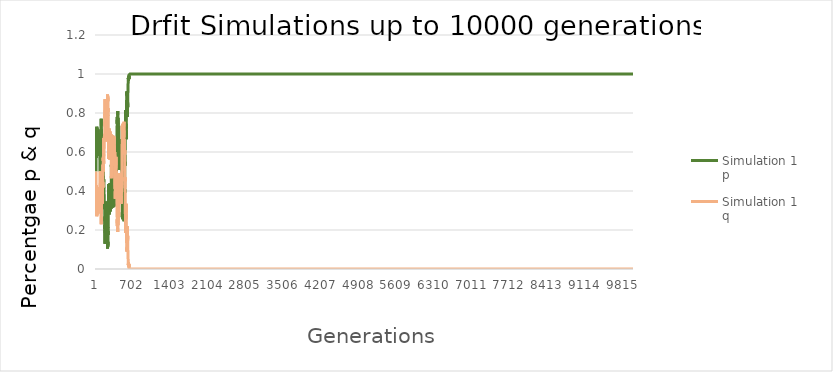
| Category | Simulation 1 p | Simulation 1 q |
|---|---|---|
| 0 | 0.5 | 0.5 |
| 1 | 0.54 | 0.46 |
| 2 | 0.58 | 0.42 |
| 3 | 0.605 | 0.395 |
| 4 | 0.625 | 0.375 |
| 5 | 0.57 | 0.43 |
| 6 | 0.65 | 0.35 |
| 7 | 0.68 | 0.32 |
| 8 | 0.685 | 0.315 |
| 9 | 0.695 | 0.305 |
| 10 | 0.665 | 0.335 |
| 11 | 0.705 | 0.295 |
| 12 | 0.73 | 0.27 |
| 13 | 0.72 | 0.28 |
| 14 | 0.705 | 0.295 |
| 15 | 0.725 | 0.275 |
| 16 | 0.71 | 0.29 |
| 17 | 0.72 | 0.28 |
| 18 | 0.69 | 0.31 |
| 19 | 0.685 | 0.315 |
| 20 | 0.69 | 0.31 |
| 21 | 0.675 | 0.325 |
| 22 | 0.62 | 0.38 |
| 23 | 0.66 | 0.34 |
| 24 | 0.7 | 0.3 |
| 25 | 0.635 | 0.365 |
| 26 | 0.62 | 0.38 |
| 27 | 0.59 | 0.41 |
| 28 | 0.625 | 0.375 |
| 29 | 0.635 | 0.365 |
| 30 | 0.63 | 0.37 |
| 31 | 0.595 | 0.405 |
| 32 | 0.595 | 0.405 |
| 33 | 0.595 | 0.405 |
| 34 | 0.61 | 0.39 |
| 35 | 0.645 | 0.355 |
| 36 | 0.65 | 0.35 |
| 37 | 0.675 | 0.325 |
| 38 | 0.715 | 0.285 |
| 39 | 0.685 | 0.315 |
| 40 | 0.665 | 0.335 |
| 41 | 0.67 | 0.33 |
| 42 | 0.64 | 0.36 |
| 43 | 0.6 | 0.4 |
| 44 | 0.58 | 0.42 |
| 45 | 0.575 | 0.425 |
| 46 | 0.625 | 0.375 |
| 47 | 0.63 | 0.37 |
| 48 | 0.645 | 0.355 |
| 49 | 0.63 | 0.37 |
| 50 | 0.6 | 0.4 |
| 51 | 0.66 | 0.34 |
| 52 | 0.645 | 0.355 |
| 53 | 0.655 | 0.345 |
| 54 | 0.655 | 0.345 |
| 55 | 0.61 | 0.39 |
| 56 | 0.645 | 0.355 |
| 57 | 0.6 | 0.4 |
| 58 | 0.635 | 0.365 |
| 59 | 0.63 | 0.37 |
| 60 | 0.64 | 0.36 |
| 61 | 0.605 | 0.395 |
| 62 | 0.595 | 0.405 |
| 63 | 0.645 | 0.355 |
| 64 | 0.615 | 0.385 |
| 65 | 0.645 | 0.355 |
| 66 | 0.65 | 0.35 |
| 67 | 0.635 | 0.365 |
| 68 | 0.65 | 0.35 |
| 69 | 0.63 | 0.37 |
| 70 | 0.6 | 0.4 |
| 71 | 0.695 | 0.305 |
| 72 | 0.66 | 0.34 |
| 73 | 0.625 | 0.375 |
| 74 | 0.63 | 0.37 |
| 75 | 0.595 | 0.405 |
| 76 | 0.615 | 0.385 |
| 77 | 0.62 | 0.38 |
| 78 | 0.56 | 0.44 |
| 79 | 0.5 | 0.5 |
| 80 | 0.595 | 0.405 |
| 81 | 0.61 | 0.39 |
| 82 | 0.61 | 0.39 |
| 83 | 0.585 | 0.415 |
| 84 | 0.53 | 0.47 |
| 85 | 0.5 | 0.5 |
| 86 | 0.52 | 0.48 |
| 87 | 0.57 | 0.43 |
| 88 | 0.54 | 0.46 |
| 89 | 0.585 | 0.415 |
| 90 | 0.605 | 0.395 |
| 91 | 0.62 | 0.38 |
| 92 | 0.61 | 0.39 |
| 93 | 0.625 | 0.375 |
| 94 | 0.575 | 0.425 |
| 95 | 0.675 | 0.325 |
| 96 | 0.77 | 0.23 |
| 97 | 0.735 | 0.265 |
| 98 | 0.69 | 0.31 |
| 99 | 0.715 | 0.285 |
| 100 | 0.655 | 0.345 |
| 101 | 0.635 | 0.365 |
| 102 | 0.6 | 0.4 |
| 103 | 0.655 | 0.345 |
| 104 | 0.645 | 0.355 |
| 105 | 0.635 | 0.365 |
| 106 | 0.62 | 0.38 |
| 107 | 0.62 | 0.38 |
| 108 | 0.57 | 0.43 |
| 109 | 0.605 | 0.395 |
| 110 | 0.56 | 0.44 |
| 111 | 0.555 | 0.445 |
| 112 | 0.545 | 0.455 |
| 113 | 0.555 | 0.445 |
| 114 | 0.55 | 0.45 |
| 115 | 0.58 | 0.42 |
| 116 | 0.555 | 0.445 |
| 117 | 0.645 | 0.355 |
| 118 | 0.665 | 0.335 |
| 119 | 0.61 | 0.39 |
| 120 | 0.565 | 0.435 |
| 121 | 0.565 | 0.435 |
| 122 | 0.55 | 0.45 |
| 123 | 0.58 | 0.42 |
| 124 | 0.555 | 0.445 |
| 125 | 0.585 | 0.415 |
| 126 | 0.545 | 0.455 |
| 127 | 0.535 | 0.465 |
| 128 | 0.495 | 0.505 |
| 129 | 0.465 | 0.535 |
| 130 | 0.465 | 0.535 |
| 131 | 0.47 | 0.53 |
| 132 | 0.5 | 0.5 |
| 133 | 0.46 | 0.54 |
| 134 | 0.43 | 0.57 |
| 135 | 0.445 | 0.555 |
| 136 | 0.43 | 0.57 |
| 137 | 0.42 | 0.58 |
| 138 | 0.365 | 0.635 |
| 139 | 0.33 | 0.67 |
| 140 | 0.395 | 0.605 |
| 141 | 0.405 | 0.595 |
| 142 | 0.4 | 0.6 |
| 143 | 0.46 | 0.54 |
| 144 | 0.445 | 0.555 |
| 145 | 0.44 | 0.56 |
| 146 | 0.42 | 0.58 |
| 147 | 0.42 | 0.58 |
| 148 | 0.42 | 0.58 |
| 149 | 0.425 | 0.575 |
| 150 | 0.415 | 0.585 |
| 151 | 0.38 | 0.62 |
| 152 | 0.37 | 0.63 |
| 153 | 0.375 | 0.625 |
| 154 | 0.325 | 0.675 |
| 155 | 0.33 | 0.67 |
| 156 | 0.32 | 0.68 |
| 157 | 0.33 | 0.67 |
| 158 | 0.31 | 0.69 |
| 159 | 0.32 | 0.68 |
| 160 | 0.305 | 0.695 |
| 161 | 0.27 | 0.73 |
| 162 | 0.22 | 0.78 |
| 163 | 0.205 | 0.795 |
| 164 | 0.225 | 0.775 |
| 165 | 0.185 | 0.815 |
| 166 | 0.13 | 0.87 |
| 167 | 0.135 | 0.865 |
| 168 | 0.2 | 0.8 |
| 169 | 0.255 | 0.745 |
| 170 | 0.245 | 0.755 |
| 171 | 0.27 | 0.73 |
| 172 | 0.255 | 0.745 |
| 173 | 0.265 | 0.735 |
| 174 | 0.245 | 0.755 |
| 175 | 0.245 | 0.755 |
| 176 | 0.285 | 0.715 |
| 177 | 0.325 | 0.675 |
| 178 | 0.285 | 0.715 |
| 179 | 0.345 | 0.655 |
| 180 | 0.315 | 0.685 |
| 181 | 0.305 | 0.695 |
| 182 | 0.255 | 0.745 |
| 183 | 0.24 | 0.76 |
| 184 | 0.245 | 0.755 |
| 185 | 0.3 | 0.7 |
| 186 | 0.26 | 0.74 |
| 187 | 0.345 | 0.655 |
| 188 | 0.325 | 0.675 |
| 189 | 0.325 | 0.675 |
| 190 | 0.305 | 0.695 |
| 191 | 0.31 | 0.69 |
| 192 | 0.265 | 0.735 |
| 193 | 0.275 | 0.725 |
| 194 | 0.265 | 0.735 |
| 195 | 0.235 | 0.765 |
| 196 | 0.255 | 0.745 |
| 197 | 0.275 | 0.725 |
| 198 | 0.275 | 0.725 |
| 199 | 0.235 | 0.765 |
| 200 | 0.215 | 0.785 |
| 201 | 0.22 | 0.78 |
| 202 | 0.165 | 0.835 |
| 203 | 0.18 | 0.82 |
| 204 | 0.185 | 0.815 |
| 205 | 0.175 | 0.825 |
| 206 | 0.18 | 0.82 |
| 207 | 0.185 | 0.815 |
| 208 | 0.21 | 0.79 |
| 209 | 0.255 | 0.745 |
| 210 | 0.19 | 0.81 |
| 211 | 0.19 | 0.81 |
| 212 | 0.155 | 0.845 |
| 213 | 0.12 | 0.88 |
| 214 | 0.135 | 0.865 |
| 215 | 0.105 | 0.895 |
| 216 | 0.115 | 0.885 |
| 217 | 0.115 | 0.885 |
| 218 | 0.125 | 0.875 |
| 219 | 0.14 | 0.86 |
| 220 | 0.115 | 0.885 |
| 221 | 0.14 | 0.86 |
| 222 | 0.17 | 0.83 |
| 223 | 0.195 | 0.805 |
| 224 | 0.175 | 0.825 |
| 225 | 0.215 | 0.785 |
| 226 | 0.245 | 0.755 |
| 227 | 0.265 | 0.735 |
| 228 | 0.275 | 0.725 |
| 229 | 0.33 | 0.67 |
| 230 | 0.365 | 0.635 |
| 231 | 0.39 | 0.61 |
| 232 | 0.435 | 0.565 |
| 233 | 0.38 | 0.62 |
| 234 | 0.36 | 0.64 |
| 235 | 0.375 | 0.625 |
| 236 | 0.385 | 0.615 |
| 237 | 0.41 | 0.59 |
| 238 | 0.405 | 0.595 |
| 239 | 0.375 | 0.625 |
| 240 | 0.345 | 0.655 |
| 241 | 0.37 | 0.63 |
| 242 | 0.41 | 0.59 |
| 243 | 0.35 | 0.65 |
| 244 | 0.28 | 0.72 |
| 245 | 0.315 | 0.685 |
| 246 | 0.335 | 0.665 |
| 247 | 0.33 | 0.67 |
| 248 | 0.345 | 0.655 |
| 249 | 0.375 | 0.625 |
| 250 | 0.365 | 0.635 |
| 251 | 0.41 | 0.59 |
| 252 | 0.42 | 0.58 |
| 253 | 0.38 | 0.62 |
| 254 | 0.385 | 0.615 |
| 255 | 0.39 | 0.61 |
| 256 | 0.435 | 0.565 |
| 257 | 0.425 | 0.575 |
| 258 | 0.415 | 0.585 |
| 259 | 0.425 | 0.575 |
| 260 | 0.41 | 0.59 |
| 261 | 0.44 | 0.56 |
| 262 | 0.4 | 0.6 |
| 263 | 0.38 | 0.62 |
| 264 | 0.34 | 0.66 |
| 265 | 0.295 | 0.705 |
| 266 | 0.345 | 0.655 |
| 267 | 0.35 | 0.65 |
| 268 | 0.33 | 0.67 |
| 269 | 0.33 | 0.67 |
| 270 | 0.355 | 0.645 |
| 271 | 0.39 | 0.61 |
| 272 | 0.4 | 0.6 |
| 273 | 0.405 | 0.595 |
| 274 | 0.385 | 0.615 |
| 275 | 0.35 | 0.65 |
| 276 | 0.335 | 0.665 |
| 277 | 0.31 | 0.69 |
| 278 | 0.305 | 0.695 |
| 279 | 0.34 | 0.66 |
| 280 | 0.31 | 0.69 |
| 281 | 0.315 | 0.685 |
| 282 | 0.35 | 0.65 |
| 283 | 0.4 | 0.6 |
| 284 | 0.48 | 0.52 |
| 285 | 0.535 | 0.465 |
| 286 | 0.5 | 0.5 |
| 287 | 0.5 | 0.5 |
| 288 | 0.495 | 0.505 |
| 289 | 0.505 | 0.495 |
| 290 | 0.425 | 0.575 |
| 291 | 0.475 | 0.525 |
| 292 | 0.45 | 0.55 |
| 293 | 0.435 | 0.565 |
| 294 | 0.47 | 0.53 |
| 295 | 0.425 | 0.575 |
| 296 | 0.46 | 0.54 |
| 297 | 0.475 | 0.525 |
| 298 | 0.455 | 0.545 |
| 299 | 0.455 | 0.545 |
| 300 | 0.465 | 0.535 |
| 301 | 0.465 | 0.535 |
| 302 | 0.44 | 0.56 |
| 303 | 0.435 | 0.565 |
| 304 | 0.365 | 0.635 |
| 305 | 0.34 | 0.66 |
| 306 | 0.35 | 0.65 |
| 307 | 0.37 | 0.63 |
| 308 | 0.355 | 0.645 |
| 309 | 0.32 | 0.68 |
| 310 | 0.33 | 0.67 |
| 311 | 0.315 | 0.685 |
| 312 | 0.31 | 0.69 |
| 313 | 0.335 | 0.665 |
| 314 | 0.38 | 0.62 |
| 315 | 0.41 | 0.59 |
| 316 | 0.4 | 0.6 |
| 317 | 0.375 | 0.625 |
| 318 | 0.4 | 0.6 |
| 319 | 0.39 | 0.61 |
| 320 | 0.4 | 0.6 |
| 321 | 0.4 | 0.6 |
| 322 | 0.355 | 0.645 |
| 323 | 0.355 | 0.645 |
| 324 | 0.35 | 0.65 |
| 325 | 0.375 | 0.625 |
| 326 | 0.46 | 0.54 |
| 327 | 0.415 | 0.585 |
| 328 | 0.39 | 0.61 |
| 329 | 0.415 | 0.585 |
| 330 | 0.36 | 0.64 |
| 331 | 0.395 | 0.605 |
| 332 | 0.41 | 0.59 |
| 333 | 0.41 | 0.59 |
| 334 | 0.37 | 0.63 |
| 335 | 0.34 | 0.66 |
| 336 | 0.32 | 0.68 |
| 337 | 0.335 | 0.665 |
| 338 | 0.39 | 0.61 |
| 339 | 0.385 | 0.615 |
| 340 | 0.435 | 0.565 |
| 341 | 0.435 | 0.565 |
| 342 | 0.47 | 0.53 |
| 343 | 0.465 | 0.535 |
| 344 | 0.455 | 0.545 |
| 345 | 0.47 | 0.53 |
| 346 | 0.415 | 0.585 |
| 347 | 0.4 | 0.6 |
| 348 | 0.425 | 0.575 |
| 349 | 0.505 | 0.495 |
| 350 | 0.515 | 0.485 |
| 351 | 0.535 | 0.465 |
| 352 | 0.475 | 0.525 |
| 353 | 0.53 | 0.47 |
| 354 | 0.55 | 0.45 |
| 355 | 0.59 | 0.41 |
| 356 | 0.535 | 0.465 |
| 357 | 0.57 | 0.43 |
| 358 | 0.6 | 0.4 |
| 359 | 0.64 | 0.36 |
| 360 | 0.58 | 0.42 |
| 361 | 0.615 | 0.385 |
| 362 | 0.58 | 0.42 |
| 363 | 0.555 | 0.445 |
| 364 | 0.59 | 0.41 |
| 365 | 0.545 | 0.455 |
| 366 | 0.54 | 0.46 |
| 367 | 0.525 | 0.475 |
| 368 | 0.485 | 0.515 |
| 369 | 0.465 | 0.535 |
| 370 | 0.425 | 0.575 |
| 371 | 0.485 | 0.515 |
| 372 | 0.5 | 0.5 |
| 373 | 0.525 | 0.475 |
| 374 | 0.5 | 0.5 |
| 375 | 0.53 | 0.47 |
| 376 | 0.525 | 0.475 |
| 377 | 0.525 | 0.475 |
| 378 | 0.55 | 0.45 |
| 379 | 0.525 | 0.475 |
| 380 | 0.6 | 0.4 |
| 381 | 0.57 | 0.43 |
| 382 | 0.57 | 0.43 |
| 383 | 0.585 | 0.415 |
| 384 | 0.565 | 0.435 |
| 385 | 0.525 | 0.475 |
| 386 | 0.575 | 0.425 |
| 387 | 0.585 | 0.415 |
| 388 | 0.595 | 0.405 |
| 389 | 0.625 | 0.375 |
| 390 | 0.69 | 0.31 |
| 391 | 0.71 | 0.29 |
| 392 | 0.73 | 0.27 |
| 393 | 0.755 | 0.245 |
| 394 | 0.77 | 0.23 |
| 395 | 0.78 | 0.22 |
| 396 | 0.745 | 0.255 |
| 397 | 0.77 | 0.23 |
| 398 | 0.78 | 0.22 |
| 399 | 0.765 | 0.235 |
| 400 | 0.72 | 0.28 |
| 401 | 0.71 | 0.29 |
| 402 | 0.76 | 0.24 |
| 403 | 0.81 | 0.19 |
| 404 | 0.79 | 0.21 |
| 405 | 0.75 | 0.25 |
| 406 | 0.695 | 0.305 |
| 407 | 0.715 | 0.285 |
| 408 | 0.74 | 0.26 |
| 409 | 0.755 | 0.245 |
| 410 | 0.775 | 0.225 |
| 411 | 0.74 | 0.26 |
| 412 | 0.735 | 0.265 |
| 413 | 0.675 | 0.325 |
| 414 | 0.655 | 0.345 |
| 415 | 0.625 | 0.375 |
| 416 | 0.615 | 0.385 |
| 417 | 0.65 | 0.35 |
| 418 | 0.68 | 0.32 |
| 419 | 0.71 | 0.29 |
| 420 | 0.735 | 0.265 |
| 421 | 0.645 | 0.355 |
| 422 | 0.63 | 0.37 |
| 423 | 0.595 | 0.405 |
| 424 | 0.54 | 0.46 |
| 425 | 0.545 | 0.455 |
| 426 | 0.52 | 0.48 |
| 427 | 0.56 | 0.44 |
| 428 | 0.525 | 0.475 |
| 429 | 0.51 | 0.49 |
| 430 | 0.505 | 0.495 |
| 431 | 0.52 | 0.48 |
| 432 | 0.55 | 0.45 |
| 433 | 0.625 | 0.375 |
| 434 | 0.6 | 0.4 |
| 435 | 0.61 | 0.39 |
| 436 | 0.615 | 0.385 |
| 437 | 0.6 | 0.4 |
| 438 | 0.555 | 0.445 |
| 439 | 0.555 | 0.445 |
| 440 | 0.51 | 0.49 |
| 441 | 0.545 | 0.455 |
| 442 | 0.555 | 0.445 |
| 443 | 0.515 | 0.485 |
| 444 | 0.54 | 0.46 |
| 445 | 0.55 | 0.45 |
| 446 | 0.565 | 0.435 |
| 447 | 0.575 | 0.425 |
| 448 | 0.625 | 0.375 |
| 449 | 0.62 | 0.38 |
| 450 | 0.575 | 0.425 |
| 451 | 0.59 | 0.41 |
| 452 | 0.635 | 0.365 |
| 453 | 0.62 | 0.38 |
| 454 | 0.605 | 0.395 |
| 455 | 0.62 | 0.38 |
| 456 | 0.595 | 0.405 |
| 457 | 0.62 | 0.38 |
| 458 | 0.625 | 0.375 |
| 459 | 0.625 | 0.375 |
| 460 | 0.61 | 0.39 |
| 461 | 0.57 | 0.43 |
| 462 | 0.58 | 0.42 |
| 463 | 0.55 | 0.45 |
| 464 | 0.585 | 0.415 |
| 465 | 0.575 | 0.425 |
| 466 | 0.635 | 0.365 |
| 467 | 0.665 | 0.335 |
| 468 | 0.625 | 0.375 |
| 469 | 0.59 | 0.41 |
| 470 | 0.61 | 0.39 |
| 471 | 0.59 | 0.41 |
| 472 | 0.59 | 0.41 |
| 473 | 0.6 | 0.4 |
| 474 | 0.575 | 0.425 |
| 475 | 0.6 | 0.4 |
| 476 | 0.56 | 0.44 |
| 477 | 0.535 | 0.465 |
| 478 | 0.53 | 0.47 |
| 479 | 0.535 | 0.465 |
| 480 | 0.525 | 0.475 |
| 481 | 0.465 | 0.535 |
| 482 | 0.47 | 0.53 |
| 483 | 0.465 | 0.535 |
| 484 | 0.4 | 0.6 |
| 485 | 0.36 | 0.64 |
| 486 | 0.335 | 0.665 |
| 487 | 0.31 | 0.69 |
| 488 | 0.31 | 0.69 |
| 489 | 0.265 | 0.735 |
| 490 | 0.3 | 0.7 |
| 491 | 0.325 | 0.675 |
| 492 | 0.38 | 0.62 |
| 493 | 0.395 | 0.605 |
| 494 | 0.37 | 0.63 |
| 495 | 0.32 | 0.68 |
| 496 | 0.285 | 0.715 |
| 497 | 0.255 | 0.745 |
| 498 | 0.31 | 0.69 |
| 499 | 0.31 | 0.69 |
| 500 | 0.325 | 0.675 |
| 501 | 0.355 | 0.645 |
| 502 | 0.38 | 0.62 |
| 503 | 0.39 | 0.61 |
| 504 | 0.36 | 0.64 |
| 505 | 0.365 | 0.635 |
| 506 | 0.365 | 0.635 |
| 507 | 0.33 | 0.67 |
| 508 | 0.37 | 0.63 |
| 509 | 0.335 | 0.665 |
| 510 | 0.34 | 0.66 |
| 511 | 0.36 | 0.64 |
| 512 | 0.345 | 0.655 |
| 513 | 0.3 | 0.7 |
| 514 | 0.295 | 0.705 |
| 515 | 0.29 | 0.71 |
| 516 | 0.325 | 0.675 |
| 517 | 0.27 | 0.73 |
| 518 | 0.245 | 0.755 |
| 519 | 0.27 | 0.73 |
| 520 | 0.325 | 0.675 |
| 521 | 0.33 | 0.67 |
| 522 | 0.38 | 0.62 |
| 523 | 0.37 | 0.63 |
| 524 | 0.365 | 0.635 |
| 525 | 0.36 | 0.64 |
| 526 | 0.38 | 0.62 |
| 527 | 0.335 | 0.665 |
| 528 | 0.4 | 0.6 |
| 529 | 0.4 | 0.6 |
| 530 | 0.37 | 0.63 |
| 531 | 0.39 | 0.61 |
| 532 | 0.41 | 0.59 |
| 533 | 0.39 | 0.61 |
| 534 | 0.405 | 0.595 |
| 535 | 0.46 | 0.54 |
| 536 | 0.53 | 0.47 |
| 537 | 0.535 | 0.465 |
| 538 | 0.55 | 0.45 |
| 539 | 0.53 | 0.47 |
| 540 | 0.585 | 0.415 |
| 541 | 0.61 | 0.39 |
| 542 | 0.69 | 0.31 |
| 543 | 0.685 | 0.315 |
| 544 | 0.69 | 0.31 |
| 545 | 0.7 | 0.3 |
| 546 | 0.74 | 0.26 |
| 547 | 0.75 | 0.25 |
| 548 | 0.76 | 0.24 |
| 549 | 0.795 | 0.205 |
| 550 | 0.815 | 0.185 |
| 551 | 0.82 | 0.18 |
| 552 | 0.815 | 0.185 |
| 553 | 0.76 | 0.24 |
| 554 | 0.74 | 0.26 |
| 555 | 0.72 | 0.28 |
| 556 | 0.73 | 0.27 |
| 557 | 0.73 | 0.27 |
| 558 | 0.745 | 0.255 |
| 559 | 0.72 | 0.28 |
| 560 | 0.715 | 0.285 |
| 561 | 0.665 | 0.335 |
| 562 | 0.715 | 0.285 |
| 563 | 0.73 | 0.27 |
| 564 | 0.785 | 0.215 |
| 565 | 0.805 | 0.195 |
| 566 | 0.855 | 0.145 |
| 567 | 0.825 | 0.175 |
| 568 | 0.865 | 0.135 |
| 569 | 0.835 | 0.165 |
| 570 | 0.83 | 0.17 |
| 571 | 0.86 | 0.14 |
| 572 | 0.86 | 0.14 |
| 573 | 0.9 | 0.1 |
| 574 | 0.91 | 0.09 |
| 575 | 0.895 | 0.105 |
| 576 | 0.905 | 0.095 |
| 577 | 0.89 | 0.11 |
| 578 | 0.91 | 0.09 |
| 579 | 0.885 | 0.115 |
| 580 | 0.885 | 0.115 |
| 581 | 0.87 | 0.13 |
| 582 | 0.805 | 0.195 |
| 583 | 0.83 | 0.17 |
| 584 | 0.78 | 0.22 |
| 585 | 0.83 | 0.17 |
| 586 | 0.89 | 0.11 |
| 587 | 0.855 | 0.145 |
| 588 | 0.83 | 0.17 |
| 589 | 0.855 | 0.145 |
| 590 | 0.86 | 0.14 |
| 591 | 0.89 | 0.11 |
| 592 | 0.905 | 0.095 |
| 593 | 0.915 | 0.085 |
| 594 | 0.92 | 0.08 |
| 595 | 0.91 | 0.09 |
| 596 | 0.93 | 0.07 |
| 597 | 0.965 | 0.035 |
| 598 | 0.96 | 0.04 |
| 599 | 0.96 | 0.04 |
| 600 | 0.98 | 0.02 |
| 601 | 0.975 | 0.025 |
| 602 | 0.98 | 0.02 |
| 603 | 0.965 | 0.035 |
| 604 | 0.96 | 0.04 |
| 605 | 0.96 | 0.04 |
| 606 | 0.96 | 0.04 |
| 607 | 0.975 | 0.025 |
| 608 | 0.97 | 0.03 |
| 609 | 0.97 | 0.03 |
| 610 | 0.98 | 0.02 |
| 611 | 0.99 | 0.01 |
| 612 | 0.985 | 0.015 |
| 613 | 0.975 | 0.025 |
| 614 | 0.995 | 0.005 |
| 615 | 1 | 0 |
| 616 | 1 | 0 |
| 617 | 1 | 0 |
| 618 | 1 | 0 |
| 619 | 1 | 0 |
| 620 | 1 | 0 |
| 621 | 1 | 0 |
| 622 | 1 | 0 |
| 623 | 1 | 0 |
| 624 | 1 | 0 |
| 625 | 1 | 0 |
| 626 | 1 | 0 |
| 627 | 1 | 0 |
| 628 | 1 | 0 |
| 629 | 1 | 0 |
| 630 | 1 | 0 |
| 631 | 1 | 0 |
| 632 | 1 | 0 |
| 633 | 1 | 0 |
| 634 | 1 | 0 |
| 635 | 1 | 0 |
| 636 | 1 | 0 |
| 637 | 1 | 0 |
| 638 | 1 | 0 |
| 639 | 1 | 0 |
| 640 | 1 | 0 |
| 641 | 1 | 0 |
| 642 | 1 | 0 |
| 643 | 1 | 0 |
| 644 | 1 | 0 |
| 645 | 1 | 0 |
| 646 | 1 | 0 |
| 647 | 1 | 0 |
| 648 | 1 | 0 |
| 649 | 1 | 0 |
| 650 | 1 | 0 |
| 651 | 1 | 0 |
| 652 | 1 | 0 |
| 653 | 1 | 0 |
| 654 | 1 | 0 |
| 655 | 1 | 0 |
| 656 | 1 | 0 |
| 657 | 1 | 0 |
| 658 | 1 | 0 |
| 659 | 1 | 0 |
| 660 | 1 | 0 |
| 661 | 1 | 0 |
| 662 | 1 | 0 |
| 663 | 1 | 0 |
| 664 | 1 | 0 |
| 665 | 1 | 0 |
| 666 | 1 | 0 |
| 667 | 1 | 0 |
| 668 | 1 | 0 |
| 669 | 1 | 0 |
| 670 | 1 | 0 |
| 671 | 1 | 0 |
| 672 | 1 | 0 |
| 673 | 1 | 0 |
| 674 | 1 | 0 |
| 675 | 1 | 0 |
| 676 | 1 | 0 |
| 677 | 1 | 0 |
| 678 | 1 | 0 |
| 679 | 1 | 0 |
| 680 | 1 | 0 |
| 681 | 1 | 0 |
| 682 | 1 | 0 |
| 683 | 1 | 0 |
| 684 | 1 | 0 |
| 685 | 1 | 0 |
| 686 | 1 | 0 |
| 687 | 1 | 0 |
| 688 | 1 | 0 |
| 689 | 1 | 0 |
| 690 | 1 | 0 |
| 691 | 1 | 0 |
| 692 | 1 | 0 |
| 693 | 1 | 0 |
| 694 | 1 | 0 |
| 695 | 1 | 0 |
| 696 | 1 | 0 |
| 697 | 1 | 0 |
| 698 | 1 | 0 |
| 699 | 1 | 0 |
| 700 | 1 | 0 |
| 701 | 1 | 0 |
| 702 | 1 | 0 |
| 703 | 1 | 0 |
| 704 | 1 | 0 |
| 705 | 1 | 0 |
| 706 | 1 | 0 |
| 707 | 1 | 0 |
| 708 | 1 | 0 |
| 709 | 1 | 0 |
| 710 | 1 | 0 |
| 711 | 1 | 0 |
| 712 | 1 | 0 |
| 713 | 1 | 0 |
| 714 | 1 | 0 |
| 715 | 1 | 0 |
| 716 | 1 | 0 |
| 717 | 1 | 0 |
| 718 | 1 | 0 |
| 719 | 1 | 0 |
| 720 | 1 | 0 |
| 721 | 1 | 0 |
| 722 | 1 | 0 |
| 723 | 1 | 0 |
| 724 | 1 | 0 |
| 725 | 1 | 0 |
| 726 | 1 | 0 |
| 727 | 1 | 0 |
| 728 | 1 | 0 |
| 729 | 1 | 0 |
| 730 | 1 | 0 |
| 731 | 1 | 0 |
| 732 | 1 | 0 |
| 733 | 1 | 0 |
| 734 | 1 | 0 |
| 735 | 1 | 0 |
| 736 | 1 | 0 |
| 737 | 1 | 0 |
| 738 | 1 | 0 |
| 739 | 1 | 0 |
| 740 | 1 | 0 |
| 741 | 1 | 0 |
| 742 | 1 | 0 |
| 743 | 1 | 0 |
| 744 | 1 | 0 |
| 745 | 1 | 0 |
| 746 | 1 | 0 |
| 747 | 1 | 0 |
| 748 | 1 | 0 |
| 749 | 1 | 0 |
| 750 | 1 | 0 |
| 751 | 1 | 0 |
| 752 | 1 | 0 |
| 753 | 1 | 0 |
| 754 | 1 | 0 |
| 755 | 1 | 0 |
| 756 | 1 | 0 |
| 757 | 1 | 0 |
| 758 | 1 | 0 |
| 759 | 1 | 0 |
| 760 | 1 | 0 |
| 761 | 1 | 0 |
| 762 | 1 | 0 |
| 763 | 1 | 0 |
| 764 | 1 | 0 |
| 765 | 1 | 0 |
| 766 | 1 | 0 |
| 767 | 1 | 0 |
| 768 | 1 | 0 |
| 769 | 1 | 0 |
| 770 | 1 | 0 |
| 771 | 1 | 0 |
| 772 | 1 | 0 |
| 773 | 1 | 0 |
| 774 | 1 | 0 |
| 775 | 1 | 0 |
| 776 | 1 | 0 |
| 777 | 1 | 0 |
| 778 | 1 | 0 |
| 779 | 1 | 0 |
| 780 | 1 | 0 |
| 781 | 1 | 0 |
| 782 | 1 | 0 |
| 783 | 1 | 0 |
| 784 | 1 | 0 |
| 785 | 1 | 0 |
| 786 | 1 | 0 |
| 787 | 1 | 0 |
| 788 | 1 | 0 |
| 789 | 1 | 0 |
| 790 | 1 | 0 |
| 791 | 1 | 0 |
| 792 | 1 | 0 |
| 793 | 1 | 0 |
| 794 | 1 | 0 |
| 795 | 1 | 0 |
| 796 | 1 | 0 |
| 797 | 1 | 0 |
| 798 | 1 | 0 |
| 799 | 1 | 0 |
| 800 | 1 | 0 |
| 801 | 1 | 0 |
| 802 | 1 | 0 |
| 803 | 1 | 0 |
| 804 | 1 | 0 |
| 805 | 1 | 0 |
| 806 | 1 | 0 |
| 807 | 1 | 0 |
| 808 | 1 | 0 |
| 809 | 1 | 0 |
| 810 | 1 | 0 |
| 811 | 1 | 0 |
| 812 | 1 | 0 |
| 813 | 1 | 0 |
| 814 | 1 | 0 |
| 815 | 1 | 0 |
| 816 | 1 | 0 |
| 817 | 1 | 0 |
| 818 | 1 | 0 |
| 819 | 1 | 0 |
| 820 | 1 | 0 |
| 821 | 1 | 0 |
| 822 | 1 | 0 |
| 823 | 1 | 0 |
| 824 | 1 | 0 |
| 825 | 1 | 0 |
| 826 | 1 | 0 |
| 827 | 1 | 0 |
| 828 | 1 | 0 |
| 829 | 1 | 0 |
| 830 | 1 | 0 |
| 831 | 1 | 0 |
| 832 | 1 | 0 |
| 833 | 1 | 0 |
| 834 | 1 | 0 |
| 835 | 1 | 0 |
| 836 | 1 | 0 |
| 837 | 1 | 0 |
| 838 | 1 | 0 |
| 839 | 1 | 0 |
| 840 | 1 | 0 |
| 841 | 1 | 0 |
| 842 | 1 | 0 |
| 843 | 1 | 0 |
| 844 | 1 | 0 |
| 845 | 1 | 0 |
| 846 | 1 | 0 |
| 847 | 1 | 0 |
| 848 | 1 | 0 |
| 849 | 1 | 0 |
| 850 | 1 | 0 |
| 851 | 1 | 0 |
| 852 | 1 | 0 |
| 853 | 1 | 0 |
| 854 | 1 | 0 |
| 855 | 1 | 0 |
| 856 | 1 | 0 |
| 857 | 1 | 0 |
| 858 | 1 | 0 |
| 859 | 1 | 0 |
| 860 | 1 | 0 |
| 861 | 1 | 0 |
| 862 | 1 | 0 |
| 863 | 1 | 0 |
| 864 | 1 | 0 |
| 865 | 1 | 0 |
| 866 | 1 | 0 |
| 867 | 1 | 0 |
| 868 | 1 | 0 |
| 869 | 1 | 0 |
| 870 | 1 | 0 |
| 871 | 1 | 0 |
| 872 | 1 | 0 |
| 873 | 1 | 0 |
| 874 | 1 | 0 |
| 875 | 1 | 0 |
| 876 | 1 | 0 |
| 877 | 1 | 0 |
| 878 | 1 | 0 |
| 879 | 1 | 0 |
| 880 | 1 | 0 |
| 881 | 1 | 0 |
| 882 | 1 | 0 |
| 883 | 1 | 0 |
| 884 | 1 | 0 |
| 885 | 1 | 0 |
| 886 | 1 | 0 |
| 887 | 1 | 0 |
| 888 | 1 | 0 |
| 889 | 1 | 0 |
| 890 | 1 | 0 |
| 891 | 1 | 0 |
| 892 | 1 | 0 |
| 893 | 1 | 0 |
| 894 | 1 | 0 |
| 895 | 1 | 0 |
| 896 | 1 | 0 |
| 897 | 1 | 0 |
| 898 | 1 | 0 |
| 899 | 1 | 0 |
| 900 | 1 | 0 |
| 901 | 1 | 0 |
| 902 | 1 | 0 |
| 903 | 1 | 0 |
| 904 | 1 | 0 |
| 905 | 1 | 0 |
| 906 | 1 | 0 |
| 907 | 1 | 0 |
| 908 | 1 | 0 |
| 909 | 1 | 0 |
| 910 | 1 | 0 |
| 911 | 1 | 0 |
| 912 | 1 | 0 |
| 913 | 1 | 0 |
| 914 | 1 | 0 |
| 915 | 1 | 0 |
| 916 | 1 | 0 |
| 917 | 1 | 0 |
| 918 | 1 | 0 |
| 919 | 1 | 0 |
| 920 | 1 | 0 |
| 921 | 1 | 0 |
| 922 | 1 | 0 |
| 923 | 1 | 0 |
| 924 | 1 | 0 |
| 925 | 1 | 0 |
| 926 | 1 | 0 |
| 927 | 1 | 0 |
| 928 | 1 | 0 |
| 929 | 1 | 0 |
| 930 | 1 | 0 |
| 931 | 1 | 0 |
| 932 | 1 | 0 |
| 933 | 1 | 0 |
| 934 | 1 | 0 |
| 935 | 1 | 0 |
| 936 | 1 | 0 |
| 937 | 1 | 0 |
| 938 | 1 | 0 |
| 939 | 1 | 0 |
| 940 | 1 | 0 |
| 941 | 1 | 0 |
| 942 | 1 | 0 |
| 943 | 1 | 0 |
| 944 | 1 | 0 |
| 945 | 1 | 0 |
| 946 | 1 | 0 |
| 947 | 1 | 0 |
| 948 | 1 | 0 |
| 949 | 1 | 0 |
| 950 | 1 | 0 |
| 951 | 1 | 0 |
| 952 | 1 | 0 |
| 953 | 1 | 0 |
| 954 | 1 | 0 |
| 955 | 1 | 0 |
| 956 | 1 | 0 |
| 957 | 1 | 0 |
| 958 | 1 | 0 |
| 959 | 1 | 0 |
| 960 | 1 | 0 |
| 961 | 1 | 0 |
| 962 | 1 | 0 |
| 963 | 1 | 0 |
| 964 | 1 | 0 |
| 965 | 1 | 0 |
| 966 | 1 | 0 |
| 967 | 1 | 0 |
| 968 | 1 | 0 |
| 969 | 1 | 0 |
| 970 | 1 | 0 |
| 971 | 1 | 0 |
| 972 | 1 | 0 |
| 973 | 1 | 0 |
| 974 | 1 | 0 |
| 975 | 1 | 0 |
| 976 | 1 | 0 |
| 977 | 1 | 0 |
| 978 | 1 | 0 |
| 979 | 1 | 0 |
| 980 | 1 | 0 |
| 981 | 1 | 0 |
| 982 | 1 | 0 |
| 983 | 1 | 0 |
| 984 | 1 | 0 |
| 985 | 1 | 0 |
| 986 | 1 | 0 |
| 987 | 1 | 0 |
| 988 | 1 | 0 |
| 989 | 1 | 0 |
| 990 | 1 | 0 |
| 991 | 1 | 0 |
| 992 | 1 | 0 |
| 993 | 1 | 0 |
| 994 | 1 | 0 |
| 995 | 1 | 0 |
| 996 | 1 | 0 |
| 997 | 1 | 0 |
| 998 | 1 | 0 |
| 999 | 1 | 0 |
| 1000 | 1 | 0 |
| 1001 | 1 | 0 |
| 1002 | 1 | 0 |
| 1003 | 1 | 0 |
| 1004 | 1 | 0 |
| 1005 | 1 | 0 |
| 1006 | 1 | 0 |
| 1007 | 1 | 0 |
| 1008 | 1 | 0 |
| 1009 | 1 | 0 |
| 1010 | 1 | 0 |
| 1011 | 1 | 0 |
| 1012 | 1 | 0 |
| 1013 | 1 | 0 |
| 1014 | 1 | 0 |
| 1015 | 1 | 0 |
| 1016 | 1 | 0 |
| 1017 | 1 | 0 |
| 1018 | 1 | 0 |
| 1019 | 1 | 0 |
| 1020 | 1 | 0 |
| 1021 | 1 | 0 |
| 1022 | 1 | 0 |
| 1023 | 1 | 0 |
| 1024 | 1 | 0 |
| 1025 | 1 | 0 |
| 1026 | 1 | 0 |
| 1027 | 1 | 0 |
| 1028 | 1 | 0 |
| 1029 | 1 | 0 |
| 1030 | 1 | 0 |
| 1031 | 1 | 0 |
| 1032 | 1 | 0 |
| 1033 | 1 | 0 |
| 1034 | 1 | 0 |
| 1035 | 1 | 0 |
| 1036 | 1 | 0 |
| 1037 | 1 | 0 |
| 1038 | 1 | 0 |
| 1039 | 1 | 0 |
| 1040 | 1 | 0 |
| 1041 | 1 | 0 |
| 1042 | 1 | 0 |
| 1043 | 1 | 0 |
| 1044 | 1 | 0 |
| 1045 | 1 | 0 |
| 1046 | 1 | 0 |
| 1047 | 1 | 0 |
| 1048 | 1 | 0 |
| 1049 | 1 | 0 |
| 1050 | 1 | 0 |
| 1051 | 1 | 0 |
| 1052 | 1 | 0 |
| 1053 | 1 | 0 |
| 1054 | 1 | 0 |
| 1055 | 1 | 0 |
| 1056 | 1 | 0 |
| 1057 | 1 | 0 |
| 1058 | 1 | 0 |
| 1059 | 1 | 0 |
| 1060 | 1 | 0 |
| 1061 | 1 | 0 |
| 1062 | 1 | 0 |
| 1063 | 1 | 0 |
| 1064 | 1 | 0 |
| 1065 | 1 | 0 |
| 1066 | 1 | 0 |
| 1067 | 1 | 0 |
| 1068 | 1 | 0 |
| 1069 | 1 | 0 |
| 1070 | 1 | 0 |
| 1071 | 1 | 0 |
| 1072 | 1 | 0 |
| 1073 | 1 | 0 |
| 1074 | 1 | 0 |
| 1075 | 1 | 0 |
| 1076 | 1 | 0 |
| 1077 | 1 | 0 |
| 1078 | 1 | 0 |
| 1079 | 1 | 0 |
| 1080 | 1 | 0 |
| 1081 | 1 | 0 |
| 1082 | 1 | 0 |
| 1083 | 1 | 0 |
| 1084 | 1 | 0 |
| 1085 | 1 | 0 |
| 1086 | 1 | 0 |
| 1087 | 1 | 0 |
| 1088 | 1 | 0 |
| 1089 | 1 | 0 |
| 1090 | 1 | 0 |
| 1091 | 1 | 0 |
| 1092 | 1 | 0 |
| 1093 | 1 | 0 |
| 1094 | 1 | 0 |
| 1095 | 1 | 0 |
| 1096 | 1 | 0 |
| 1097 | 1 | 0 |
| 1098 | 1 | 0 |
| 1099 | 1 | 0 |
| 1100 | 1 | 0 |
| 1101 | 1 | 0 |
| 1102 | 1 | 0 |
| 1103 | 1 | 0 |
| 1104 | 1 | 0 |
| 1105 | 1 | 0 |
| 1106 | 1 | 0 |
| 1107 | 1 | 0 |
| 1108 | 1 | 0 |
| 1109 | 1 | 0 |
| 1110 | 1 | 0 |
| 1111 | 1 | 0 |
| 1112 | 1 | 0 |
| 1113 | 1 | 0 |
| 1114 | 1 | 0 |
| 1115 | 1 | 0 |
| 1116 | 1 | 0 |
| 1117 | 1 | 0 |
| 1118 | 1 | 0 |
| 1119 | 1 | 0 |
| 1120 | 1 | 0 |
| 1121 | 1 | 0 |
| 1122 | 1 | 0 |
| 1123 | 1 | 0 |
| 1124 | 1 | 0 |
| 1125 | 1 | 0 |
| 1126 | 1 | 0 |
| 1127 | 1 | 0 |
| 1128 | 1 | 0 |
| 1129 | 1 | 0 |
| 1130 | 1 | 0 |
| 1131 | 1 | 0 |
| 1132 | 1 | 0 |
| 1133 | 1 | 0 |
| 1134 | 1 | 0 |
| 1135 | 1 | 0 |
| 1136 | 1 | 0 |
| 1137 | 1 | 0 |
| 1138 | 1 | 0 |
| 1139 | 1 | 0 |
| 1140 | 1 | 0 |
| 1141 | 1 | 0 |
| 1142 | 1 | 0 |
| 1143 | 1 | 0 |
| 1144 | 1 | 0 |
| 1145 | 1 | 0 |
| 1146 | 1 | 0 |
| 1147 | 1 | 0 |
| 1148 | 1 | 0 |
| 1149 | 1 | 0 |
| 1150 | 1 | 0 |
| 1151 | 1 | 0 |
| 1152 | 1 | 0 |
| 1153 | 1 | 0 |
| 1154 | 1 | 0 |
| 1155 | 1 | 0 |
| 1156 | 1 | 0 |
| 1157 | 1 | 0 |
| 1158 | 1 | 0 |
| 1159 | 1 | 0 |
| 1160 | 1 | 0 |
| 1161 | 1 | 0 |
| 1162 | 1 | 0 |
| 1163 | 1 | 0 |
| 1164 | 1 | 0 |
| 1165 | 1 | 0 |
| 1166 | 1 | 0 |
| 1167 | 1 | 0 |
| 1168 | 1 | 0 |
| 1169 | 1 | 0 |
| 1170 | 1 | 0 |
| 1171 | 1 | 0 |
| 1172 | 1 | 0 |
| 1173 | 1 | 0 |
| 1174 | 1 | 0 |
| 1175 | 1 | 0 |
| 1176 | 1 | 0 |
| 1177 | 1 | 0 |
| 1178 | 1 | 0 |
| 1179 | 1 | 0 |
| 1180 | 1 | 0 |
| 1181 | 1 | 0 |
| 1182 | 1 | 0 |
| 1183 | 1 | 0 |
| 1184 | 1 | 0 |
| 1185 | 1 | 0 |
| 1186 | 1 | 0 |
| 1187 | 1 | 0 |
| 1188 | 1 | 0 |
| 1189 | 1 | 0 |
| 1190 | 1 | 0 |
| 1191 | 1 | 0 |
| 1192 | 1 | 0 |
| 1193 | 1 | 0 |
| 1194 | 1 | 0 |
| 1195 | 1 | 0 |
| 1196 | 1 | 0 |
| 1197 | 1 | 0 |
| 1198 | 1 | 0 |
| 1199 | 1 | 0 |
| 1200 | 1 | 0 |
| 1201 | 1 | 0 |
| 1202 | 1 | 0 |
| 1203 | 1 | 0 |
| 1204 | 1 | 0 |
| 1205 | 1 | 0 |
| 1206 | 1 | 0 |
| 1207 | 1 | 0 |
| 1208 | 1 | 0 |
| 1209 | 1 | 0 |
| 1210 | 1 | 0 |
| 1211 | 1 | 0 |
| 1212 | 1 | 0 |
| 1213 | 1 | 0 |
| 1214 | 1 | 0 |
| 1215 | 1 | 0 |
| 1216 | 1 | 0 |
| 1217 | 1 | 0 |
| 1218 | 1 | 0 |
| 1219 | 1 | 0 |
| 1220 | 1 | 0 |
| 1221 | 1 | 0 |
| 1222 | 1 | 0 |
| 1223 | 1 | 0 |
| 1224 | 1 | 0 |
| 1225 | 1 | 0 |
| 1226 | 1 | 0 |
| 1227 | 1 | 0 |
| 1228 | 1 | 0 |
| 1229 | 1 | 0 |
| 1230 | 1 | 0 |
| 1231 | 1 | 0 |
| 1232 | 1 | 0 |
| 1233 | 1 | 0 |
| 1234 | 1 | 0 |
| 1235 | 1 | 0 |
| 1236 | 1 | 0 |
| 1237 | 1 | 0 |
| 1238 | 1 | 0 |
| 1239 | 1 | 0 |
| 1240 | 1 | 0 |
| 1241 | 1 | 0 |
| 1242 | 1 | 0 |
| 1243 | 1 | 0 |
| 1244 | 1 | 0 |
| 1245 | 1 | 0 |
| 1246 | 1 | 0 |
| 1247 | 1 | 0 |
| 1248 | 1 | 0 |
| 1249 | 1 | 0 |
| 1250 | 1 | 0 |
| 1251 | 1 | 0 |
| 1252 | 1 | 0 |
| 1253 | 1 | 0 |
| 1254 | 1 | 0 |
| 1255 | 1 | 0 |
| 1256 | 1 | 0 |
| 1257 | 1 | 0 |
| 1258 | 1 | 0 |
| 1259 | 1 | 0 |
| 1260 | 1 | 0 |
| 1261 | 1 | 0 |
| 1262 | 1 | 0 |
| 1263 | 1 | 0 |
| 1264 | 1 | 0 |
| 1265 | 1 | 0 |
| 1266 | 1 | 0 |
| 1267 | 1 | 0 |
| 1268 | 1 | 0 |
| 1269 | 1 | 0 |
| 1270 | 1 | 0 |
| 1271 | 1 | 0 |
| 1272 | 1 | 0 |
| 1273 | 1 | 0 |
| 1274 | 1 | 0 |
| 1275 | 1 | 0 |
| 1276 | 1 | 0 |
| 1277 | 1 | 0 |
| 1278 | 1 | 0 |
| 1279 | 1 | 0 |
| 1280 | 1 | 0 |
| 1281 | 1 | 0 |
| 1282 | 1 | 0 |
| 1283 | 1 | 0 |
| 1284 | 1 | 0 |
| 1285 | 1 | 0 |
| 1286 | 1 | 0 |
| 1287 | 1 | 0 |
| 1288 | 1 | 0 |
| 1289 | 1 | 0 |
| 1290 | 1 | 0 |
| 1291 | 1 | 0 |
| 1292 | 1 | 0 |
| 1293 | 1 | 0 |
| 1294 | 1 | 0 |
| 1295 | 1 | 0 |
| 1296 | 1 | 0 |
| 1297 | 1 | 0 |
| 1298 | 1 | 0 |
| 1299 | 1 | 0 |
| 1300 | 1 | 0 |
| 1301 | 1 | 0 |
| 1302 | 1 | 0 |
| 1303 | 1 | 0 |
| 1304 | 1 | 0 |
| 1305 | 1 | 0 |
| 1306 | 1 | 0 |
| 1307 | 1 | 0 |
| 1308 | 1 | 0 |
| 1309 | 1 | 0 |
| 1310 | 1 | 0 |
| 1311 | 1 | 0 |
| 1312 | 1 | 0 |
| 1313 | 1 | 0 |
| 1314 | 1 | 0 |
| 1315 | 1 | 0 |
| 1316 | 1 | 0 |
| 1317 | 1 | 0 |
| 1318 | 1 | 0 |
| 1319 | 1 | 0 |
| 1320 | 1 | 0 |
| 1321 | 1 | 0 |
| 1322 | 1 | 0 |
| 1323 | 1 | 0 |
| 1324 | 1 | 0 |
| 1325 | 1 | 0 |
| 1326 | 1 | 0 |
| 1327 | 1 | 0 |
| 1328 | 1 | 0 |
| 1329 | 1 | 0 |
| 1330 | 1 | 0 |
| 1331 | 1 | 0 |
| 1332 | 1 | 0 |
| 1333 | 1 | 0 |
| 1334 | 1 | 0 |
| 1335 | 1 | 0 |
| 1336 | 1 | 0 |
| 1337 | 1 | 0 |
| 1338 | 1 | 0 |
| 1339 | 1 | 0 |
| 1340 | 1 | 0 |
| 1341 | 1 | 0 |
| 1342 | 1 | 0 |
| 1343 | 1 | 0 |
| 1344 | 1 | 0 |
| 1345 | 1 | 0 |
| 1346 | 1 | 0 |
| 1347 | 1 | 0 |
| 1348 | 1 | 0 |
| 1349 | 1 | 0 |
| 1350 | 1 | 0 |
| 1351 | 1 | 0 |
| 1352 | 1 | 0 |
| 1353 | 1 | 0 |
| 1354 | 1 | 0 |
| 1355 | 1 | 0 |
| 1356 | 1 | 0 |
| 1357 | 1 | 0 |
| 1358 | 1 | 0 |
| 1359 | 1 | 0 |
| 1360 | 1 | 0 |
| 1361 | 1 | 0 |
| 1362 | 1 | 0 |
| 1363 | 1 | 0 |
| 1364 | 1 | 0 |
| 1365 | 1 | 0 |
| 1366 | 1 | 0 |
| 1367 | 1 | 0 |
| 1368 | 1 | 0 |
| 1369 | 1 | 0 |
| 1370 | 1 | 0 |
| 1371 | 1 | 0 |
| 1372 | 1 | 0 |
| 1373 | 1 | 0 |
| 1374 | 1 | 0 |
| 1375 | 1 | 0 |
| 1376 | 1 | 0 |
| 1377 | 1 | 0 |
| 1378 | 1 | 0 |
| 1379 | 1 | 0 |
| 1380 | 1 | 0 |
| 1381 | 1 | 0 |
| 1382 | 1 | 0 |
| 1383 | 1 | 0 |
| 1384 | 1 | 0 |
| 1385 | 1 | 0 |
| 1386 | 1 | 0 |
| 1387 | 1 | 0 |
| 1388 | 1 | 0 |
| 1389 | 1 | 0 |
| 1390 | 1 | 0 |
| 1391 | 1 | 0 |
| 1392 | 1 | 0 |
| 1393 | 1 | 0 |
| 1394 | 1 | 0 |
| 1395 | 1 | 0 |
| 1396 | 1 | 0 |
| 1397 | 1 | 0 |
| 1398 | 1 | 0 |
| 1399 | 1 | 0 |
| 1400 | 1 | 0 |
| 1401 | 1 | 0 |
| 1402 | 1 | 0 |
| 1403 | 1 | 0 |
| 1404 | 1 | 0 |
| 1405 | 1 | 0 |
| 1406 | 1 | 0 |
| 1407 | 1 | 0 |
| 1408 | 1 | 0 |
| 1409 | 1 | 0 |
| 1410 | 1 | 0 |
| 1411 | 1 | 0 |
| 1412 | 1 | 0 |
| 1413 | 1 | 0 |
| 1414 | 1 | 0 |
| 1415 | 1 | 0 |
| 1416 | 1 | 0 |
| 1417 | 1 | 0 |
| 1418 | 1 | 0 |
| 1419 | 1 | 0 |
| 1420 | 1 | 0 |
| 1421 | 1 | 0 |
| 1422 | 1 | 0 |
| 1423 | 1 | 0 |
| 1424 | 1 | 0 |
| 1425 | 1 | 0 |
| 1426 | 1 | 0 |
| 1427 | 1 | 0 |
| 1428 | 1 | 0 |
| 1429 | 1 | 0 |
| 1430 | 1 | 0 |
| 1431 | 1 | 0 |
| 1432 | 1 | 0 |
| 1433 | 1 | 0 |
| 1434 | 1 | 0 |
| 1435 | 1 | 0 |
| 1436 | 1 | 0 |
| 1437 | 1 | 0 |
| 1438 | 1 | 0 |
| 1439 | 1 | 0 |
| 1440 | 1 | 0 |
| 1441 | 1 | 0 |
| 1442 | 1 | 0 |
| 1443 | 1 | 0 |
| 1444 | 1 | 0 |
| 1445 | 1 | 0 |
| 1446 | 1 | 0 |
| 1447 | 1 | 0 |
| 1448 | 1 | 0 |
| 1449 | 1 | 0 |
| 1450 | 1 | 0 |
| 1451 | 1 | 0 |
| 1452 | 1 | 0 |
| 1453 | 1 | 0 |
| 1454 | 1 | 0 |
| 1455 | 1 | 0 |
| 1456 | 1 | 0 |
| 1457 | 1 | 0 |
| 1458 | 1 | 0 |
| 1459 | 1 | 0 |
| 1460 | 1 | 0 |
| 1461 | 1 | 0 |
| 1462 | 1 | 0 |
| 1463 | 1 | 0 |
| 1464 | 1 | 0 |
| 1465 | 1 | 0 |
| 1466 | 1 | 0 |
| 1467 | 1 | 0 |
| 1468 | 1 | 0 |
| 1469 | 1 | 0 |
| 1470 | 1 | 0 |
| 1471 | 1 | 0 |
| 1472 | 1 | 0 |
| 1473 | 1 | 0 |
| 1474 | 1 | 0 |
| 1475 | 1 | 0 |
| 1476 | 1 | 0 |
| 1477 | 1 | 0 |
| 1478 | 1 | 0 |
| 1479 | 1 | 0 |
| 1480 | 1 | 0 |
| 1481 | 1 | 0 |
| 1482 | 1 | 0 |
| 1483 | 1 | 0 |
| 1484 | 1 | 0 |
| 1485 | 1 | 0 |
| 1486 | 1 | 0 |
| 1487 | 1 | 0 |
| 1488 | 1 | 0 |
| 1489 | 1 | 0 |
| 1490 | 1 | 0 |
| 1491 | 1 | 0 |
| 1492 | 1 | 0 |
| 1493 | 1 | 0 |
| 1494 | 1 | 0 |
| 1495 | 1 | 0 |
| 1496 | 1 | 0 |
| 1497 | 1 | 0 |
| 1498 | 1 | 0 |
| 1499 | 1 | 0 |
| 1500 | 1 | 0 |
| 1501 | 1 | 0 |
| 1502 | 1 | 0 |
| 1503 | 1 | 0 |
| 1504 | 1 | 0 |
| 1505 | 1 | 0 |
| 1506 | 1 | 0 |
| 1507 | 1 | 0 |
| 1508 | 1 | 0 |
| 1509 | 1 | 0 |
| 1510 | 1 | 0 |
| 1511 | 1 | 0 |
| 1512 | 1 | 0 |
| 1513 | 1 | 0 |
| 1514 | 1 | 0 |
| 1515 | 1 | 0 |
| 1516 | 1 | 0 |
| 1517 | 1 | 0 |
| 1518 | 1 | 0 |
| 1519 | 1 | 0 |
| 1520 | 1 | 0 |
| 1521 | 1 | 0 |
| 1522 | 1 | 0 |
| 1523 | 1 | 0 |
| 1524 | 1 | 0 |
| 1525 | 1 | 0 |
| 1526 | 1 | 0 |
| 1527 | 1 | 0 |
| 1528 | 1 | 0 |
| 1529 | 1 | 0 |
| 1530 | 1 | 0 |
| 1531 | 1 | 0 |
| 1532 | 1 | 0 |
| 1533 | 1 | 0 |
| 1534 | 1 | 0 |
| 1535 | 1 | 0 |
| 1536 | 1 | 0 |
| 1537 | 1 | 0 |
| 1538 | 1 | 0 |
| 1539 | 1 | 0 |
| 1540 | 1 | 0 |
| 1541 | 1 | 0 |
| 1542 | 1 | 0 |
| 1543 | 1 | 0 |
| 1544 | 1 | 0 |
| 1545 | 1 | 0 |
| 1546 | 1 | 0 |
| 1547 | 1 | 0 |
| 1548 | 1 | 0 |
| 1549 | 1 | 0 |
| 1550 | 1 | 0 |
| 1551 | 1 | 0 |
| 1552 | 1 | 0 |
| 1553 | 1 | 0 |
| 1554 | 1 | 0 |
| 1555 | 1 | 0 |
| 1556 | 1 | 0 |
| 1557 | 1 | 0 |
| 1558 | 1 | 0 |
| 1559 | 1 | 0 |
| 1560 | 1 | 0 |
| 1561 | 1 | 0 |
| 1562 | 1 | 0 |
| 1563 | 1 | 0 |
| 1564 | 1 | 0 |
| 1565 | 1 | 0 |
| 1566 | 1 | 0 |
| 1567 | 1 | 0 |
| 1568 | 1 | 0 |
| 1569 | 1 | 0 |
| 1570 | 1 | 0 |
| 1571 | 1 | 0 |
| 1572 | 1 | 0 |
| 1573 | 1 | 0 |
| 1574 | 1 | 0 |
| 1575 | 1 | 0 |
| 1576 | 1 | 0 |
| 1577 | 1 | 0 |
| 1578 | 1 | 0 |
| 1579 | 1 | 0 |
| 1580 | 1 | 0 |
| 1581 | 1 | 0 |
| 1582 | 1 | 0 |
| 1583 | 1 | 0 |
| 1584 | 1 | 0 |
| 1585 | 1 | 0 |
| 1586 | 1 | 0 |
| 1587 | 1 | 0 |
| 1588 | 1 | 0 |
| 1589 | 1 | 0 |
| 1590 | 1 | 0 |
| 1591 | 1 | 0 |
| 1592 | 1 | 0 |
| 1593 | 1 | 0 |
| 1594 | 1 | 0 |
| 1595 | 1 | 0 |
| 1596 | 1 | 0 |
| 1597 | 1 | 0 |
| 1598 | 1 | 0 |
| 1599 | 1 | 0 |
| 1600 | 1 | 0 |
| 1601 | 1 | 0 |
| 1602 | 1 | 0 |
| 1603 | 1 | 0 |
| 1604 | 1 | 0 |
| 1605 | 1 | 0 |
| 1606 | 1 | 0 |
| 1607 | 1 | 0 |
| 1608 | 1 | 0 |
| 1609 | 1 | 0 |
| 1610 | 1 | 0 |
| 1611 | 1 | 0 |
| 1612 | 1 | 0 |
| 1613 | 1 | 0 |
| 1614 | 1 | 0 |
| 1615 | 1 | 0 |
| 1616 | 1 | 0 |
| 1617 | 1 | 0 |
| 1618 | 1 | 0 |
| 1619 | 1 | 0 |
| 1620 | 1 | 0 |
| 1621 | 1 | 0 |
| 1622 | 1 | 0 |
| 1623 | 1 | 0 |
| 1624 | 1 | 0 |
| 1625 | 1 | 0 |
| 1626 | 1 | 0 |
| 1627 | 1 | 0 |
| 1628 | 1 | 0 |
| 1629 | 1 | 0 |
| 1630 | 1 | 0 |
| 1631 | 1 | 0 |
| 1632 | 1 | 0 |
| 1633 | 1 | 0 |
| 1634 | 1 | 0 |
| 1635 | 1 | 0 |
| 1636 | 1 | 0 |
| 1637 | 1 | 0 |
| 1638 | 1 | 0 |
| 1639 | 1 | 0 |
| 1640 | 1 | 0 |
| 1641 | 1 | 0 |
| 1642 | 1 | 0 |
| 1643 | 1 | 0 |
| 1644 | 1 | 0 |
| 1645 | 1 | 0 |
| 1646 | 1 | 0 |
| 1647 | 1 | 0 |
| 1648 | 1 | 0 |
| 1649 | 1 | 0 |
| 1650 | 1 | 0 |
| 1651 | 1 | 0 |
| 1652 | 1 | 0 |
| 1653 | 1 | 0 |
| 1654 | 1 | 0 |
| 1655 | 1 | 0 |
| 1656 | 1 | 0 |
| 1657 | 1 | 0 |
| 1658 | 1 | 0 |
| 1659 | 1 | 0 |
| 1660 | 1 | 0 |
| 1661 | 1 | 0 |
| 1662 | 1 | 0 |
| 1663 | 1 | 0 |
| 1664 | 1 | 0 |
| 1665 | 1 | 0 |
| 1666 | 1 | 0 |
| 1667 | 1 | 0 |
| 1668 | 1 | 0 |
| 1669 | 1 | 0 |
| 1670 | 1 | 0 |
| 1671 | 1 | 0 |
| 1672 | 1 | 0 |
| 1673 | 1 | 0 |
| 1674 | 1 | 0 |
| 1675 | 1 | 0 |
| 1676 | 1 | 0 |
| 1677 | 1 | 0 |
| 1678 | 1 | 0 |
| 1679 | 1 | 0 |
| 1680 | 1 | 0 |
| 1681 | 1 | 0 |
| 1682 | 1 | 0 |
| 1683 | 1 | 0 |
| 1684 | 1 | 0 |
| 1685 | 1 | 0 |
| 1686 | 1 | 0 |
| 1687 | 1 | 0 |
| 1688 | 1 | 0 |
| 1689 | 1 | 0 |
| 1690 | 1 | 0 |
| 1691 | 1 | 0 |
| 1692 | 1 | 0 |
| 1693 | 1 | 0 |
| 1694 | 1 | 0 |
| 1695 | 1 | 0 |
| 1696 | 1 | 0 |
| 1697 | 1 | 0 |
| 1698 | 1 | 0 |
| 1699 | 1 | 0 |
| 1700 | 1 | 0 |
| 1701 | 1 | 0 |
| 1702 | 1 | 0 |
| 1703 | 1 | 0 |
| 1704 | 1 | 0 |
| 1705 | 1 | 0 |
| 1706 | 1 | 0 |
| 1707 | 1 | 0 |
| 1708 | 1 | 0 |
| 1709 | 1 | 0 |
| 1710 | 1 | 0 |
| 1711 | 1 | 0 |
| 1712 | 1 | 0 |
| 1713 | 1 | 0 |
| 1714 | 1 | 0 |
| 1715 | 1 | 0 |
| 1716 | 1 | 0 |
| 1717 | 1 | 0 |
| 1718 | 1 | 0 |
| 1719 | 1 | 0 |
| 1720 | 1 | 0 |
| 1721 | 1 | 0 |
| 1722 | 1 | 0 |
| 1723 | 1 | 0 |
| 1724 | 1 | 0 |
| 1725 | 1 | 0 |
| 1726 | 1 | 0 |
| 1727 | 1 | 0 |
| 1728 | 1 | 0 |
| 1729 | 1 | 0 |
| 1730 | 1 | 0 |
| 1731 | 1 | 0 |
| 1732 | 1 | 0 |
| 1733 | 1 | 0 |
| 1734 | 1 | 0 |
| 1735 | 1 | 0 |
| 1736 | 1 | 0 |
| 1737 | 1 | 0 |
| 1738 | 1 | 0 |
| 1739 | 1 | 0 |
| 1740 | 1 | 0 |
| 1741 | 1 | 0 |
| 1742 | 1 | 0 |
| 1743 | 1 | 0 |
| 1744 | 1 | 0 |
| 1745 | 1 | 0 |
| 1746 | 1 | 0 |
| 1747 | 1 | 0 |
| 1748 | 1 | 0 |
| 1749 | 1 | 0 |
| 1750 | 1 | 0 |
| 1751 | 1 | 0 |
| 1752 | 1 | 0 |
| 1753 | 1 | 0 |
| 1754 | 1 | 0 |
| 1755 | 1 | 0 |
| 1756 | 1 | 0 |
| 1757 | 1 | 0 |
| 1758 | 1 | 0 |
| 1759 | 1 | 0 |
| 1760 | 1 | 0 |
| 1761 | 1 | 0 |
| 1762 | 1 | 0 |
| 1763 | 1 | 0 |
| 1764 | 1 | 0 |
| 1765 | 1 | 0 |
| 1766 | 1 | 0 |
| 1767 | 1 | 0 |
| 1768 | 1 | 0 |
| 1769 | 1 | 0 |
| 1770 | 1 | 0 |
| 1771 | 1 | 0 |
| 1772 | 1 | 0 |
| 1773 | 1 | 0 |
| 1774 | 1 | 0 |
| 1775 | 1 | 0 |
| 1776 | 1 | 0 |
| 1777 | 1 | 0 |
| 1778 | 1 | 0 |
| 1779 | 1 | 0 |
| 1780 | 1 | 0 |
| 1781 | 1 | 0 |
| 1782 | 1 | 0 |
| 1783 | 1 | 0 |
| 1784 | 1 | 0 |
| 1785 | 1 | 0 |
| 1786 | 1 | 0 |
| 1787 | 1 | 0 |
| 1788 | 1 | 0 |
| 1789 | 1 | 0 |
| 1790 | 1 | 0 |
| 1791 | 1 | 0 |
| 1792 | 1 | 0 |
| 1793 | 1 | 0 |
| 1794 | 1 | 0 |
| 1795 | 1 | 0 |
| 1796 | 1 | 0 |
| 1797 | 1 | 0 |
| 1798 | 1 | 0 |
| 1799 | 1 | 0 |
| 1800 | 1 | 0 |
| 1801 | 1 | 0 |
| 1802 | 1 | 0 |
| 1803 | 1 | 0 |
| 1804 | 1 | 0 |
| 1805 | 1 | 0 |
| 1806 | 1 | 0 |
| 1807 | 1 | 0 |
| 1808 | 1 | 0 |
| 1809 | 1 | 0 |
| 1810 | 1 | 0 |
| 1811 | 1 | 0 |
| 1812 | 1 | 0 |
| 1813 | 1 | 0 |
| 1814 | 1 | 0 |
| 1815 | 1 | 0 |
| 1816 | 1 | 0 |
| 1817 | 1 | 0 |
| 1818 | 1 | 0 |
| 1819 | 1 | 0 |
| 1820 | 1 | 0 |
| 1821 | 1 | 0 |
| 1822 | 1 | 0 |
| 1823 | 1 | 0 |
| 1824 | 1 | 0 |
| 1825 | 1 | 0 |
| 1826 | 1 | 0 |
| 1827 | 1 | 0 |
| 1828 | 1 | 0 |
| 1829 | 1 | 0 |
| 1830 | 1 | 0 |
| 1831 | 1 | 0 |
| 1832 | 1 | 0 |
| 1833 | 1 | 0 |
| 1834 | 1 | 0 |
| 1835 | 1 | 0 |
| 1836 | 1 | 0 |
| 1837 | 1 | 0 |
| 1838 | 1 | 0 |
| 1839 | 1 | 0 |
| 1840 | 1 | 0 |
| 1841 | 1 | 0 |
| 1842 | 1 | 0 |
| 1843 | 1 | 0 |
| 1844 | 1 | 0 |
| 1845 | 1 | 0 |
| 1846 | 1 | 0 |
| 1847 | 1 | 0 |
| 1848 | 1 | 0 |
| 1849 | 1 | 0 |
| 1850 | 1 | 0 |
| 1851 | 1 | 0 |
| 1852 | 1 | 0 |
| 1853 | 1 | 0 |
| 1854 | 1 | 0 |
| 1855 | 1 | 0 |
| 1856 | 1 | 0 |
| 1857 | 1 | 0 |
| 1858 | 1 | 0 |
| 1859 | 1 | 0 |
| 1860 | 1 | 0 |
| 1861 | 1 | 0 |
| 1862 | 1 | 0 |
| 1863 | 1 | 0 |
| 1864 | 1 | 0 |
| 1865 | 1 | 0 |
| 1866 | 1 | 0 |
| 1867 | 1 | 0 |
| 1868 | 1 | 0 |
| 1869 | 1 | 0 |
| 1870 | 1 | 0 |
| 1871 | 1 | 0 |
| 1872 | 1 | 0 |
| 1873 | 1 | 0 |
| 1874 | 1 | 0 |
| 1875 | 1 | 0 |
| 1876 | 1 | 0 |
| 1877 | 1 | 0 |
| 1878 | 1 | 0 |
| 1879 | 1 | 0 |
| 1880 | 1 | 0 |
| 1881 | 1 | 0 |
| 1882 | 1 | 0 |
| 1883 | 1 | 0 |
| 1884 | 1 | 0 |
| 1885 | 1 | 0 |
| 1886 | 1 | 0 |
| 1887 | 1 | 0 |
| 1888 | 1 | 0 |
| 1889 | 1 | 0 |
| 1890 | 1 | 0 |
| 1891 | 1 | 0 |
| 1892 | 1 | 0 |
| 1893 | 1 | 0 |
| 1894 | 1 | 0 |
| 1895 | 1 | 0 |
| 1896 | 1 | 0 |
| 1897 | 1 | 0 |
| 1898 | 1 | 0 |
| 1899 | 1 | 0 |
| 1900 | 1 | 0 |
| 1901 | 1 | 0 |
| 1902 | 1 | 0 |
| 1903 | 1 | 0 |
| 1904 | 1 | 0 |
| 1905 | 1 | 0 |
| 1906 | 1 | 0 |
| 1907 | 1 | 0 |
| 1908 | 1 | 0 |
| 1909 | 1 | 0 |
| 1910 | 1 | 0 |
| 1911 | 1 | 0 |
| 1912 | 1 | 0 |
| 1913 | 1 | 0 |
| 1914 | 1 | 0 |
| 1915 | 1 | 0 |
| 1916 | 1 | 0 |
| 1917 | 1 | 0 |
| 1918 | 1 | 0 |
| 1919 | 1 | 0 |
| 1920 | 1 | 0 |
| 1921 | 1 | 0 |
| 1922 | 1 | 0 |
| 1923 | 1 | 0 |
| 1924 | 1 | 0 |
| 1925 | 1 | 0 |
| 1926 | 1 | 0 |
| 1927 | 1 | 0 |
| 1928 | 1 | 0 |
| 1929 | 1 | 0 |
| 1930 | 1 | 0 |
| 1931 | 1 | 0 |
| 1932 | 1 | 0 |
| 1933 | 1 | 0 |
| 1934 | 1 | 0 |
| 1935 | 1 | 0 |
| 1936 | 1 | 0 |
| 1937 | 1 | 0 |
| 1938 | 1 | 0 |
| 1939 | 1 | 0 |
| 1940 | 1 | 0 |
| 1941 | 1 | 0 |
| 1942 | 1 | 0 |
| 1943 | 1 | 0 |
| 1944 | 1 | 0 |
| 1945 | 1 | 0 |
| 1946 | 1 | 0 |
| 1947 | 1 | 0 |
| 1948 | 1 | 0 |
| 1949 | 1 | 0 |
| 1950 | 1 | 0 |
| 1951 | 1 | 0 |
| 1952 | 1 | 0 |
| 1953 | 1 | 0 |
| 1954 | 1 | 0 |
| 1955 | 1 | 0 |
| 1956 | 1 | 0 |
| 1957 | 1 | 0 |
| 1958 | 1 | 0 |
| 1959 | 1 | 0 |
| 1960 | 1 | 0 |
| 1961 | 1 | 0 |
| 1962 | 1 | 0 |
| 1963 | 1 | 0 |
| 1964 | 1 | 0 |
| 1965 | 1 | 0 |
| 1966 | 1 | 0 |
| 1967 | 1 | 0 |
| 1968 | 1 | 0 |
| 1969 | 1 | 0 |
| 1970 | 1 | 0 |
| 1971 | 1 | 0 |
| 1972 | 1 | 0 |
| 1973 | 1 | 0 |
| 1974 | 1 | 0 |
| 1975 | 1 | 0 |
| 1976 | 1 | 0 |
| 1977 | 1 | 0 |
| 1978 | 1 | 0 |
| 1979 | 1 | 0 |
| 1980 | 1 | 0 |
| 1981 | 1 | 0 |
| 1982 | 1 | 0 |
| 1983 | 1 | 0 |
| 1984 | 1 | 0 |
| 1985 | 1 | 0 |
| 1986 | 1 | 0 |
| 1987 | 1 | 0 |
| 1988 | 1 | 0 |
| 1989 | 1 | 0 |
| 1990 | 1 | 0 |
| 1991 | 1 | 0 |
| 1992 | 1 | 0 |
| 1993 | 1 | 0 |
| 1994 | 1 | 0 |
| 1995 | 1 | 0 |
| 1996 | 1 | 0 |
| 1997 | 1 | 0 |
| 1998 | 1 | 0 |
| 1999 | 1 | 0 |
| 2000 | 1 | 0 |
| 2001 | 1 | 0 |
| 2002 | 1 | 0 |
| 2003 | 1 | 0 |
| 2004 | 1 | 0 |
| 2005 | 1 | 0 |
| 2006 | 1 | 0 |
| 2007 | 1 | 0 |
| 2008 | 1 | 0 |
| 2009 | 1 | 0 |
| 2010 | 1 | 0 |
| 2011 | 1 | 0 |
| 2012 | 1 | 0 |
| 2013 | 1 | 0 |
| 2014 | 1 | 0 |
| 2015 | 1 | 0 |
| 2016 | 1 | 0 |
| 2017 | 1 | 0 |
| 2018 | 1 | 0 |
| 2019 | 1 | 0 |
| 2020 | 1 | 0 |
| 2021 | 1 | 0 |
| 2022 | 1 | 0 |
| 2023 | 1 | 0 |
| 2024 | 1 | 0 |
| 2025 | 1 | 0 |
| 2026 | 1 | 0 |
| 2027 | 1 | 0 |
| 2028 | 1 | 0 |
| 2029 | 1 | 0 |
| 2030 | 1 | 0 |
| 2031 | 1 | 0 |
| 2032 | 1 | 0 |
| 2033 | 1 | 0 |
| 2034 | 1 | 0 |
| 2035 | 1 | 0 |
| 2036 | 1 | 0 |
| 2037 | 1 | 0 |
| 2038 | 1 | 0 |
| 2039 | 1 | 0 |
| 2040 | 1 | 0 |
| 2041 | 1 | 0 |
| 2042 | 1 | 0 |
| 2043 | 1 | 0 |
| 2044 | 1 | 0 |
| 2045 | 1 | 0 |
| 2046 | 1 | 0 |
| 2047 | 1 | 0 |
| 2048 | 1 | 0 |
| 2049 | 1 | 0 |
| 2050 | 1 | 0 |
| 2051 | 1 | 0 |
| 2052 | 1 | 0 |
| 2053 | 1 | 0 |
| 2054 | 1 | 0 |
| 2055 | 1 | 0 |
| 2056 | 1 | 0 |
| 2057 | 1 | 0 |
| 2058 | 1 | 0 |
| 2059 | 1 | 0 |
| 2060 | 1 | 0 |
| 2061 | 1 | 0 |
| 2062 | 1 | 0 |
| 2063 | 1 | 0 |
| 2064 | 1 | 0 |
| 2065 | 1 | 0 |
| 2066 | 1 | 0 |
| 2067 | 1 | 0 |
| 2068 | 1 | 0 |
| 2069 | 1 | 0 |
| 2070 | 1 | 0 |
| 2071 | 1 | 0 |
| 2072 | 1 | 0 |
| 2073 | 1 | 0 |
| 2074 | 1 | 0 |
| 2075 | 1 | 0 |
| 2076 | 1 | 0 |
| 2077 | 1 | 0 |
| 2078 | 1 | 0 |
| 2079 | 1 | 0 |
| 2080 | 1 | 0 |
| 2081 | 1 | 0 |
| 2082 | 1 | 0 |
| 2083 | 1 | 0 |
| 2084 | 1 | 0 |
| 2085 | 1 | 0 |
| 2086 | 1 | 0 |
| 2087 | 1 | 0 |
| 2088 | 1 | 0 |
| 2089 | 1 | 0 |
| 2090 | 1 | 0 |
| 2091 | 1 | 0 |
| 2092 | 1 | 0 |
| 2093 | 1 | 0 |
| 2094 | 1 | 0 |
| 2095 | 1 | 0 |
| 2096 | 1 | 0 |
| 2097 | 1 | 0 |
| 2098 | 1 | 0 |
| 2099 | 1 | 0 |
| 2100 | 1 | 0 |
| 2101 | 1 | 0 |
| 2102 | 1 | 0 |
| 2103 | 1 | 0 |
| 2104 | 1 | 0 |
| 2105 | 1 | 0 |
| 2106 | 1 | 0 |
| 2107 | 1 | 0 |
| 2108 | 1 | 0 |
| 2109 | 1 | 0 |
| 2110 | 1 | 0 |
| 2111 | 1 | 0 |
| 2112 | 1 | 0 |
| 2113 | 1 | 0 |
| 2114 | 1 | 0 |
| 2115 | 1 | 0 |
| 2116 | 1 | 0 |
| 2117 | 1 | 0 |
| 2118 | 1 | 0 |
| 2119 | 1 | 0 |
| 2120 | 1 | 0 |
| 2121 | 1 | 0 |
| 2122 | 1 | 0 |
| 2123 | 1 | 0 |
| 2124 | 1 | 0 |
| 2125 | 1 | 0 |
| 2126 | 1 | 0 |
| 2127 | 1 | 0 |
| 2128 | 1 | 0 |
| 2129 | 1 | 0 |
| 2130 | 1 | 0 |
| 2131 | 1 | 0 |
| 2132 | 1 | 0 |
| 2133 | 1 | 0 |
| 2134 | 1 | 0 |
| 2135 | 1 | 0 |
| 2136 | 1 | 0 |
| 2137 | 1 | 0 |
| 2138 | 1 | 0 |
| 2139 | 1 | 0 |
| 2140 | 1 | 0 |
| 2141 | 1 | 0 |
| 2142 | 1 | 0 |
| 2143 | 1 | 0 |
| 2144 | 1 | 0 |
| 2145 | 1 | 0 |
| 2146 | 1 | 0 |
| 2147 | 1 | 0 |
| 2148 | 1 | 0 |
| 2149 | 1 | 0 |
| 2150 | 1 | 0 |
| 2151 | 1 | 0 |
| 2152 | 1 | 0 |
| 2153 | 1 | 0 |
| 2154 | 1 | 0 |
| 2155 | 1 | 0 |
| 2156 | 1 | 0 |
| 2157 | 1 | 0 |
| 2158 | 1 | 0 |
| 2159 | 1 | 0 |
| 2160 | 1 | 0 |
| 2161 | 1 | 0 |
| 2162 | 1 | 0 |
| 2163 | 1 | 0 |
| 2164 | 1 | 0 |
| 2165 | 1 | 0 |
| 2166 | 1 | 0 |
| 2167 | 1 | 0 |
| 2168 | 1 | 0 |
| 2169 | 1 | 0 |
| 2170 | 1 | 0 |
| 2171 | 1 | 0 |
| 2172 | 1 | 0 |
| 2173 | 1 | 0 |
| 2174 | 1 | 0 |
| 2175 | 1 | 0 |
| 2176 | 1 | 0 |
| 2177 | 1 | 0 |
| 2178 | 1 | 0 |
| 2179 | 1 | 0 |
| 2180 | 1 | 0 |
| 2181 | 1 | 0 |
| 2182 | 1 | 0 |
| 2183 | 1 | 0 |
| 2184 | 1 | 0 |
| 2185 | 1 | 0 |
| 2186 | 1 | 0 |
| 2187 | 1 | 0 |
| 2188 | 1 | 0 |
| 2189 | 1 | 0 |
| 2190 | 1 | 0 |
| 2191 | 1 | 0 |
| 2192 | 1 | 0 |
| 2193 | 1 | 0 |
| 2194 | 1 | 0 |
| 2195 | 1 | 0 |
| 2196 | 1 | 0 |
| 2197 | 1 | 0 |
| 2198 | 1 | 0 |
| 2199 | 1 | 0 |
| 2200 | 1 | 0 |
| 2201 | 1 | 0 |
| 2202 | 1 | 0 |
| 2203 | 1 | 0 |
| 2204 | 1 | 0 |
| 2205 | 1 | 0 |
| 2206 | 1 | 0 |
| 2207 | 1 | 0 |
| 2208 | 1 | 0 |
| 2209 | 1 | 0 |
| 2210 | 1 | 0 |
| 2211 | 1 | 0 |
| 2212 | 1 | 0 |
| 2213 | 1 | 0 |
| 2214 | 1 | 0 |
| 2215 | 1 | 0 |
| 2216 | 1 | 0 |
| 2217 | 1 | 0 |
| 2218 | 1 | 0 |
| 2219 | 1 | 0 |
| 2220 | 1 | 0 |
| 2221 | 1 | 0 |
| 2222 | 1 | 0 |
| 2223 | 1 | 0 |
| 2224 | 1 | 0 |
| 2225 | 1 | 0 |
| 2226 | 1 | 0 |
| 2227 | 1 | 0 |
| 2228 | 1 | 0 |
| 2229 | 1 | 0 |
| 2230 | 1 | 0 |
| 2231 | 1 | 0 |
| 2232 | 1 | 0 |
| 2233 | 1 | 0 |
| 2234 | 1 | 0 |
| 2235 | 1 | 0 |
| 2236 | 1 | 0 |
| 2237 | 1 | 0 |
| 2238 | 1 | 0 |
| 2239 | 1 | 0 |
| 2240 | 1 | 0 |
| 2241 | 1 | 0 |
| 2242 | 1 | 0 |
| 2243 | 1 | 0 |
| 2244 | 1 | 0 |
| 2245 | 1 | 0 |
| 2246 | 1 | 0 |
| 2247 | 1 | 0 |
| 2248 | 1 | 0 |
| 2249 | 1 | 0 |
| 2250 | 1 | 0 |
| 2251 | 1 | 0 |
| 2252 | 1 | 0 |
| 2253 | 1 | 0 |
| 2254 | 1 | 0 |
| 2255 | 1 | 0 |
| 2256 | 1 | 0 |
| 2257 | 1 | 0 |
| 2258 | 1 | 0 |
| 2259 | 1 | 0 |
| 2260 | 1 | 0 |
| 2261 | 1 | 0 |
| 2262 | 1 | 0 |
| 2263 | 1 | 0 |
| 2264 | 1 | 0 |
| 2265 | 1 | 0 |
| 2266 | 1 | 0 |
| 2267 | 1 | 0 |
| 2268 | 1 | 0 |
| 2269 | 1 | 0 |
| 2270 | 1 | 0 |
| 2271 | 1 | 0 |
| 2272 | 1 | 0 |
| 2273 | 1 | 0 |
| 2274 | 1 | 0 |
| 2275 | 1 | 0 |
| 2276 | 1 | 0 |
| 2277 | 1 | 0 |
| 2278 | 1 | 0 |
| 2279 | 1 | 0 |
| 2280 | 1 | 0 |
| 2281 | 1 | 0 |
| 2282 | 1 | 0 |
| 2283 | 1 | 0 |
| 2284 | 1 | 0 |
| 2285 | 1 | 0 |
| 2286 | 1 | 0 |
| 2287 | 1 | 0 |
| 2288 | 1 | 0 |
| 2289 | 1 | 0 |
| 2290 | 1 | 0 |
| 2291 | 1 | 0 |
| 2292 | 1 | 0 |
| 2293 | 1 | 0 |
| 2294 | 1 | 0 |
| 2295 | 1 | 0 |
| 2296 | 1 | 0 |
| 2297 | 1 | 0 |
| 2298 | 1 | 0 |
| 2299 | 1 | 0 |
| 2300 | 1 | 0 |
| 2301 | 1 | 0 |
| 2302 | 1 | 0 |
| 2303 | 1 | 0 |
| 2304 | 1 | 0 |
| 2305 | 1 | 0 |
| 2306 | 1 | 0 |
| 2307 | 1 | 0 |
| 2308 | 1 | 0 |
| 2309 | 1 | 0 |
| 2310 | 1 | 0 |
| 2311 | 1 | 0 |
| 2312 | 1 | 0 |
| 2313 | 1 | 0 |
| 2314 | 1 | 0 |
| 2315 | 1 | 0 |
| 2316 | 1 | 0 |
| 2317 | 1 | 0 |
| 2318 | 1 | 0 |
| 2319 | 1 | 0 |
| 2320 | 1 | 0 |
| 2321 | 1 | 0 |
| 2322 | 1 | 0 |
| 2323 | 1 | 0 |
| 2324 | 1 | 0 |
| 2325 | 1 | 0 |
| 2326 | 1 | 0 |
| 2327 | 1 | 0 |
| 2328 | 1 | 0 |
| 2329 | 1 | 0 |
| 2330 | 1 | 0 |
| 2331 | 1 | 0 |
| 2332 | 1 | 0 |
| 2333 | 1 | 0 |
| 2334 | 1 | 0 |
| 2335 | 1 | 0 |
| 2336 | 1 | 0 |
| 2337 | 1 | 0 |
| 2338 | 1 | 0 |
| 2339 | 1 | 0 |
| 2340 | 1 | 0 |
| 2341 | 1 | 0 |
| 2342 | 1 | 0 |
| 2343 | 1 | 0 |
| 2344 | 1 | 0 |
| 2345 | 1 | 0 |
| 2346 | 1 | 0 |
| 2347 | 1 | 0 |
| 2348 | 1 | 0 |
| 2349 | 1 | 0 |
| 2350 | 1 | 0 |
| 2351 | 1 | 0 |
| 2352 | 1 | 0 |
| 2353 | 1 | 0 |
| 2354 | 1 | 0 |
| 2355 | 1 | 0 |
| 2356 | 1 | 0 |
| 2357 | 1 | 0 |
| 2358 | 1 | 0 |
| 2359 | 1 | 0 |
| 2360 | 1 | 0 |
| 2361 | 1 | 0 |
| 2362 | 1 | 0 |
| 2363 | 1 | 0 |
| 2364 | 1 | 0 |
| 2365 | 1 | 0 |
| 2366 | 1 | 0 |
| 2367 | 1 | 0 |
| 2368 | 1 | 0 |
| 2369 | 1 | 0 |
| 2370 | 1 | 0 |
| 2371 | 1 | 0 |
| 2372 | 1 | 0 |
| 2373 | 1 | 0 |
| 2374 | 1 | 0 |
| 2375 | 1 | 0 |
| 2376 | 1 | 0 |
| 2377 | 1 | 0 |
| 2378 | 1 | 0 |
| 2379 | 1 | 0 |
| 2380 | 1 | 0 |
| 2381 | 1 | 0 |
| 2382 | 1 | 0 |
| 2383 | 1 | 0 |
| 2384 | 1 | 0 |
| 2385 | 1 | 0 |
| 2386 | 1 | 0 |
| 2387 | 1 | 0 |
| 2388 | 1 | 0 |
| 2389 | 1 | 0 |
| 2390 | 1 | 0 |
| 2391 | 1 | 0 |
| 2392 | 1 | 0 |
| 2393 | 1 | 0 |
| 2394 | 1 | 0 |
| 2395 | 1 | 0 |
| 2396 | 1 | 0 |
| 2397 | 1 | 0 |
| 2398 | 1 | 0 |
| 2399 | 1 | 0 |
| 2400 | 1 | 0 |
| 2401 | 1 | 0 |
| 2402 | 1 | 0 |
| 2403 | 1 | 0 |
| 2404 | 1 | 0 |
| 2405 | 1 | 0 |
| 2406 | 1 | 0 |
| 2407 | 1 | 0 |
| 2408 | 1 | 0 |
| 2409 | 1 | 0 |
| 2410 | 1 | 0 |
| 2411 | 1 | 0 |
| 2412 | 1 | 0 |
| 2413 | 1 | 0 |
| 2414 | 1 | 0 |
| 2415 | 1 | 0 |
| 2416 | 1 | 0 |
| 2417 | 1 | 0 |
| 2418 | 1 | 0 |
| 2419 | 1 | 0 |
| 2420 | 1 | 0 |
| 2421 | 1 | 0 |
| 2422 | 1 | 0 |
| 2423 | 1 | 0 |
| 2424 | 1 | 0 |
| 2425 | 1 | 0 |
| 2426 | 1 | 0 |
| 2427 | 1 | 0 |
| 2428 | 1 | 0 |
| 2429 | 1 | 0 |
| 2430 | 1 | 0 |
| 2431 | 1 | 0 |
| 2432 | 1 | 0 |
| 2433 | 1 | 0 |
| 2434 | 1 | 0 |
| 2435 | 1 | 0 |
| 2436 | 1 | 0 |
| 2437 | 1 | 0 |
| 2438 | 1 | 0 |
| 2439 | 1 | 0 |
| 2440 | 1 | 0 |
| 2441 | 1 | 0 |
| 2442 | 1 | 0 |
| 2443 | 1 | 0 |
| 2444 | 1 | 0 |
| 2445 | 1 | 0 |
| 2446 | 1 | 0 |
| 2447 | 1 | 0 |
| 2448 | 1 | 0 |
| 2449 | 1 | 0 |
| 2450 | 1 | 0 |
| 2451 | 1 | 0 |
| 2452 | 1 | 0 |
| 2453 | 1 | 0 |
| 2454 | 1 | 0 |
| 2455 | 1 | 0 |
| 2456 | 1 | 0 |
| 2457 | 1 | 0 |
| 2458 | 1 | 0 |
| 2459 | 1 | 0 |
| 2460 | 1 | 0 |
| 2461 | 1 | 0 |
| 2462 | 1 | 0 |
| 2463 | 1 | 0 |
| 2464 | 1 | 0 |
| 2465 | 1 | 0 |
| 2466 | 1 | 0 |
| 2467 | 1 | 0 |
| 2468 | 1 | 0 |
| 2469 | 1 | 0 |
| 2470 | 1 | 0 |
| 2471 | 1 | 0 |
| 2472 | 1 | 0 |
| 2473 | 1 | 0 |
| 2474 | 1 | 0 |
| 2475 | 1 | 0 |
| 2476 | 1 | 0 |
| 2477 | 1 | 0 |
| 2478 | 1 | 0 |
| 2479 | 1 | 0 |
| 2480 | 1 | 0 |
| 2481 | 1 | 0 |
| 2482 | 1 | 0 |
| 2483 | 1 | 0 |
| 2484 | 1 | 0 |
| 2485 | 1 | 0 |
| 2486 | 1 | 0 |
| 2487 | 1 | 0 |
| 2488 | 1 | 0 |
| 2489 | 1 | 0 |
| 2490 | 1 | 0 |
| 2491 | 1 | 0 |
| 2492 | 1 | 0 |
| 2493 | 1 | 0 |
| 2494 | 1 | 0 |
| 2495 | 1 | 0 |
| 2496 | 1 | 0 |
| 2497 | 1 | 0 |
| 2498 | 1 | 0 |
| 2499 | 1 | 0 |
| 2500 | 1 | 0 |
| 2501 | 1 | 0 |
| 2502 | 1 | 0 |
| 2503 | 1 | 0 |
| 2504 | 1 | 0 |
| 2505 | 1 | 0 |
| 2506 | 1 | 0 |
| 2507 | 1 | 0 |
| 2508 | 1 | 0 |
| 2509 | 1 | 0 |
| 2510 | 1 | 0 |
| 2511 | 1 | 0 |
| 2512 | 1 | 0 |
| 2513 | 1 | 0 |
| 2514 | 1 | 0 |
| 2515 | 1 | 0 |
| 2516 | 1 | 0 |
| 2517 | 1 | 0 |
| 2518 | 1 | 0 |
| 2519 | 1 | 0 |
| 2520 | 1 | 0 |
| 2521 | 1 | 0 |
| 2522 | 1 | 0 |
| 2523 | 1 | 0 |
| 2524 | 1 | 0 |
| 2525 | 1 | 0 |
| 2526 | 1 | 0 |
| 2527 | 1 | 0 |
| 2528 | 1 | 0 |
| 2529 | 1 | 0 |
| 2530 | 1 | 0 |
| 2531 | 1 | 0 |
| 2532 | 1 | 0 |
| 2533 | 1 | 0 |
| 2534 | 1 | 0 |
| 2535 | 1 | 0 |
| 2536 | 1 | 0 |
| 2537 | 1 | 0 |
| 2538 | 1 | 0 |
| 2539 | 1 | 0 |
| 2540 | 1 | 0 |
| 2541 | 1 | 0 |
| 2542 | 1 | 0 |
| 2543 | 1 | 0 |
| 2544 | 1 | 0 |
| 2545 | 1 | 0 |
| 2546 | 1 | 0 |
| 2547 | 1 | 0 |
| 2548 | 1 | 0 |
| 2549 | 1 | 0 |
| 2550 | 1 | 0 |
| 2551 | 1 | 0 |
| 2552 | 1 | 0 |
| 2553 | 1 | 0 |
| 2554 | 1 | 0 |
| 2555 | 1 | 0 |
| 2556 | 1 | 0 |
| 2557 | 1 | 0 |
| 2558 | 1 | 0 |
| 2559 | 1 | 0 |
| 2560 | 1 | 0 |
| 2561 | 1 | 0 |
| 2562 | 1 | 0 |
| 2563 | 1 | 0 |
| 2564 | 1 | 0 |
| 2565 | 1 | 0 |
| 2566 | 1 | 0 |
| 2567 | 1 | 0 |
| 2568 | 1 | 0 |
| 2569 | 1 | 0 |
| 2570 | 1 | 0 |
| 2571 | 1 | 0 |
| 2572 | 1 | 0 |
| 2573 | 1 | 0 |
| 2574 | 1 | 0 |
| 2575 | 1 | 0 |
| 2576 | 1 | 0 |
| 2577 | 1 | 0 |
| 2578 | 1 | 0 |
| 2579 | 1 | 0 |
| 2580 | 1 | 0 |
| 2581 | 1 | 0 |
| 2582 | 1 | 0 |
| 2583 | 1 | 0 |
| 2584 | 1 | 0 |
| 2585 | 1 | 0 |
| 2586 | 1 | 0 |
| 2587 | 1 | 0 |
| 2588 | 1 | 0 |
| 2589 | 1 | 0 |
| 2590 | 1 | 0 |
| 2591 | 1 | 0 |
| 2592 | 1 | 0 |
| 2593 | 1 | 0 |
| 2594 | 1 | 0 |
| 2595 | 1 | 0 |
| 2596 | 1 | 0 |
| 2597 | 1 | 0 |
| 2598 | 1 | 0 |
| 2599 | 1 | 0 |
| 2600 | 1 | 0 |
| 2601 | 1 | 0 |
| 2602 | 1 | 0 |
| 2603 | 1 | 0 |
| 2604 | 1 | 0 |
| 2605 | 1 | 0 |
| 2606 | 1 | 0 |
| 2607 | 1 | 0 |
| 2608 | 1 | 0 |
| 2609 | 1 | 0 |
| 2610 | 1 | 0 |
| 2611 | 1 | 0 |
| 2612 | 1 | 0 |
| 2613 | 1 | 0 |
| 2614 | 1 | 0 |
| 2615 | 1 | 0 |
| 2616 | 1 | 0 |
| 2617 | 1 | 0 |
| 2618 | 1 | 0 |
| 2619 | 1 | 0 |
| 2620 | 1 | 0 |
| 2621 | 1 | 0 |
| 2622 | 1 | 0 |
| 2623 | 1 | 0 |
| 2624 | 1 | 0 |
| 2625 | 1 | 0 |
| 2626 | 1 | 0 |
| 2627 | 1 | 0 |
| 2628 | 1 | 0 |
| 2629 | 1 | 0 |
| 2630 | 1 | 0 |
| 2631 | 1 | 0 |
| 2632 | 1 | 0 |
| 2633 | 1 | 0 |
| 2634 | 1 | 0 |
| 2635 | 1 | 0 |
| 2636 | 1 | 0 |
| 2637 | 1 | 0 |
| 2638 | 1 | 0 |
| 2639 | 1 | 0 |
| 2640 | 1 | 0 |
| 2641 | 1 | 0 |
| 2642 | 1 | 0 |
| 2643 | 1 | 0 |
| 2644 | 1 | 0 |
| 2645 | 1 | 0 |
| 2646 | 1 | 0 |
| 2647 | 1 | 0 |
| 2648 | 1 | 0 |
| 2649 | 1 | 0 |
| 2650 | 1 | 0 |
| 2651 | 1 | 0 |
| 2652 | 1 | 0 |
| 2653 | 1 | 0 |
| 2654 | 1 | 0 |
| 2655 | 1 | 0 |
| 2656 | 1 | 0 |
| 2657 | 1 | 0 |
| 2658 | 1 | 0 |
| 2659 | 1 | 0 |
| 2660 | 1 | 0 |
| 2661 | 1 | 0 |
| 2662 | 1 | 0 |
| 2663 | 1 | 0 |
| 2664 | 1 | 0 |
| 2665 | 1 | 0 |
| 2666 | 1 | 0 |
| 2667 | 1 | 0 |
| 2668 | 1 | 0 |
| 2669 | 1 | 0 |
| 2670 | 1 | 0 |
| 2671 | 1 | 0 |
| 2672 | 1 | 0 |
| 2673 | 1 | 0 |
| 2674 | 1 | 0 |
| 2675 | 1 | 0 |
| 2676 | 1 | 0 |
| 2677 | 1 | 0 |
| 2678 | 1 | 0 |
| 2679 | 1 | 0 |
| 2680 | 1 | 0 |
| 2681 | 1 | 0 |
| 2682 | 1 | 0 |
| 2683 | 1 | 0 |
| 2684 | 1 | 0 |
| 2685 | 1 | 0 |
| 2686 | 1 | 0 |
| 2687 | 1 | 0 |
| 2688 | 1 | 0 |
| 2689 | 1 | 0 |
| 2690 | 1 | 0 |
| 2691 | 1 | 0 |
| 2692 | 1 | 0 |
| 2693 | 1 | 0 |
| 2694 | 1 | 0 |
| 2695 | 1 | 0 |
| 2696 | 1 | 0 |
| 2697 | 1 | 0 |
| 2698 | 1 | 0 |
| 2699 | 1 | 0 |
| 2700 | 1 | 0 |
| 2701 | 1 | 0 |
| 2702 | 1 | 0 |
| 2703 | 1 | 0 |
| 2704 | 1 | 0 |
| 2705 | 1 | 0 |
| 2706 | 1 | 0 |
| 2707 | 1 | 0 |
| 2708 | 1 | 0 |
| 2709 | 1 | 0 |
| 2710 | 1 | 0 |
| 2711 | 1 | 0 |
| 2712 | 1 | 0 |
| 2713 | 1 | 0 |
| 2714 | 1 | 0 |
| 2715 | 1 | 0 |
| 2716 | 1 | 0 |
| 2717 | 1 | 0 |
| 2718 | 1 | 0 |
| 2719 | 1 | 0 |
| 2720 | 1 | 0 |
| 2721 | 1 | 0 |
| 2722 | 1 | 0 |
| 2723 | 1 | 0 |
| 2724 | 1 | 0 |
| 2725 | 1 | 0 |
| 2726 | 1 | 0 |
| 2727 | 1 | 0 |
| 2728 | 1 | 0 |
| 2729 | 1 | 0 |
| 2730 | 1 | 0 |
| 2731 | 1 | 0 |
| 2732 | 1 | 0 |
| 2733 | 1 | 0 |
| 2734 | 1 | 0 |
| 2735 | 1 | 0 |
| 2736 | 1 | 0 |
| 2737 | 1 | 0 |
| 2738 | 1 | 0 |
| 2739 | 1 | 0 |
| 2740 | 1 | 0 |
| 2741 | 1 | 0 |
| 2742 | 1 | 0 |
| 2743 | 1 | 0 |
| 2744 | 1 | 0 |
| 2745 | 1 | 0 |
| 2746 | 1 | 0 |
| 2747 | 1 | 0 |
| 2748 | 1 | 0 |
| 2749 | 1 | 0 |
| 2750 | 1 | 0 |
| 2751 | 1 | 0 |
| 2752 | 1 | 0 |
| 2753 | 1 | 0 |
| 2754 | 1 | 0 |
| 2755 | 1 | 0 |
| 2756 | 1 | 0 |
| 2757 | 1 | 0 |
| 2758 | 1 | 0 |
| 2759 | 1 | 0 |
| 2760 | 1 | 0 |
| 2761 | 1 | 0 |
| 2762 | 1 | 0 |
| 2763 | 1 | 0 |
| 2764 | 1 | 0 |
| 2765 | 1 | 0 |
| 2766 | 1 | 0 |
| 2767 | 1 | 0 |
| 2768 | 1 | 0 |
| 2769 | 1 | 0 |
| 2770 | 1 | 0 |
| 2771 | 1 | 0 |
| 2772 | 1 | 0 |
| 2773 | 1 | 0 |
| 2774 | 1 | 0 |
| 2775 | 1 | 0 |
| 2776 | 1 | 0 |
| 2777 | 1 | 0 |
| 2778 | 1 | 0 |
| 2779 | 1 | 0 |
| 2780 | 1 | 0 |
| 2781 | 1 | 0 |
| 2782 | 1 | 0 |
| 2783 | 1 | 0 |
| 2784 | 1 | 0 |
| 2785 | 1 | 0 |
| 2786 | 1 | 0 |
| 2787 | 1 | 0 |
| 2788 | 1 | 0 |
| 2789 | 1 | 0 |
| 2790 | 1 | 0 |
| 2791 | 1 | 0 |
| 2792 | 1 | 0 |
| 2793 | 1 | 0 |
| 2794 | 1 | 0 |
| 2795 | 1 | 0 |
| 2796 | 1 | 0 |
| 2797 | 1 | 0 |
| 2798 | 1 | 0 |
| 2799 | 1 | 0 |
| 2800 | 1 | 0 |
| 2801 | 1 | 0 |
| 2802 | 1 | 0 |
| 2803 | 1 | 0 |
| 2804 | 1 | 0 |
| 2805 | 1 | 0 |
| 2806 | 1 | 0 |
| 2807 | 1 | 0 |
| 2808 | 1 | 0 |
| 2809 | 1 | 0 |
| 2810 | 1 | 0 |
| 2811 | 1 | 0 |
| 2812 | 1 | 0 |
| 2813 | 1 | 0 |
| 2814 | 1 | 0 |
| 2815 | 1 | 0 |
| 2816 | 1 | 0 |
| 2817 | 1 | 0 |
| 2818 | 1 | 0 |
| 2819 | 1 | 0 |
| 2820 | 1 | 0 |
| 2821 | 1 | 0 |
| 2822 | 1 | 0 |
| 2823 | 1 | 0 |
| 2824 | 1 | 0 |
| 2825 | 1 | 0 |
| 2826 | 1 | 0 |
| 2827 | 1 | 0 |
| 2828 | 1 | 0 |
| 2829 | 1 | 0 |
| 2830 | 1 | 0 |
| 2831 | 1 | 0 |
| 2832 | 1 | 0 |
| 2833 | 1 | 0 |
| 2834 | 1 | 0 |
| 2835 | 1 | 0 |
| 2836 | 1 | 0 |
| 2837 | 1 | 0 |
| 2838 | 1 | 0 |
| 2839 | 1 | 0 |
| 2840 | 1 | 0 |
| 2841 | 1 | 0 |
| 2842 | 1 | 0 |
| 2843 | 1 | 0 |
| 2844 | 1 | 0 |
| 2845 | 1 | 0 |
| 2846 | 1 | 0 |
| 2847 | 1 | 0 |
| 2848 | 1 | 0 |
| 2849 | 1 | 0 |
| 2850 | 1 | 0 |
| 2851 | 1 | 0 |
| 2852 | 1 | 0 |
| 2853 | 1 | 0 |
| 2854 | 1 | 0 |
| 2855 | 1 | 0 |
| 2856 | 1 | 0 |
| 2857 | 1 | 0 |
| 2858 | 1 | 0 |
| 2859 | 1 | 0 |
| 2860 | 1 | 0 |
| 2861 | 1 | 0 |
| 2862 | 1 | 0 |
| 2863 | 1 | 0 |
| 2864 | 1 | 0 |
| 2865 | 1 | 0 |
| 2866 | 1 | 0 |
| 2867 | 1 | 0 |
| 2868 | 1 | 0 |
| 2869 | 1 | 0 |
| 2870 | 1 | 0 |
| 2871 | 1 | 0 |
| 2872 | 1 | 0 |
| 2873 | 1 | 0 |
| 2874 | 1 | 0 |
| 2875 | 1 | 0 |
| 2876 | 1 | 0 |
| 2877 | 1 | 0 |
| 2878 | 1 | 0 |
| 2879 | 1 | 0 |
| 2880 | 1 | 0 |
| 2881 | 1 | 0 |
| 2882 | 1 | 0 |
| 2883 | 1 | 0 |
| 2884 | 1 | 0 |
| 2885 | 1 | 0 |
| 2886 | 1 | 0 |
| 2887 | 1 | 0 |
| 2888 | 1 | 0 |
| 2889 | 1 | 0 |
| 2890 | 1 | 0 |
| 2891 | 1 | 0 |
| 2892 | 1 | 0 |
| 2893 | 1 | 0 |
| 2894 | 1 | 0 |
| 2895 | 1 | 0 |
| 2896 | 1 | 0 |
| 2897 | 1 | 0 |
| 2898 | 1 | 0 |
| 2899 | 1 | 0 |
| 2900 | 1 | 0 |
| 2901 | 1 | 0 |
| 2902 | 1 | 0 |
| 2903 | 1 | 0 |
| 2904 | 1 | 0 |
| 2905 | 1 | 0 |
| 2906 | 1 | 0 |
| 2907 | 1 | 0 |
| 2908 | 1 | 0 |
| 2909 | 1 | 0 |
| 2910 | 1 | 0 |
| 2911 | 1 | 0 |
| 2912 | 1 | 0 |
| 2913 | 1 | 0 |
| 2914 | 1 | 0 |
| 2915 | 1 | 0 |
| 2916 | 1 | 0 |
| 2917 | 1 | 0 |
| 2918 | 1 | 0 |
| 2919 | 1 | 0 |
| 2920 | 1 | 0 |
| 2921 | 1 | 0 |
| 2922 | 1 | 0 |
| 2923 | 1 | 0 |
| 2924 | 1 | 0 |
| 2925 | 1 | 0 |
| 2926 | 1 | 0 |
| 2927 | 1 | 0 |
| 2928 | 1 | 0 |
| 2929 | 1 | 0 |
| 2930 | 1 | 0 |
| 2931 | 1 | 0 |
| 2932 | 1 | 0 |
| 2933 | 1 | 0 |
| 2934 | 1 | 0 |
| 2935 | 1 | 0 |
| 2936 | 1 | 0 |
| 2937 | 1 | 0 |
| 2938 | 1 | 0 |
| 2939 | 1 | 0 |
| 2940 | 1 | 0 |
| 2941 | 1 | 0 |
| 2942 | 1 | 0 |
| 2943 | 1 | 0 |
| 2944 | 1 | 0 |
| 2945 | 1 | 0 |
| 2946 | 1 | 0 |
| 2947 | 1 | 0 |
| 2948 | 1 | 0 |
| 2949 | 1 | 0 |
| 2950 | 1 | 0 |
| 2951 | 1 | 0 |
| 2952 | 1 | 0 |
| 2953 | 1 | 0 |
| 2954 | 1 | 0 |
| 2955 | 1 | 0 |
| 2956 | 1 | 0 |
| 2957 | 1 | 0 |
| 2958 | 1 | 0 |
| 2959 | 1 | 0 |
| 2960 | 1 | 0 |
| 2961 | 1 | 0 |
| 2962 | 1 | 0 |
| 2963 | 1 | 0 |
| 2964 | 1 | 0 |
| 2965 | 1 | 0 |
| 2966 | 1 | 0 |
| 2967 | 1 | 0 |
| 2968 | 1 | 0 |
| 2969 | 1 | 0 |
| 2970 | 1 | 0 |
| 2971 | 1 | 0 |
| 2972 | 1 | 0 |
| 2973 | 1 | 0 |
| 2974 | 1 | 0 |
| 2975 | 1 | 0 |
| 2976 | 1 | 0 |
| 2977 | 1 | 0 |
| 2978 | 1 | 0 |
| 2979 | 1 | 0 |
| 2980 | 1 | 0 |
| 2981 | 1 | 0 |
| 2982 | 1 | 0 |
| 2983 | 1 | 0 |
| 2984 | 1 | 0 |
| 2985 | 1 | 0 |
| 2986 | 1 | 0 |
| 2987 | 1 | 0 |
| 2988 | 1 | 0 |
| 2989 | 1 | 0 |
| 2990 | 1 | 0 |
| 2991 | 1 | 0 |
| 2992 | 1 | 0 |
| 2993 | 1 | 0 |
| 2994 | 1 | 0 |
| 2995 | 1 | 0 |
| 2996 | 1 | 0 |
| 2997 | 1 | 0 |
| 2998 | 1 | 0 |
| 2999 | 1 | 0 |
| 3000 | 1 | 0 |
| 3001 | 1 | 0 |
| 3002 | 1 | 0 |
| 3003 | 1 | 0 |
| 3004 | 1 | 0 |
| 3005 | 1 | 0 |
| 3006 | 1 | 0 |
| 3007 | 1 | 0 |
| 3008 | 1 | 0 |
| 3009 | 1 | 0 |
| 3010 | 1 | 0 |
| 3011 | 1 | 0 |
| 3012 | 1 | 0 |
| 3013 | 1 | 0 |
| 3014 | 1 | 0 |
| 3015 | 1 | 0 |
| 3016 | 1 | 0 |
| 3017 | 1 | 0 |
| 3018 | 1 | 0 |
| 3019 | 1 | 0 |
| 3020 | 1 | 0 |
| 3021 | 1 | 0 |
| 3022 | 1 | 0 |
| 3023 | 1 | 0 |
| 3024 | 1 | 0 |
| 3025 | 1 | 0 |
| 3026 | 1 | 0 |
| 3027 | 1 | 0 |
| 3028 | 1 | 0 |
| 3029 | 1 | 0 |
| 3030 | 1 | 0 |
| 3031 | 1 | 0 |
| 3032 | 1 | 0 |
| 3033 | 1 | 0 |
| 3034 | 1 | 0 |
| 3035 | 1 | 0 |
| 3036 | 1 | 0 |
| 3037 | 1 | 0 |
| 3038 | 1 | 0 |
| 3039 | 1 | 0 |
| 3040 | 1 | 0 |
| 3041 | 1 | 0 |
| 3042 | 1 | 0 |
| 3043 | 1 | 0 |
| 3044 | 1 | 0 |
| 3045 | 1 | 0 |
| 3046 | 1 | 0 |
| 3047 | 1 | 0 |
| 3048 | 1 | 0 |
| 3049 | 1 | 0 |
| 3050 | 1 | 0 |
| 3051 | 1 | 0 |
| 3052 | 1 | 0 |
| 3053 | 1 | 0 |
| 3054 | 1 | 0 |
| 3055 | 1 | 0 |
| 3056 | 1 | 0 |
| 3057 | 1 | 0 |
| 3058 | 1 | 0 |
| 3059 | 1 | 0 |
| 3060 | 1 | 0 |
| 3061 | 1 | 0 |
| 3062 | 1 | 0 |
| 3063 | 1 | 0 |
| 3064 | 1 | 0 |
| 3065 | 1 | 0 |
| 3066 | 1 | 0 |
| 3067 | 1 | 0 |
| 3068 | 1 | 0 |
| 3069 | 1 | 0 |
| 3070 | 1 | 0 |
| 3071 | 1 | 0 |
| 3072 | 1 | 0 |
| 3073 | 1 | 0 |
| 3074 | 1 | 0 |
| 3075 | 1 | 0 |
| 3076 | 1 | 0 |
| 3077 | 1 | 0 |
| 3078 | 1 | 0 |
| 3079 | 1 | 0 |
| 3080 | 1 | 0 |
| 3081 | 1 | 0 |
| 3082 | 1 | 0 |
| 3083 | 1 | 0 |
| 3084 | 1 | 0 |
| 3085 | 1 | 0 |
| 3086 | 1 | 0 |
| 3087 | 1 | 0 |
| 3088 | 1 | 0 |
| 3089 | 1 | 0 |
| 3090 | 1 | 0 |
| 3091 | 1 | 0 |
| 3092 | 1 | 0 |
| 3093 | 1 | 0 |
| 3094 | 1 | 0 |
| 3095 | 1 | 0 |
| 3096 | 1 | 0 |
| 3097 | 1 | 0 |
| 3098 | 1 | 0 |
| 3099 | 1 | 0 |
| 3100 | 1 | 0 |
| 3101 | 1 | 0 |
| 3102 | 1 | 0 |
| 3103 | 1 | 0 |
| 3104 | 1 | 0 |
| 3105 | 1 | 0 |
| 3106 | 1 | 0 |
| 3107 | 1 | 0 |
| 3108 | 1 | 0 |
| 3109 | 1 | 0 |
| 3110 | 1 | 0 |
| 3111 | 1 | 0 |
| 3112 | 1 | 0 |
| 3113 | 1 | 0 |
| 3114 | 1 | 0 |
| 3115 | 1 | 0 |
| 3116 | 1 | 0 |
| 3117 | 1 | 0 |
| 3118 | 1 | 0 |
| 3119 | 1 | 0 |
| 3120 | 1 | 0 |
| 3121 | 1 | 0 |
| 3122 | 1 | 0 |
| 3123 | 1 | 0 |
| 3124 | 1 | 0 |
| 3125 | 1 | 0 |
| 3126 | 1 | 0 |
| 3127 | 1 | 0 |
| 3128 | 1 | 0 |
| 3129 | 1 | 0 |
| 3130 | 1 | 0 |
| 3131 | 1 | 0 |
| 3132 | 1 | 0 |
| 3133 | 1 | 0 |
| 3134 | 1 | 0 |
| 3135 | 1 | 0 |
| 3136 | 1 | 0 |
| 3137 | 1 | 0 |
| 3138 | 1 | 0 |
| 3139 | 1 | 0 |
| 3140 | 1 | 0 |
| 3141 | 1 | 0 |
| 3142 | 1 | 0 |
| 3143 | 1 | 0 |
| 3144 | 1 | 0 |
| 3145 | 1 | 0 |
| 3146 | 1 | 0 |
| 3147 | 1 | 0 |
| 3148 | 1 | 0 |
| 3149 | 1 | 0 |
| 3150 | 1 | 0 |
| 3151 | 1 | 0 |
| 3152 | 1 | 0 |
| 3153 | 1 | 0 |
| 3154 | 1 | 0 |
| 3155 | 1 | 0 |
| 3156 | 1 | 0 |
| 3157 | 1 | 0 |
| 3158 | 1 | 0 |
| 3159 | 1 | 0 |
| 3160 | 1 | 0 |
| 3161 | 1 | 0 |
| 3162 | 1 | 0 |
| 3163 | 1 | 0 |
| 3164 | 1 | 0 |
| 3165 | 1 | 0 |
| 3166 | 1 | 0 |
| 3167 | 1 | 0 |
| 3168 | 1 | 0 |
| 3169 | 1 | 0 |
| 3170 | 1 | 0 |
| 3171 | 1 | 0 |
| 3172 | 1 | 0 |
| 3173 | 1 | 0 |
| 3174 | 1 | 0 |
| 3175 | 1 | 0 |
| 3176 | 1 | 0 |
| 3177 | 1 | 0 |
| 3178 | 1 | 0 |
| 3179 | 1 | 0 |
| 3180 | 1 | 0 |
| 3181 | 1 | 0 |
| 3182 | 1 | 0 |
| 3183 | 1 | 0 |
| 3184 | 1 | 0 |
| 3185 | 1 | 0 |
| 3186 | 1 | 0 |
| 3187 | 1 | 0 |
| 3188 | 1 | 0 |
| 3189 | 1 | 0 |
| 3190 | 1 | 0 |
| 3191 | 1 | 0 |
| 3192 | 1 | 0 |
| 3193 | 1 | 0 |
| 3194 | 1 | 0 |
| 3195 | 1 | 0 |
| 3196 | 1 | 0 |
| 3197 | 1 | 0 |
| 3198 | 1 | 0 |
| 3199 | 1 | 0 |
| 3200 | 1 | 0 |
| 3201 | 1 | 0 |
| 3202 | 1 | 0 |
| 3203 | 1 | 0 |
| 3204 | 1 | 0 |
| 3205 | 1 | 0 |
| 3206 | 1 | 0 |
| 3207 | 1 | 0 |
| 3208 | 1 | 0 |
| 3209 | 1 | 0 |
| 3210 | 1 | 0 |
| 3211 | 1 | 0 |
| 3212 | 1 | 0 |
| 3213 | 1 | 0 |
| 3214 | 1 | 0 |
| 3215 | 1 | 0 |
| 3216 | 1 | 0 |
| 3217 | 1 | 0 |
| 3218 | 1 | 0 |
| 3219 | 1 | 0 |
| 3220 | 1 | 0 |
| 3221 | 1 | 0 |
| 3222 | 1 | 0 |
| 3223 | 1 | 0 |
| 3224 | 1 | 0 |
| 3225 | 1 | 0 |
| 3226 | 1 | 0 |
| 3227 | 1 | 0 |
| 3228 | 1 | 0 |
| 3229 | 1 | 0 |
| 3230 | 1 | 0 |
| 3231 | 1 | 0 |
| 3232 | 1 | 0 |
| 3233 | 1 | 0 |
| 3234 | 1 | 0 |
| 3235 | 1 | 0 |
| 3236 | 1 | 0 |
| 3237 | 1 | 0 |
| 3238 | 1 | 0 |
| 3239 | 1 | 0 |
| 3240 | 1 | 0 |
| 3241 | 1 | 0 |
| 3242 | 1 | 0 |
| 3243 | 1 | 0 |
| 3244 | 1 | 0 |
| 3245 | 1 | 0 |
| 3246 | 1 | 0 |
| 3247 | 1 | 0 |
| 3248 | 1 | 0 |
| 3249 | 1 | 0 |
| 3250 | 1 | 0 |
| 3251 | 1 | 0 |
| 3252 | 1 | 0 |
| 3253 | 1 | 0 |
| 3254 | 1 | 0 |
| 3255 | 1 | 0 |
| 3256 | 1 | 0 |
| 3257 | 1 | 0 |
| 3258 | 1 | 0 |
| 3259 | 1 | 0 |
| 3260 | 1 | 0 |
| 3261 | 1 | 0 |
| 3262 | 1 | 0 |
| 3263 | 1 | 0 |
| 3264 | 1 | 0 |
| 3265 | 1 | 0 |
| 3266 | 1 | 0 |
| 3267 | 1 | 0 |
| 3268 | 1 | 0 |
| 3269 | 1 | 0 |
| 3270 | 1 | 0 |
| 3271 | 1 | 0 |
| 3272 | 1 | 0 |
| 3273 | 1 | 0 |
| 3274 | 1 | 0 |
| 3275 | 1 | 0 |
| 3276 | 1 | 0 |
| 3277 | 1 | 0 |
| 3278 | 1 | 0 |
| 3279 | 1 | 0 |
| 3280 | 1 | 0 |
| 3281 | 1 | 0 |
| 3282 | 1 | 0 |
| 3283 | 1 | 0 |
| 3284 | 1 | 0 |
| 3285 | 1 | 0 |
| 3286 | 1 | 0 |
| 3287 | 1 | 0 |
| 3288 | 1 | 0 |
| 3289 | 1 | 0 |
| 3290 | 1 | 0 |
| 3291 | 1 | 0 |
| 3292 | 1 | 0 |
| 3293 | 1 | 0 |
| 3294 | 1 | 0 |
| 3295 | 1 | 0 |
| 3296 | 1 | 0 |
| 3297 | 1 | 0 |
| 3298 | 1 | 0 |
| 3299 | 1 | 0 |
| 3300 | 1 | 0 |
| 3301 | 1 | 0 |
| 3302 | 1 | 0 |
| 3303 | 1 | 0 |
| 3304 | 1 | 0 |
| 3305 | 1 | 0 |
| 3306 | 1 | 0 |
| 3307 | 1 | 0 |
| 3308 | 1 | 0 |
| 3309 | 1 | 0 |
| 3310 | 1 | 0 |
| 3311 | 1 | 0 |
| 3312 | 1 | 0 |
| 3313 | 1 | 0 |
| 3314 | 1 | 0 |
| 3315 | 1 | 0 |
| 3316 | 1 | 0 |
| 3317 | 1 | 0 |
| 3318 | 1 | 0 |
| 3319 | 1 | 0 |
| 3320 | 1 | 0 |
| 3321 | 1 | 0 |
| 3322 | 1 | 0 |
| 3323 | 1 | 0 |
| 3324 | 1 | 0 |
| 3325 | 1 | 0 |
| 3326 | 1 | 0 |
| 3327 | 1 | 0 |
| 3328 | 1 | 0 |
| 3329 | 1 | 0 |
| 3330 | 1 | 0 |
| 3331 | 1 | 0 |
| 3332 | 1 | 0 |
| 3333 | 1 | 0 |
| 3334 | 1 | 0 |
| 3335 | 1 | 0 |
| 3336 | 1 | 0 |
| 3337 | 1 | 0 |
| 3338 | 1 | 0 |
| 3339 | 1 | 0 |
| 3340 | 1 | 0 |
| 3341 | 1 | 0 |
| 3342 | 1 | 0 |
| 3343 | 1 | 0 |
| 3344 | 1 | 0 |
| 3345 | 1 | 0 |
| 3346 | 1 | 0 |
| 3347 | 1 | 0 |
| 3348 | 1 | 0 |
| 3349 | 1 | 0 |
| 3350 | 1 | 0 |
| 3351 | 1 | 0 |
| 3352 | 1 | 0 |
| 3353 | 1 | 0 |
| 3354 | 1 | 0 |
| 3355 | 1 | 0 |
| 3356 | 1 | 0 |
| 3357 | 1 | 0 |
| 3358 | 1 | 0 |
| 3359 | 1 | 0 |
| 3360 | 1 | 0 |
| 3361 | 1 | 0 |
| 3362 | 1 | 0 |
| 3363 | 1 | 0 |
| 3364 | 1 | 0 |
| 3365 | 1 | 0 |
| 3366 | 1 | 0 |
| 3367 | 1 | 0 |
| 3368 | 1 | 0 |
| 3369 | 1 | 0 |
| 3370 | 1 | 0 |
| 3371 | 1 | 0 |
| 3372 | 1 | 0 |
| 3373 | 1 | 0 |
| 3374 | 1 | 0 |
| 3375 | 1 | 0 |
| 3376 | 1 | 0 |
| 3377 | 1 | 0 |
| 3378 | 1 | 0 |
| 3379 | 1 | 0 |
| 3380 | 1 | 0 |
| 3381 | 1 | 0 |
| 3382 | 1 | 0 |
| 3383 | 1 | 0 |
| 3384 | 1 | 0 |
| 3385 | 1 | 0 |
| 3386 | 1 | 0 |
| 3387 | 1 | 0 |
| 3388 | 1 | 0 |
| 3389 | 1 | 0 |
| 3390 | 1 | 0 |
| 3391 | 1 | 0 |
| 3392 | 1 | 0 |
| 3393 | 1 | 0 |
| 3394 | 1 | 0 |
| 3395 | 1 | 0 |
| 3396 | 1 | 0 |
| 3397 | 1 | 0 |
| 3398 | 1 | 0 |
| 3399 | 1 | 0 |
| 3400 | 1 | 0 |
| 3401 | 1 | 0 |
| 3402 | 1 | 0 |
| 3403 | 1 | 0 |
| 3404 | 1 | 0 |
| 3405 | 1 | 0 |
| 3406 | 1 | 0 |
| 3407 | 1 | 0 |
| 3408 | 1 | 0 |
| 3409 | 1 | 0 |
| 3410 | 1 | 0 |
| 3411 | 1 | 0 |
| 3412 | 1 | 0 |
| 3413 | 1 | 0 |
| 3414 | 1 | 0 |
| 3415 | 1 | 0 |
| 3416 | 1 | 0 |
| 3417 | 1 | 0 |
| 3418 | 1 | 0 |
| 3419 | 1 | 0 |
| 3420 | 1 | 0 |
| 3421 | 1 | 0 |
| 3422 | 1 | 0 |
| 3423 | 1 | 0 |
| 3424 | 1 | 0 |
| 3425 | 1 | 0 |
| 3426 | 1 | 0 |
| 3427 | 1 | 0 |
| 3428 | 1 | 0 |
| 3429 | 1 | 0 |
| 3430 | 1 | 0 |
| 3431 | 1 | 0 |
| 3432 | 1 | 0 |
| 3433 | 1 | 0 |
| 3434 | 1 | 0 |
| 3435 | 1 | 0 |
| 3436 | 1 | 0 |
| 3437 | 1 | 0 |
| 3438 | 1 | 0 |
| 3439 | 1 | 0 |
| 3440 | 1 | 0 |
| 3441 | 1 | 0 |
| 3442 | 1 | 0 |
| 3443 | 1 | 0 |
| 3444 | 1 | 0 |
| 3445 | 1 | 0 |
| 3446 | 1 | 0 |
| 3447 | 1 | 0 |
| 3448 | 1 | 0 |
| 3449 | 1 | 0 |
| 3450 | 1 | 0 |
| 3451 | 1 | 0 |
| 3452 | 1 | 0 |
| 3453 | 1 | 0 |
| 3454 | 1 | 0 |
| 3455 | 1 | 0 |
| 3456 | 1 | 0 |
| 3457 | 1 | 0 |
| 3458 | 1 | 0 |
| 3459 | 1 | 0 |
| 3460 | 1 | 0 |
| 3461 | 1 | 0 |
| 3462 | 1 | 0 |
| 3463 | 1 | 0 |
| 3464 | 1 | 0 |
| 3465 | 1 | 0 |
| 3466 | 1 | 0 |
| 3467 | 1 | 0 |
| 3468 | 1 | 0 |
| 3469 | 1 | 0 |
| 3470 | 1 | 0 |
| 3471 | 1 | 0 |
| 3472 | 1 | 0 |
| 3473 | 1 | 0 |
| 3474 | 1 | 0 |
| 3475 | 1 | 0 |
| 3476 | 1 | 0 |
| 3477 | 1 | 0 |
| 3478 | 1 | 0 |
| 3479 | 1 | 0 |
| 3480 | 1 | 0 |
| 3481 | 1 | 0 |
| 3482 | 1 | 0 |
| 3483 | 1 | 0 |
| 3484 | 1 | 0 |
| 3485 | 1 | 0 |
| 3486 | 1 | 0 |
| 3487 | 1 | 0 |
| 3488 | 1 | 0 |
| 3489 | 1 | 0 |
| 3490 | 1 | 0 |
| 3491 | 1 | 0 |
| 3492 | 1 | 0 |
| 3493 | 1 | 0 |
| 3494 | 1 | 0 |
| 3495 | 1 | 0 |
| 3496 | 1 | 0 |
| 3497 | 1 | 0 |
| 3498 | 1 | 0 |
| 3499 | 1 | 0 |
| 3500 | 1 | 0 |
| 3501 | 1 | 0 |
| 3502 | 1 | 0 |
| 3503 | 1 | 0 |
| 3504 | 1 | 0 |
| 3505 | 1 | 0 |
| 3506 | 1 | 0 |
| 3507 | 1 | 0 |
| 3508 | 1 | 0 |
| 3509 | 1 | 0 |
| 3510 | 1 | 0 |
| 3511 | 1 | 0 |
| 3512 | 1 | 0 |
| 3513 | 1 | 0 |
| 3514 | 1 | 0 |
| 3515 | 1 | 0 |
| 3516 | 1 | 0 |
| 3517 | 1 | 0 |
| 3518 | 1 | 0 |
| 3519 | 1 | 0 |
| 3520 | 1 | 0 |
| 3521 | 1 | 0 |
| 3522 | 1 | 0 |
| 3523 | 1 | 0 |
| 3524 | 1 | 0 |
| 3525 | 1 | 0 |
| 3526 | 1 | 0 |
| 3527 | 1 | 0 |
| 3528 | 1 | 0 |
| 3529 | 1 | 0 |
| 3530 | 1 | 0 |
| 3531 | 1 | 0 |
| 3532 | 1 | 0 |
| 3533 | 1 | 0 |
| 3534 | 1 | 0 |
| 3535 | 1 | 0 |
| 3536 | 1 | 0 |
| 3537 | 1 | 0 |
| 3538 | 1 | 0 |
| 3539 | 1 | 0 |
| 3540 | 1 | 0 |
| 3541 | 1 | 0 |
| 3542 | 1 | 0 |
| 3543 | 1 | 0 |
| 3544 | 1 | 0 |
| 3545 | 1 | 0 |
| 3546 | 1 | 0 |
| 3547 | 1 | 0 |
| 3548 | 1 | 0 |
| 3549 | 1 | 0 |
| 3550 | 1 | 0 |
| 3551 | 1 | 0 |
| 3552 | 1 | 0 |
| 3553 | 1 | 0 |
| 3554 | 1 | 0 |
| 3555 | 1 | 0 |
| 3556 | 1 | 0 |
| 3557 | 1 | 0 |
| 3558 | 1 | 0 |
| 3559 | 1 | 0 |
| 3560 | 1 | 0 |
| 3561 | 1 | 0 |
| 3562 | 1 | 0 |
| 3563 | 1 | 0 |
| 3564 | 1 | 0 |
| 3565 | 1 | 0 |
| 3566 | 1 | 0 |
| 3567 | 1 | 0 |
| 3568 | 1 | 0 |
| 3569 | 1 | 0 |
| 3570 | 1 | 0 |
| 3571 | 1 | 0 |
| 3572 | 1 | 0 |
| 3573 | 1 | 0 |
| 3574 | 1 | 0 |
| 3575 | 1 | 0 |
| 3576 | 1 | 0 |
| 3577 | 1 | 0 |
| 3578 | 1 | 0 |
| 3579 | 1 | 0 |
| 3580 | 1 | 0 |
| 3581 | 1 | 0 |
| 3582 | 1 | 0 |
| 3583 | 1 | 0 |
| 3584 | 1 | 0 |
| 3585 | 1 | 0 |
| 3586 | 1 | 0 |
| 3587 | 1 | 0 |
| 3588 | 1 | 0 |
| 3589 | 1 | 0 |
| 3590 | 1 | 0 |
| 3591 | 1 | 0 |
| 3592 | 1 | 0 |
| 3593 | 1 | 0 |
| 3594 | 1 | 0 |
| 3595 | 1 | 0 |
| 3596 | 1 | 0 |
| 3597 | 1 | 0 |
| 3598 | 1 | 0 |
| 3599 | 1 | 0 |
| 3600 | 1 | 0 |
| 3601 | 1 | 0 |
| 3602 | 1 | 0 |
| 3603 | 1 | 0 |
| 3604 | 1 | 0 |
| 3605 | 1 | 0 |
| 3606 | 1 | 0 |
| 3607 | 1 | 0 |
| 3608 | 1 | 0 |
| 3609 | 1 | 0 |
| 3610 | 1 | 0 |
| 3611 | 1 | 0 |
| 3612 | 1 | 0 |
| 3613 | 1 | 0 |
| 3614 | 1 | 0 |
| 3615 | 1 | 0 |
| 3616 | 1 | 0 |
| 3617 | 1 | 0 |
| 3618 | 1 | 0 |
| 3619 | 1 | 0 |
| 3620 | 1 | 0 |
| 3621 | 1 | 0 |
| 3622 | 1 | 0 |
| 3623 | 1 | 0 |
| 3624 | 1 | 0 |
| 3625 | 1 | 0 |
| 3626 | 1 | 0 |
| 3627 | 1 | 0 |
| 3628 | 1 | 0 |
| 3629 | 1 | 0 |
| 3630 | 1 | 0 |
| 3631 | 1 | 0 |
| 3632 | 1 | 0 |
| 3633 | 1 | 0 |
| 3634 | 1 | 0 |
| 3635 | 1 | 0 |
| 3636 | 1 | 0 |
| 3637 | 1 | 0 |
| 3638 | 1 | 0 |
| 3639 | 1 | 0 |
| 3640 | 1 | 0 |
| 3641 | 1 | 0 |
| 3642 | 1 | 0 |
| 3643 | 1 | 0 |
| 3644 | 1 | 0 |
| 3645 | 1 | 0 |
| 3646 | 1 | 0 |
| 3647 | 1 | 0 |
| 3648 | 1 | 0 |
| 3649 | 1 | 0 |
| 3650 | 1 | 0 |
| 3651 | 1 | 0 |
| 3652 | 1 | 0 |
| 3653 | 1 | 0 |
| 3654 | 1 | 0 |
| 3655 | 1 | 0 |
| 3656 | 1 | 0 |
| 3657 | 1 | 0 |
| 3658 | 1 | 0 |
| 3659 | 1 | 0 |
| 3660 | 1 | 0 |
| 3661 | 1 | 0 |
| 3662 | 1 | 0 |
| 3663 | 1 | 0 |
| 3664 | 1 | 0 |
| 3665 | 1 | 0 |
| 3666 | 1 | 0 |
| 3667 | 1 | 0 |
| 3668 | 1 | 0 |
| 3669 | 1 | 0 |
| 3670 | 1 | 0 |
| 3671 | 1 | 0 |
| 3672 | 1 | 0 |
| 3673 | 1 | 0 |
| 3674 | 1 | 0 |
| 3675 | 1 | 0 |
| 3676 | 1 | 0 |
| 3677 | 1 | 0 |
| 3678 | 1 | 0 |
| 3679 | 1 | 0 |
| 3680 | 1 | 0 |
| 3681 | 1 | 0 |
| 3682 | 1 | 0 |
| 3683 | 1 | 0 |
| 3684 | 1 | 0 |
| 3685 | 1 | 0 |
| 3686 | 1 | 0 |
| 3687 | 1 | 0 |
| 3688 | 1 | 0 |
| 3689 | 1 | 0 |
| 3690 | 1 | 0 |
| 3691 | 1 | 0 |
| 3692 | 1 | 0 |
| 3693 | 1 | 0 |
| 3694 | 1 | 0 |
| 3695 | 1 | 0 |
| 3696 | 1 | 0 |
| 3697 | 1 | 0 |
| 3698 | 1 | 0 |
| 3699 | 1 | 0 |
| 3700 | 1 | 0 |
| 3701 | 1 | 0 |
| 3702 | 1 | 0 |
| 3703 | 1 | 0 |
| 3704 | 1 | 0 |
| 3705 | 1 | 0 |
| 3706 | 1 | 0 |
| 3707 | 1 | 0 |
| 3708 | 1 | 0 |
| 3709 | 1 | 0 |
| 3710 | 1 | 0 |
| 3711 | 1 | 0 |
| 3712 | 1 | 0 |
| 3713 | 1 | 0 |
| 3714 | 1 | 0 |
| 3715 | 1 | 0 |
| 3716 | 1 | 0 |
| 3717 | 1 | 0 |
| 3718 | 1 | 0 |
| 3719 | 1 | 0 |
| 3720 | 1 | 0 |
| 3721 | 1 | 0 |
| 3722 | 1 | 0 |
| 3723 | 1 | 0 |
| 3724 | 1 | 0 |
| 3725 | 1 | 0 |
| 3726 | 1 | 0 |
| 3727 | 1 | 0 |
| 3728 | 1 | 0 |
| 3729 | 1 | 0 |
| 3730 | 1 | 0 |
| 3731 | 1 | 0 |
| 3732 | 1 | 0 |
| 3733 | 1 | 0 |
| 3734 | 1 | 0 |
| 3735 | 1 | 0 |
| 3736 | 1 | 0 |
| 3737 | 1 | 0 |
| 3738 | 1 | 0 |
| 3739 | 1 | 0 |
| 3740 | 1 | 0 |
| 3741 | 1 | 0 |
| 3742 | 1 | 0 |
| 3743 | 1 | 0 |
| 3744 | 1 | 0 |
| 3745 | 1 | 0 |
| 3746 | 1 | 0 |
| 3747 | 1 | 0 |
| 3748 | 1 | 0 |
| 3749 | 1 | 0 |
| 3750 | 1 | 0 |
| 3751 | 1 | 0 |
| 3752 | 1 | 0 |
| 3753 | 1 | 0 |
| 3754 | 1 | 0 |
| 3755 | 1 | 0 |
| 3756 | 1 | 0 |
| 3757 | 1 | 0 |
| 3758 | 1 | 0 |
| 3759 | 1 | 0 |
| 3760 | 1 | 0 |
| 3761 | 1 | 0 |
| 3762 | 1 | 0 |
| 3763 | 1 | 0 |
| 3764 | 1 | 0 |
| 3765 | 1 | 0 |
| 3766 | 1 | 0 |
| 3767 | 1 | 0 |
| 3768 | 1 | 0 |
| 3769 | 1 | 0 |
| 3770 | 1 | 0 |
| 3771 | 1 | 0 |
| 3772 | 1 | 0 |
| 3773 | 1 | 0 |
| 3774 | 1 | 0 |
| 3775 | 1 | 0 |
| 3776 | 1 | 0 |
| 3777 | 1 | 0 |
| 3778 | 1 | 0 |
| 3779 | 1 | 0 |
| 3780 | 1 | 0 |
| 3781 | 1 | 0 |
| 3782 | 1 | 0 |
| 3783 | 1 | 0 |
| 3784 | 1 | 0 |
| 3785 | 1 | 0 |
| 3786 | 1 | 0 |
| 3787 | 1 | 0 |
| 3788 | 1 | 0 |
| 3789 | 1 | 0 |
| 3790 | 1 | 0 |
| 3791 | 1 | 0 |
| 3792 | 1 | 0 |
| 3793 | 1 | 0 |
| 3794 | 1 | 0 |
| 3795 | 1 | 0 |
| 3796 | 1 | 0 |
| 3797 | 1 | 0 |
| 3798 | 1 | 0 |
| 3799 | 1 | 0 |
| 3800 | 1 | 0 |
| 3801 | 1 | 0 |
| 3802 | 1 | 0 |
| 3803 | 1 | 0 |
| 3804 | 1 | 0 |
| 3805 | 1 | 0 |
| 3806 | 1 | 0 |
| 3807 | 1 | 0 |
| 3808 | 1 | 0 |
| 3809 | 1 | 0 |
| 3810 | 1 | 0 |
| 3811 | 1 | 0 |
| 3812 | 1 | 0 |
| 3813 | 1 | 0 |
| 3814 | 1 | 0 |
| 3815 | 1 | 0 |
| 3816 | 1 | 0 |
| 3817 | 1 | 0 |
| 3818 | 1 | 0 |
| 3819 | 1 | 0 |
| 3820 | 1 | 0 |
| 3821 | 1 | 0 |
| 3822 | 1 | 0 |
| 3823 | 1 | 0 |
| 3824 | 1 | 0 |
| 3825 | 1 | 0 |
| 3826 | 1 | 0 |
| 3827 | 1 | 0 |
| 3828 | 1 | 0 |
| 3829 | 1 | 0 |
| 3830 | 1 | 0 |
| 3831 | 1 | 0 |
| 3832 | 1 | 0 |
| 3833 | 1 | 0 |
| 3834 | 1 | 0 |
| 3835 | 1 | 0 |
| 3836 | 1 | 0 |
| 3837 | 1 | 0 |
| 3838 | 1 | 0 |
| 3839 | 1 | 0 |
| 3840 | 1 | 0 |
| 3841 | 1 | 0 |
| 3842 | 1 | 0 |
| 3843 | 1 | 0 |
| 3844 | 1 | 0 |
| 3845 | 1 | 0 |
| 3846 | 1 | 0 |
| 3847 | 1 | 0 |
| 3848 | 1 | 0 |
| 3849 | 1 | 0 |
| 3850 | 1 | 0 |
| 3851 | 1 | 0 |
| 3852 | 1 | 0 |
| 3853 | 1 | 0 |
| 3854 | 1 | 0 |
| 3855 | 1 | 0 |
| 3856 | 1 | 0 |
| 3857 | 1 | 0 |
| 3858 | 1 | 0 |
| 3859 | 1 | 0 |
| 3860 | 1 | 0 |
| 3861 | 1 | 0 |
| 3862 | 1 | 0 |
| 3863 | 1 | 0 |
| 3864 | 1 | 0 |
| 3865 | 1 | 0 |
| 3866 | 1 | 0 |
| 3867 | 1 | 0 |
| 3868 | 1 | 0 |
| 3869 | 1 | 0 |
| 3870 | 1 | 0 |
| 3871 | 1 | 0 |
| 3872 | 1 | 0 |
| 3873 | 1 | 0 |
| 3874 | 1 | 0 |
| 3875 | 1 | 0 |
| 3876 | 1 | 0 |
| 3877 | 1 | 0 |
| 3878 | 1 | 0 |
| 3879 | 1 | 0 |
| 3880 | 1 | 0 |
| 3881 | 1 | 0 |
| 3882 | 1 | 0 |
| 3883 | 1 | 0 |
| 3884 | 1 | 0 |
| 3885 | 1 | 0 |
| 3886 | 1 | 0 |
| 3887 | 1 | 0 |
| 3888 | 1 | 0 |
| 3889 | 1 | 0 |
| 3890 | 1 | 0 |
| 3891 | 1 | 0 |
| 3892 | 1 | 0 |
| 3893 | 1 | 0 |
| 3894 | 1 | 0 |
| 3895 | 1 | 0 |
| 3896 | 1 | 0 |
| 3897 | 1 | 0 |
| 3898 | 1 | 0 |
| 3899 | 1 | 0 |
| 3900 | 1 | 0 |
| 3901 | 1 | 0 |
| 3902 | 1 | 0 |
| 3903 | 1 | 0 |
| 3904 | 1 | 0 |
| 3905 | 1 | 0 |
| 3906 | 1 | 0 |
| 3907 | 1 | 0 |
| 3908 | 1 | 0 |
| 3909 | 1 | 0 |
| 3910 | 1 | 0 |
| 3911 | 1 | 0 |
| 3912 | 1 | 0 |
| 3913 | 1 | 0 |
| 3914 | 1 | 0 |
| 3915 | 1 | 0 |
| 3916 | 1 | 0 |
| 3917 | 1 | 0 |
| 3918 | 1 | 0 |
| 3919 | 1 | 0 |
| 3920 | 1 | 0 |
| 3921 | 1 | 0 |
| 3922 | 1 | 0 |
| 3923 | 1 | 0 |
| 3924 | 1 | 0 |
| 3925 | 1 | 0 |
| 3926 | 1 | 0 |
| 3927 | 1 | 0 |
| 3928 | 1 | 0 |
| 3929 | 1 | 0 |
| 3930 | 1 | 0 |
| 3931 | 1 | 0 |
| 3932 | 1 | 0 |
| 3933 | 1 | 0 |
| 3934 | 1 | 0 |
| 3935 | 1 | 0 |
| 3936 | 1 | 0 |
| 3937 | 1 | 0 |
| 3938 | 1 | 0 |
| 3939 | 1 | 0 |
| 3940 | 1 | 0 |
| 3941 | 1 | 0 |
| 3942 | 1 | 0 |
| 3943 | 1 | 0 |
| 3944 | 1 | 0 |
| 3945 | 1 | 0 |
| 3946 | 1 | 0 |
| 3947 | 1 | 0 |
| 3948 | 1 | 0 |
| 3949 | 1 | 0 |
| 3950 | 1 | 0 |
| 3951 | 1 | 0 |
| 3952 | 1 | 0 |
| 3953 | 1 | 0 |
| 3954 | 1 | 0 |
| 3955 | 1 | 0 |
| 3956 | 1 | 0 |
| 3957 | 1 | 0 |
| 3958 | 1 | 0 |
| 3959 | 1 | 0 |
| 3960 | 1 | 0 |
| 3961 | 1 | 0 |
| 3962 | 1 | 0 |
| 3963 | 1 | 0 |
| 3964 | 1 | 0 |
| 3965 | 1 | 0 |
| 3966 | 1 | 0 |
| 3967 | 1 | 0 |
| 3968 | 1 | 0 |
| 3969 | 1 | 0 |
| 3970 | 1 | 0 |
| 3971 | 1 | 0 |
| 3972 | 1 | 0 |
| 3973 | 1 | 0 |
| 3974 | 1 | 0 |
| 3975 | 1 | 0 |
| 3976 | 1 | 0 |
| 3977 | 1 | 0 |
| 3978 | 1 | 0 |
| 3979 | 1 | 0 |
| 3980 | 1 | 0 |
| 3981 | 1 | 0 |
| 3982 | 1 | 0 |
| 3983 | 1 | 0 |
| 3984 | 1 | 0 |
| 3985 | 1 | 0 |
| 3986 | 1 | 0 |
| 3987 | 1 | 0 |
| 3988 | 1 | 0 |
| 3989 | 1 | 0 |
| 3990 | 1 | 0 |
| 3991 | 1 | 0 |
| 3992 | 1 | 0 |
| 3993 | 1 | 0 |
| 3994 | 1 | 0 |
| 3995 | 1 | 0 |
| 3996 | 1 | 0 |
| 3997 | 1 | 0 |
| 3998 | 1 | 0 |
| 3999 | 1 | 0 |
| 4000 | 1 | 0 |
| 4001 | 1 | 0 |
| 4002 | 1 | 0 |
| 4003 | 1 | 0 |
| 4004 | 1 | 0 |
| 4005 | 1 | 0 |
| 4006 | 1 | 0 |
| 4007 | 1 | 0 |
| 4008 | 1 | 0 |
| 4009 | 1 | 0 |
| 4010 | 1 | 0 |
| 4011 | 1 | 0 |
| 4012 | 1 | 0 |
| 4013 | 1 | 0 |
| 4014 | 1 | 0 |
| 4015 | 1 | 0 |
| 4016 | 1 | 0 |
| 4017 | 1 | 0 |
| 4018 | 1 | 0 |
| 4019 | 1 | 0 |
| 4020 | 1 | 0 |
| 4021 | 1 | 0 |
| 4022 | 1 | 0 |
| 4023 | 1 | 0 |
| 4024 | 1 | 0 |
| 4025 | 1 | 0 |
| 4026 | 1 | 0 |
| 4027 | 1 | 0 |
| 4028 | 1 | 0 |
| 4029 | 1 | 0 |
| 4030 | 1 | 0 |
| 4031 | 1 | 0 |
| 4032 | 1 | 0 |
| 4033 | 1 | 0 |
| 4034 | 1 | 0 |
| 4035 | 1 | 0 |
| 4036 | 1 | 0 |
| 4037 | 1 | 0 |
| 4038 | 1 | 0 |
| 4039 | 1 | 0 |
| 4040 | 1 | 0 |
| 4041 | 1 | 0 |
| 4042 | 1 | 0 |
| 4043 | 1 | 0 |
| 4044 | 1 | 0 |
| 4045 | 1 | 0 |
| 4046 | 1 | 0 |
| 4047 | 1 | 0 |
| 4048 | 1 | 0 |
| 4049 | 1 | 0 |
| 4050 | 1 | 0 |
| 4051 | 1 | 0 |
| 4052 | 1 | 0 |
| 4053 | 1 | 0 |
| 4054 | 1 | 0 |
| 4055 | 1 | 0 |
| 4056 | 1 | 0 |
| 4057 | 1 | 0 |
| 4058 | 1 | 0 |
| 4059 | 1 | 0 |
| 4060 | 1 | 0 |
| 4061 | 1 | 0 |
| 4062 | 1 | 0 |
| 4063 | 1 | 0 |
| 4064 | 1 | 0 |
| 4065 | 1 | 0 |
| 4066 | 1 | 0 |
| 4067 | 1 | 0 |
| 4068 | 1 | 0 |
| 4069 | 1 | 0 |
| 4070 | 1 | 0 |
| 4071 | 1 | 0 |
| 4072 | 1 | 0 |
| 4073 | 1 | 0 |
| 4074 | 1 | 0 |
| 4075 | 1 | 0 |
| 4076 | 1 | 0 |
| 4077 | 1 | 0 |
| 4078 | 1 | 0 |
| 4079 | 1 | 0 |
| 4080 | 1 | 0 |
| 4081 | 1 | 0 |
| 4082 | 1 | 0 |
| 4083 | 1 | 0 |
| 4084 | 1 | 0 |
| 4085 | 1 | 0 |
| 4086 | 1 | 0 |
| 4087 | 1 | 0 |
| 4088 | 1 | 0 |
| 4089 | 1 | 0 |
| 4090 | 1 | 0 |
| 4091 | 1 | 0 |
| 4092 | 1 | 0 |
| 4093 | 1 | 0 |
| 4094 | 1 | 0 |
| 4095 | 1 | 0 |
| 4096 | 1 | 0 |
| 4097 | 1 | 0 |
| 4098 | 1 | 0 |
| 4099 | 1 | 0 |
| 4100 | 1 | 0 |
| 4101 | 1 | 0 |
| 4102 | 1 | 0 |
| 4103 | 1 | 0 |
| 4104 | 1 | 0 |
| 4105 | 1 | 0 |
| 4106 | 1 | 0 |
| 4107 | 1 | 0 |
| 4108 | 1 | 0 |
| 4109 | 1 | 0 |
| 4110 | 1 | 0 |
| 4111 | 1 | 0 |
| 4112 | 1 | 0 |
| 4113 | 1 | 0 |
| 4114 | 1 | 0 |
| 4115 | 1 | 0 |
| 4116 | 1 | 0 |
| 4117 | 1 | 0 |
| 4118 | 1 | 0 |
| 4119 | 1 | 0 |
| 4120 | 1 | 0 |
| 4121 | 1 | 0 |
| 4122 | 1 | 0 |
| 4123 | 1 | 0 |
| 4124 | 1 | 0 |
| 4125 | 1 | 0 |
| 4126 | 1 | 0 |
| 4127 | 1 | 0 |
| 4128 | 1 | 0 |
| 4129 | 1 | 0 |
| 4130 | 1 | 0 |
| 4131 | 1 | 0 |
| 4132 | 1 | 0 |
| 4133 | 1 | 0 |
| 4134 | 1 | 0 |
| 4135 | 1 | 0 |
| 4136 | 1 | 0 |
| 4137 | 1 | 0 |
| 4138 | 1 | 0 |
| 4139 | 1 | 0 |
| 4140 | 1 | 0 |
| 4141 | 1 | 0 |
| 4142 | 1 | 0 |
| 4143 | 1 | 0 |
| 4144 | 1 | 0 |
| 4145 | 1 | 0 |
| 4146 | 1 | 0 |
| 4147 | 1 | 0 |
| 4148 | 1 | 0 |
| 4149 | 1 | 0 |
| 4150 | 1 | 0 |
| 4151 | 1 | 0 |
| 4152 | 1 | 0 |
| 4153 | 1 | 0 |
| 4154 | 1 | 0 |
| 4155 | 1 | 0 |
| 4156 | 1 | 0 |
| 4157 | 1 | 0 |
| 4158 | 1 | 0 |
| 4159 | 1 | 0 |
| 4160 | 1 | 0 |
| 4161 | 1 | 0 |
| 4162 | 1 | 0 |
| 4163 | 1 | 0 |
| 4164 | 1 | 0 |
| 4165 | 1 | 0 |
| 4166 | 1 | 0 |
| 4167 | 1 | 0 |
| 4168 | 1 | 0 |
| 4169 | 1 | 0 |
| 4170 | 1 | 0 |
| 4171 | 1 | 0 |
| 4172 | 1 | 0 |
| 4173 | 1 | 0 |
| 4174 | 1 | 0 |
| 4175 | 1 | 0 |
| 4176 | 1 | 0 |
| 4177 | 1 | 0 |
| 4178 | 1 | 0 |
| 4179 | 1 | 0 |
| 4180 | 1 | 0 |
| 4181 | 1 | 0 |
| 4182 | 1 | 0 |
| 4183 | 1 | 0 |
| 4184 | 1 | 0 |
| 4185 | 1 | 0 |
| 4186 | 1 | 0 |
| 4187 | 1 | 0 |
| 4188 | 1 | 0 |
| 4189 | 1 | 0 |
| 4190 | 1 | 0 |
| 4191 | 1 | 0 |
| 4192 | 1 | 0 |
| 4193 | 1 | 0 |
| 4194 | 1 | 0 |
| 4195 | 1 | 0 |
| 4196 | 1 | 0 |
| 4197 | 1 | 0 |
| 4198 | 1 | 0 |
| 4199 | 1 | 0 |
| 4200 | 1 | 0 |
| 4201 | 1 | 0 |
| 4202 | 1 | 0 |
| 4203 | 1 | 0 |
| 4204 | 1 | 0 |
| 4205 | 1 | 0 |
| 4206 | 1 | 0 |
| 4207 | 1 | 0 |
| 4208 | 1 | 0 |
| 4209 | 1 | 0 |
| 4210 | 1 | 0 |
| 4211 | 1 | 0 |
| 4212 | 1 | 0 |
| 4213 | 1 | 0 |
| 4214 | 1 | 0 |
| 4215 | 1 | 0 |
| 4216 | 1 | 0 |
| 4217 | 1 | 0 |
| 4218 | 1 | 0 |
| 4219 | 1 | 0 |
| 4220 | 1 | 0 |
| 4221 | 1 | 0 |
| 4222 | 1 | 0 |
| 4223 | 1 | 0 |
| 4224 | 1 | 0 |
| 4225 | 1 | 0 |
| 4226 | 1 | 0 |
| 4227 | 1 | 0 |
| 4228 | 1 | 0 |
| 4229 | 1 | 0 |
| 4230 | 1 | 0 |
| 4231 | 1 | 0 |
| 4232 | 1 | 0 |
| 4233 | 1 | 0 |
| 4234 | 1 | 0 |
| 4235 | 1 | 0 |
| 4236 | 1 | 0 |
| 4237 | 1 | 0 |
| 4238 | 1 | 0 |
| 4239 | 1 | 0 |
| 4240 | 1 | 0 |
| 4241 | 1 | 0 |
| 4242 | 1 | 0 |
| 4243 | 1 | 0 |
| 4244 | 1 | 0 |
| 4245 | 1 | 0 |
| 4246 | 1 | 0 |
| 4247 | 1 | 0 |
| 4248 | 1 | 0 |
| 4249 | 1 | 0 |
| 4250 | 1 | 0 |
| 4251 | 1 | 0 |
| 4252 | 1 | 0 |
| 4253 | 1 | 0 |
| 4254 | 1 | 0 |
| 4255 | 1 | 0 |
| 4256 | 1 | 0 |
| 4257 | 1 | 0 |
| 4258 | 1 | 0 |
| 4259 | 1 | 0 |
| 4260 | 1 | 0 |
| 4261 | 1 | 0 |
| 4262 | 1 | 0 |
| 4263 | 1 | 0 |
| 4264 | 1 | 0 |
| 4265 | 1 | 0 |
| 4266 | 1 | 0 |
| 4267 | 1 | 0 |
| 4268 | 1 | 0 |
| 4269 | 1 | 0 |
| 4270 | 1 | 0 |
| 4271 | 1 | 0 |
| 4272 | 1 | 0 |
| 4273 | 1 | 0 |
| 4274 | 1 | 0 |
| 4275 | 1 | 0 |
| 4276 | 1 | 0 |
| 4277 | 1 | 0 |
| 4278 | 1 | 0 |
| 4279 | 1 | 0 |
| 4280 | 1 | 0 |
| 4281 | 1 | 0 |
| 4282 | 1 | 0 |
| 4283 | 1 | 0 |
| 4284 | 1 | 0 |
| 4285 | 1 | 0 |
| 4286 | 1 | 0 |
| 4287 | 1 | 0 |
| 4288 | 1 | 0 |
| 4289 | 1 | 0 |
| 4290 | 1 | 0 |
| 4291 | 1 | 0 |
| 4292 | 1 | 0 |
| 4293 | 1 | 0 |
| 4294 | 1 | 0 |
| 4295 | 1 | 0 |
| 4296 | 1 | 0 |
| 4297 | 1 | 0 |
| 4298 | 1 | 0 |
| 4299 | 1 | 0 |
| 4300 | 1 | 0 |
| 4301 | 1 | 0 |
| 4302 | 1 | 0 |
| 4303 | 1 | 0 |
| 4304 | 1 | 0 |
| 4305 | 1 | 0 |
| 4306 | 1 | 0 |
| 4307 | 1 | 0 |
| 4308 | 1 | 0 |
| 4309 | 1 | 0 |
| 4310 | 1 | 0 |
| 4311 | 1 | 0 |
| 4312 | 1 | 0 |
| 4313 | 1 | 0 |
| 4314 | 1 | 0 |
| 4315 | 1 | 0 |
| 4316 | 1 | 0 |
| 4317 | 1 | 0 |
| 4318 | 1 | 0 |
| 4319 | 1 | 0 |
| 4320 | 1 | 0 |
| 4321 | 1 | 0 |
| 4322 | 1 | 0 |
| 4323 | 1 | 0 |
| 4324 | 1 | 0 |
| 4325 | 1 | 0 |
| 4326 | 1 | 0 |
| 4327 | 1 | 0 |
| 4328 | 1 | 0 |
| 4329 | 1 | 0 |
| 4330 | 1 | 0 |
| 4331 | 1 | 0 |
| 4332 | 1 | 0 |
| 4333 | 1 | 0 |
| 4334 | 1 | 0 |
| 4335 | 1 | 0 |
| 4336 | 1 | 0 |
| 4337 | 1 | 0 |
| 4338 | 1 | 0 |
| 4339 | 1 | 0 |
| 4340 | 1 | 0 |
| 4341 | 1 | 0 |
| 4342 | 1 | 0 |
| 4343 | 1 | 0 |
| 4344 | 1 | 0 |
| 4345 | 1 | 0 |
| 4346 | 1 | 0 |
| 4347 | 1 | 0 |
| 4348 | 1 | 0 |
| 4349 | 1 | 0 |
| 4350 | 1 | 0 |
| 4351 | 1 | 0 |
| 4352 | 1 | 0 |
| 4353 | 1 | 0 |
| 4354 | 1 | 0 |
| 4355 | 1 | 0 |
| 4356 | 1 | 0 |
| 4357 | 1 | 0 |
| 4358 | 1 | 0 |
| 4359 | 1 | 0 |
| 4360 | 1 | 0 |
| 4361 | 1 | 0 |
| 4362 | 1 | 0 |
| 4363 | 1 | 0 |
| 4364 | 1 | 0 |
| 4365 | 1 | 0 |
| 4366 | 1 | 0 |
| 4367 | 1 | 0 |
| 4368 | 1 | 0 |
| 4369 | 1 | 0 |
| 4370 | 1 | 0 |
| 4371 | 1 | 0 |
| 4372 | 1 | 0 |
| 4373 | 1 | 0 |
| 4374 | 1 | 0 |
| 4375 | 1 | 0 |
| 4376 | 1 | 0 |
| 4377 | 1 | 0 |
| 4378 | 1 | 0 |
| 4379 | 1 | 0 |
| 4380 | 1 | 0 |
| 4381 | 1 | 0 |
| 4382 | 1 | 0 |
| 4383 | 1 | 0 |
| 4384 | 1 | 0 |
| 4385 | 1 | 0 |
| 4386 | 1 | 0 |
| 4387 | 1 | 0 |
| 4388 | 1 | 0 |
| 4389 | 1 | 0 |
| 4390 | 1 | 0 |
| 4391 | 1 | 0 |
| 4392 | 1 | 0 |
| 4393 | 1 | 0 |
| 4394 | 1 | 0 |
| 4395 | 1 | 0 |
| 4396 | 1 | 0 |
| 4397 | 1 | 0 |
| 4398 | 1 | 0 |
| 4399 | 1 | 0 |
| 4400 | 1 | 0 |
| 4401 | 1 | 0 |
| 4402 | 1 | 0 |
| 4403 | 1 | 0 |
| 4404 | 1 | 0 |
| 4405 | 1 | 0 |
| 4406 | 1 | 0 |
| 4407 | 1 | 0 |
| 4408 | 1 | 0 |
| 4409 | 1 | 0 |
| 4410 | 1 | 0 |
| 4411 | 1 | 0 |
| 4412 | 1 | 0 |
| 4413 | 1 | 0 |
| 4414 | 1 | 0 |
| 4415 | 1 | 0 |
| 4416 | 1 | 0 |
| 4417 | 1 | 0 |
| 4418 | 1 | 0 |
| 4419 | 1 | 0 |
| 4420 | 1 | 0 |
| 4421 | 1 | 0 |
| 4422 | 1 | 0 |
| 4423 | 1 | 0 |
| 4424 | 1 | 0 |
| 4425 | 1 | 0 |
| 4426 | 1 | 0 |
| 4427 | 1 | 0 |
| 4428 | 1 | 0 |
| 4429 | 1 | 0 |
| 4430 | 1 | 0 |
| 4431 | 1 | 0 |
| 4432 | 1 | 0 |
| 4433 | 1 | 0 |
| 4434 | 1 | 0 |
| 4435 | 1 | 0 |
| 4436 | 1 | 0 |
| 4437 | 1 | 0 |
| 4438 | 1 | 0 |
| 4439 | 1 | 0 |
| 4440 | 1 | 0 |
| 4441 | 1 | 0 |
| 4442 | 1 | 0 |
| 4443 | 1 | 0 |
| 4444 | 1 | 0 |
| 4445 | 1 | 0 |
| 4446 | 1 | 0 |
| 4447 | 1 | 0 |
| 4448 | 1 | 0 |
| 4449 | 1 | 0 |
| 4450 | 1 | 0 |
| 4451 | 1 | 0 |
| 4452 | 1 | 0 |
| 4453 | 1 | 0 |
| 4454 | 1 | 0 |
| 4455 | 1 | 0 |
| 4456 | 1 | 0 |
| 4457 | 1 | 0 |
| 4458 | 1 | 0 |
| 4459 | 1 | 0 |
| 4460 | 1 | 0 |
| 4461 | 1 | 0 |
| 4462 | 1 | 0 |
| 4463 | 1 | 0 |
| 4464 | 1 | 0 |
| 4465 | 1 | 0 |
| 4466 | 1 | 0 |
| 4467 | 1 | 0 |
| 4468 | 1 | 0 |
| 4469 | 1 | 0 |
| 4470 | 1 | 0 |
| 4471 | 1 | 0 |
| 4472 | 1 | 0 |
| 4473 | 1 | 0 |
| 4474 | 1 | 0 |
| 4475 | 1 | 0 |
| 4476 | 1 | 0 |
| 4477 | 1 | 0 |
| 4478 | 1 | 0 |
| 4479 | 1 | 0 |
| 4480 | 1 | 0 |
| 4481 | 1 | 0 |
| 4482 | 1 | 0 |
| 4483 | 1 | 0 |
| 4484 | 1 | 0 |
| 4485 | 1 | 0 |
| 4486 | 1 | 0 |
| 4487 | 1 | 0 |
| 4488 | 1 | 0 |
| 4489 | 1 | 0 |
| 4490 | 1 | 0 |
| 4491 | 1 | 0 |
| 4492 | 1 | 0 |
| 4493 | 1 | 0 |
| 4494 | 1 | 0 |
| 4495 | 1 | 0 |
| 4496 | 1 | 0 |
| 4497 | 1 | 0 |
| 4498 | 1 | 0 |
| 4499 | 1 | 0 |
| 4500 | 1 | 0 |
| 4501 | 1 | 0 |
| 4502 | 1 | 0 |
| 4503 | 1 | 0 |
| 4504 | 1 | 0 |
| 4505 | 1 | 0 |
| 4506 | 1 | 0 |
| 4507 | 1 | 0 |
| 4508 | 1 | 0 |
| 4509 | 1 | 0 |
| 4510 | 1 | 0 |
| 4511 | 1 | 0 |
| 4512 | 1 | 0 |
| 4513 | 1 | 0 |
| 4514 | 1 | 0 |
| 4515 | 1 | 0 |
| 4516 | 1 | 0 |
| 4517 | 1 | 0 |
| 4518 | 1 | 0 |
| 4519 | 1 | 0 |
| 4520 | 1 | 0 |
| 4521 | 1 | 0 |
| 4522 | 1 | 0 |
| 4523 | 1 | 0 |
| 4524 | 1 | 0 |
| 4525 | 1 | 0 |
| 4526 | 1 | 0 |
| 4527 | 1 | 0 |
| 4528 | 1 | 0 |
| 4529 | 1 | 0 |
| 4530 | 1 | 0 |
| 4531 | 1 | 0 |
| 4532 | 1 | 0 |
| 4533 | 1 | 0 |
| 4534 | 1 | 0 |
| 4535 | 1 | 0 |
| 4536 | 1 | 0 |
| 4537 | 1 | 0 |
| 4538 | 1 | 0 |
| 4539 | 1 | 0 |
| 4540 | 1 | 0 |
| 4541 | 1 | 0 |
| 4542 | 1 | 0 |
| 4543 | 1 | 0 |
| 4544 | 1 | 0 |
| 4545 | 1 | 0 |
| 4546 | 1 | 0 |
| 4547 | 1 | 0 |
| 4548 | 1 | 0 |
| 4549 | 1 | 0 |
| 4550 | 1 | 0 |
| 4551 | 1 | 0 |
| 4552 | 1 | 0 |
| 4553 | 1 | 0 |
| 4554 | 1 | 0 |
| 4555 | 1 | 0 |
| 4556 | 1 | 0 |
| 4557 | 1 | 0 |
| 4558 | 1 | 0 |
| 4559 | 1 | 0 |
| 4560 | 1 | 0 |
| 4561 | 1 | 0 |
| 4562 | 1 | 0 |
| 4563 | 1 | 0 |
| 4564 | 1 | 0 |
| 4565 | 1 | 0 |
| 4566 | 1 | 0 |
| 4567 | 1 | 0 |
| 4568 | 1 | 0 |
| 4569 | 1 | 0 |
| 4570 | 1 | 0 |
| 4571 | 1 | 0 |
| 4572 | 1 | 0 |
| 4573 | 1 | 0 |
| 4574 | 1 | 0 |
| 4575 | 1 | 0 |
| 4576 | 1 | 0 |
| 4577 | 1 | 0 |
| 4578 | 1 | 0 |
| 4579 | 1 | 0 |
| 4580 | 1 | 0 |
| 4581 | 1 | 0 |
| 4582 | 1 | 0 |
| 4583 | 1 | 0 |
| 4584 | 1 | 0 |
| 4585 | 1 | 0 |
| 4586 | 1 | 0 |
| 4587 | 1 | 0 |
| 4588 | 1 | 0 |
| 4589 | 1 | 0 |
| 4590 | 1 | 0 |
| 4591 | 1 | 0 |
| 4592 | 1 | 0 |
| 4593 | 1 | 0 |
| 4594 | 1 | 0 |
| 4595 | 1 | 0 |
| 4596 | 1 | 0 |
| 4597 | 1 | 0 |
| 4598 | 1 | 0 |
| 4599 | 1 | 0 |
| 4600 | 1 | 0 |
| 4601 | 1 | 0 |
| 4602 | 1 | 0 |
| 4603 | 1 | 0 |
| 4604 | 1 | 0 |
| 4605 | 1 | 0 |
| 4606 | 1 | 0 |
| 4607 | 1 | 0 |
| 4608 | 1 | 0 |
| 4609 | 1 | 0 |
| 4610 | 1 | 0 |
| 4611 | 1 | 0 |
| 4612 | 1 | 0 |
| 4613 | 1 | 0 |
| 4614 | 1 | 0 |
| 4615 | 1 | 0 |
| 4616 | 1 | 0 |
| 4617 | 1 | 0 |
| 4618 | 1 | 0 |
| 4619 | 1 | 0 |
| 4620 | 1 | 0 |
| 4621 | 1 | 0 |
| 4622 | 1 | 0 |
| 4623 | 1 | 0 |
| 4624 | 1 | 0 |
| 4625 | 1 | 0 |
| 4626 | 1 | 0 |
| 4627 | 1 | 0 |
| 4628 | 1 | 0 |
| 4629 | 1 | 0 |
| 4630 | 1 | 0 |
| 4631 | 1 | 0 |
| 4632 | 1 | 0 |
| 4633 | 1 | 0 |
| 4634 | 1 | 0 |
| 4635 | 1 | 0 |
| 4636 | 1 | 0 |
| 4637 | 1 | 0 |
| 4638 | 1 | 0 |
| 4639 | 1 | 0 |
| 4640 | 1 | 0 |
| 4641 | 1 | 0 |
| 4642 | 1 | 0 |
| 4643 | 1 | 0 |
| 4644 | 1 | 0 |
| 4645 | 1 | 0 |
| 4646 | 1 | 0 |
| 4647 | 1 | 0 |
| 4648 | 1 | 0 |
| 4649 | 1 | 0 |
| 4650 | 1 | 0 |
| 4651 | 1 | 0 |
| 4652 | 1 | 0 |
| 4653 | 1 | 0 |
| 4654 | 1 | 0 |
| 4655 | 1 | 0 |
| 4656 | 1 | 0 |
| 4657 | 1 | 0 |
| 4658 | 1 | 0 |
| 4659 | 1 | 0 |
| 4660 | 1 | 0 |
| 4661 | 1 | 0 |
| 4662 | 1 | 0 |
| 4663 | 1 | 0 |
| 4664 | 1 | 0 |
| 4665 | 1 | 0 |
| 4666 | 1 | 0 |
| 4667 | 1 | 0 |
| 4668 | 1 | 0 |
| 4669 | 1 | 0 |
| 4670 | 1 | 0 |
| 4671 | 1 | 0 |
| 4672 | 1 | 0 |
| 4673 | 1 | 0 |
| 4674 | 1 | 0 |
| 4675 | 1 | 0 |
| 4676 | 1 | 0 |
| 4677 | 1 | 0 |
| 4678 | 1 | 0 |
| 4679 | 1 | 0 |
| 4680 | 1 | 0 |
| 4681 | 1 | 0 |
| 4682 | 1 | 0 |
| 4683 | 1 | 0 |
| 4684 | 1 | 0 |
| 4685 | 1 | 0 |
| 4686 | 1 | 0 |
| 4687 | 1 | 0 |
| 4688 | 1 | 0 |
| 4689 | 1 | 0 |
| 4690 | 1 | 0 |
| 4691 | 1 | 0 |
| 4692 | 1 | 0 |
| 4693 | 1 | 0 |
| 4694 | 1 | 0 |
| 4695 | 1 | 0 |
| 4696 | 1 | 0 |
| 4697 | 1 | 0 |
| 4698 | 1 | 0 |
| 4699 | 1 | 0 |
| 4700 | 1 | 0 |
| 4701 | 1 | 0 |
| 4702 | 1 | 0 |
| 4703 | 1 | 0 |
| 4704 | 1 | 0 |
| 4705 | 1 | 0 |
| 4706 | 1 | 0 |
| 4707 | 1 | 0 |
| 4708 | 1 | 0 |
| 4709 | 1 | 0 |
| 4710 | 1 | 0 |
| 4711 | 1 | 0 |
| 4712 | 1 | 0 |
| 4713 | 1 | 0 |
| 4714 | 1 | 0 |
| 4715 | 1 | 0 |
| 4716 | 1 | 0 |
| 4717 | 1 | 0 |
| 4718 | 1 | 0 |
| 4719 | 1 | 0 |
| 4720 | 1 | 0 |
| 4721 | 1 | 0 |
| 4722 | 1 | 0 |
| 4723 | 1 | 0 |
| 4724 | 1 | 0 |
| 4725 | 1 | 0 |
| 4726 | 1 | 0 |
| 4727 | 1 | 0 |
| 4728 | 1 | 0 |
| 4729 | 1 | 0 |
| 4730 | 1 | 0 |
| 4731 | 1 | 0 |
| 4732 | 1 | 0 |
| 4733 | 1 | 0 |
| 4734 | 1 | 0 |
| 4735 | 1 | 0 |
| 4736 | 1 | 0 |
| 4737 | 1 | 0 |
| 4738 | 1 | 0 |
| 4739 | 1 | 0 |
| 4740 | 1 | 0 |
| 4741 | 1 | 0 |
| 4742 | 1 | 0 |
| 4743 | 1 | 0 |
| 4744 | 1 | 0 |
| 4745 | 1 | 0 |
| 4746 | 1 | 0 |
| 4747 | 1 | 0 |
| 4748 | 1 | 0 |
| 4749 | 1 | 0 |
| 4750 | 1 | 0 |
| 4751 | 1 | 0 |
| 4752 | 1 | 0 |
| 4753 | 1 | 0 |
| 4754 | 1 | 0 |
| 4755 | 1 | 0 |
| 4756 | 1 | 0 |
| 4757 | 1 | 0 |
| 4758 | 1 | 0 |
| 4759 | 1 | 0 |
| 4760 | 1 | 0 |
| 4761 | 1 | 0 |
| 4762 | 1 | 0 |
| 4763 | 1 | 0 |
| 4764 | 1 | 0 |
| 4765 | 1 | 0 |
| 4766 | 1 | 0 |
| 4767 | 1 | 0 |
| 4768 | 1 | 0 |
| 4769 | 1 | 0 |
| 4770 | 1 | 0 |
| 4771 | 1 | 0 |
| 4772 | 1 | 0 |
| 4773 | 1 | 0 |
| 4774 | 1 | 0 |
| 4775 | 1 | 0 |
| 4776 | 1 | 0 |
| 4777 | 1 | 0 |
| 4778 | 1 | 0 |
| 4779 | 1 | 0 |
| 4780 | 1 | 0 |
| 4781 | 1 | 0 |
| 4782 | 1 | 0 |
| 4783 | 1 | 0 |
| 4784 | 1 | 0 |
| 4785 | 1 | 0 |
| 4786 | 1 | 0 |
| 4787 | 1 | 0 |
| 4788 | 1 | 0 |
| 4789 | 1 | 0 |
| 4790 | 1 | 0 |
| 4791 | 1 | 0 |
| 4792 | 1 | 0 |
| 4793 | 1 | 0 |
| 4794 | 1 | 0 |
| 4795 | 1 | 0 |
| 4796 | 1 | 0 |
| 4797 | 1 | 0 |
| 4798 | 1 | 0 |
| 4799 | 1 | 0 |
| 4800 | 1 | 0 |
| 4801 | 1 | 0 |
| 4802 | 1 | 0 |
| 4803 | 1 | 0 |
| 4804 | 1 | 0 |
| 4805 | 1 | 0 |
| 4806 | 1 | 0 |
| 4807 | 1 | 0 |
| 4808 | 1 | 0 |
| 4809 | 1 | 0 |
| 4810 | 1 | 0 |
| 4811 | 1 | 0 |
| 4812 | 1 | 0 |
| 4813 | 1 | 0 |
| 4814 | 1 | 0 |
| 4815 | 1 | 0 |
| 4816 | 1 | 0 |
| 4817 | 1 | 0 |
| 4818 | 1 | 0 |
| 4819 | 1 | 0 |
| 4820 | 1 | 0 |
| 4821 | 1 | 0 |
| 4822 | 1 | 0 |
| 4823 | 1 | 0 |
| 4824 | 1 | 0 |
| 4825 | 1 | 0 |
| 4826 | 1 | 0 |
| 4827 | 1 | 0 |
| 4828 | 1 | 0 |
| 4829 | 1 | 0 |
| 4830 | 1 | 0 |
| 4831 | 1 | 0 |
| 4832 | 1 | 0 |
| 4833 | 1 | 0 |
| 4834 | 1 | 0 |
| 4835 | 1 | 0 |
| 4836 | 1 | 0 |
| 4837 | 1 | 0 |
| 4838 | 1 | 0 |
| 4839 | 1 | 0 |
| 4840 | 1 | 0 |
| 4841 | 1 | 0 |
| 4842 | 1 | 0 |
| 4843 | 1 | 0 |
| 4844 | 1 | 0 |
| 4845 | 1 | 0 |
| 4846 | 1 | 0 |
| 4847 | 1 | 0 |
| 4848 | 1 | 0 |
| 4849 | 1 | 0 |
| 4850 | 1 | 0 |
| 4851 | 1 | 0 |
| 4852 | 1 | 0 |
| 4853 | 1 | 0 |
| 4854 | 1 | 0 |
| 4855 | 1 | 0 |
| 4856 | 1 | 0 |
| 4857 | 1 | 0 |
| 4858 | 1 | 0 |
| 4859 | 1 | 0 |
| 4860 | 1 | 0 |
| 4861 | 1 | 0 |
| 4862 | 1 | 0 |
| 4863 | 1 | 0 |
| 4864 | 1 | 0 |
| 4865 | 1 | 0 |
| 4866 | 1 | 0 |
| 4867 | 1 | 0 |
| 4868 | 1 | 0 |
| 4869 | 1 | 0 |
| 4870 | 1 | 0 |
| 4871 | 1 | 0 |
| 4872 | 1 | 0 |
| 4873 | 1 | 0 |
| 4874 | 1 | 0 |
| 4875 | 1 | 0 |
| 4876 | 1 | 0 |
| 4877 | 1 | 0 |
| 4878 | 1 | 0 |
| 4879 | 1 | 0 |
| 4880 | 1 | 0 |
| 4881 | 1 | 0 |
| 4882 | 1 | 0 |
| 4883 | 1 | 0 |
| 4884 | 1 | 0 |
| 4885 | 1 | 0 |
| 4886 | 1 | 0 |
| 4887 | 1 | 0 |
| 4888 | 1 | 0 |
| 4889 | 1 | 0 |
| 4890 | 1 | 0 |
| 4891 | 1 | 0 |
| 4892 | 1 | 0 |
| 4893 | 1 | 0 |
| 4894 | 1 | 0 |
| 4895 | 1 | 0 |
| 4896 | 1 | 0 |
| 4897 | 1 | 0 |
| 4898 | 1 | 0 |
| 4899 | 1 | 0 |
| 4900 | 1 | 0 |
| 4901 | 1 | 0 |
| 4902 | 1 | 0 |
| 4903 | 1 | 0 |
| 4904 | 1 | 0 |
| 4905 | 1 | 0 |
| 4906 | 1 | 0 |
| 4907 | 1 | 0 |
| 4908 | 1 | 0 |
| 4909 | 1 | 0 |
| 4910 | 1 | 0 |
| 4911 | 1 | 0 |
| 4912 | 1 | 0 |
| 4913 | 1 | 0 |
| 4914 | 1 | 0 |
| 4915 | 1 | 0 |
| 4916 | 1 | 0 |
| 4917 | 1 | 0 |
| 4918 | 1 | 0 |
| 4919 | 1 | 0 |
| 4920 | 1 | 0 |
| 4921 | 1 | 0 |
| 4922 | 1 | 0 |
| 4923 | 1 | 0 |
| 4924 | 1 | 0 |
| 4925 | 1 | 0 |
| 4926 | 1 | 0 |
| 4927 | 1 | 0 |
| 4928 | 1 | 0 |
| 4929 | 1 | 0 |
| 4930 | 1 | 0 |
| 4931 | 1 | 0 |
| 4932 | 1 | 0 |
| 4933 | 1 | 0 |
| 4934 | 1 | 0 |
| 4935 | 1 | 0 |
| 4936 | 1 | 0 |
| 4937 | 1 | 0 |
| 4938 | 1 | 0 |
| 4939 | 1 | 0 |
| 4940 | 1 | 0 |
| 4941 | 1 | 0 |
| 4942 | 1 | 0 |
| 4943 | 1 | 0 |
| 4944 | 1 | 0 |
| 4945 | 1 | 0 |
| 4946 | 1 | 0 |
| 4947 | 1 | 0 |
| 4948 | 1 | 0 |
| 4949 | 1 | 0 |
| 4950 | 1 | 0 |
| 4951 | 1 | 0 |
| 4952 | 1 | 0 |
| 4953 | 1 | 0 |
| 4954 | 1 | 0 |
| 4955 | 1 | 0 |
| 4956 | 1 | 0 |
| 4957 | 1 | 0 |
| 4958 | 1 | 0 |
| 4959 | 1 | 0 |
| 4960 | 1 | 0 |
| 4961 | 1 | 0 |
| 4962 | 1 | 0 |
| 4963 | 1 | 0 |
| 4964 | 1 | 0 |
| 4965 | 1 | 0 |
| 4966 | 1 | 0 |
| 4967 | 1 | 0 |
| 4968 | 1 | 0 |
| 4969 | 1 | 0 |
| 4970 | 1 | 0 |
| 4971 | 1 | 0 |
| 4972 | 1 | 0 |
| 4973 | 1 | 0 |
| 4974 | 1 | 0 |
| 4975 | 1 | 0 |
| 4976 | 1 | 0 |
| 4977 | 1 | 0 |
| 4978 | 1 | 0 |
| 4979 | 1 | 0 |
| 4980 | 1 | 0 |
| 4981 | 1 | 0 |
| 4982 | 1 | 0 |
| 4983 | 1 | 0 |
| 4984 | 1 | 0 |
| 4985 | 1 | 0 |
| 4986 | 1 | 0 |
| 4987 | 1 | 0 |
| 4988 | 1 | 0 |
| 4989 | 1 | 0 |
| 4990 | 1 | 0 |
| 4991 | 1 | 0 |
| 4992 | 1 | 0 |
| 4993 | 1 | 0 |
| 4994 | 1 | 0 |
| 4995 | 1 | 0 |
| 4996 | 1 | 0 |
| 4997 | 1 | 0 |
| 4998 | 1 | 0 |
| 4999 | 1 | 0 |
| 5000 | 1 | 0 |
| 5001 | 1 | 0 |
| 5002 | 1 | 0 |
| 5003 | 1 | 0 |
| 5004 | 1 | 0 |
| 5005 | 1 | 0 |
| 5006 | 1 | 0 |
| 5007 | 1 | 0 |
| 5008 | 1 | 0 |
| 5009 | 1 | 0 |
| 5010 | 1 | 0 |
| 5011 | 1 | 0 |
| 5012 | 1 | 0 |
| 5013 | 1 | 0 |
| 5014 | 1 | 0 |
| 5015 | 1 | 0 |
| 5016 | 1 | 0 |
| 5017 | 1 | 0 |
| 5018 | 1 | 0 |
| 5019 | 1 | 0 |
| 5020 | 1 | 0 |
| 5021 | 1 | 0 |
| 5022 | 1 | 0 |
| 5023 | 1 | 0 |
| 5024 | 1 | 0 |
| 5025 | 1 | 0 |
| 5026 | 1 | 0 |
| 5027 | 1 | 0 |
| 5028 | 1 | 0 |
| 5029 | 1 | 0 |
| 5030 | 1 | 0 |
| 5031 | 1 | 0 |
| 5032 | 1 | 0 |
| 5033 | 1 | 0 |
| 5034 | 1 | 0 |
| 5035 | 1 | 0 |
| 5036 | 1 | 0 |
| 5037 | 1 | 0 |
| 5038 | 1 | 0 |
| 5039 | 1 | 0 |
| 5040 | 1 | 0 |
| 5041 | 1 | 0 |
| 5042 | 1 | 0 |
| 5043 | 1 | 0 |
| 5044 | 1 | 0 |
| 5045 | 1 | 0 |
| 5046 | 1 | 0 |
| 5047 | 1 | 0 |
| 5048 | 1 | 0 |
| 5049 | 1 | 0 |
| 5050 | 1 | 0 |
| 5051 | 1 | 0 |
| 5052 | 1 | 0 |
| 5053 | 1 | 0 |
| 5054 | 1 | 0 |
| 5055 | 1 | 0 |
| 5056 | 1 | 0 |
| 5057 | 1 | 0 |
| 5058 | 1 | 0 |
| 5059 | 1 | 0 |
| 5060 | 1 | 0 |
| 5061 | 1 | 0 |
| 5062 | 1 | 0 |
| 5063 | 1 | 0 |
| 5064 | 1 | 0 |
| 5065 | 1 | 0 |
| 5066 | 1 | 0 |
| 5067 | 1 | 0 |
| 5068 | 1 | 0 |
| 5069 | 1 | 0 |
| 5070 | 1 | 0 |
| 5071 | 1 | 0 |
| 5072 | 1 | 0 |
| 5073 | 1 | 0 |
| 5074 | 1 | 0 |
| 5075 | 1 | 0 |
| 5076 | 1 | 0 |
| 5077 | 1 | 0 |
| 5078 | 1 | 0 |
| 5079 | 1 | 0 |
| 5080 | 1 | 0 |
| 5081 | 1 | 0 |
| 5082 | 1 | 0 |
| 5083 | 1 | 0 |
| 5084 | 1 | 0 |
| 5085 | 1 | 0 |
| 5086 | 1 | 0 |
| 5087 | 1 | 0 |
| 5088 | 1 | 0 |
| 5089 | 1 | 0 |
| 5090 | 1 | 0 |
| 5091 | 1 | 0 |
| 5092 | 1 | 0 |
| 5093 | 1 | 0 |
| 5094 | 1 | 0 |
| 5095 | 1 | 0 |
| 5096 | 1 | 0 |
| 5097 | 1 | 0 |
| 5098 | 1 | 0 |
| 5099 | 1 | 0 |
| 5100 | 1 | 0 |
| 5101 | 1 | 0 |
| 5102 | 1 | 0 |
| 5103 | 1 | 0 |
| 5104 | 1 | 0 |
| 5105 | 1 | 0 |
| 5106 | 1 | 0 |
| 5107 | 1 | 0 |
| 5108 | 1 | 0 |
| 5109 | 1 | 0 |
| 5110 | 1 | 0 |
| 5111 | 1 | 0 |
| 5112 | 1 | 0 |
| 5113 | 1 | 0 |
| 5114 | 1 | 0 |
| 5115 | 1 | 0 |
| 5116 | 1 | 0 |
| 5117 | 1 | 0 |
| 5118 | 1 | 0 |
| 5119 | 1 | 0 |
| 5120 | 1 | 0 |
| 5121 | 1 | 0 |
| 5122 | 1 | 0 |
| 5123 | 1 | 0 |
| 5124 | 1 | 0 |
| 5125 | 1 | 0 |
| 5126 | 1 | 0 |
| 5127 | 1 | 0 |
| 5128 | 1 | 0 |
| 5129 | 1 | 0 |
| 5130 | 1 | 0 |
| 5131 | 1 | 0 |
| 5132 | 1 | 0 |
| 5133 | 1 | 0 |
| 5134 | 1 | 0 |
| 5135 | 1 | 0 |
| 5136 | 1 | 0 |
| 5137 | 1 | 0 |
| 5138 | 1 | 0 |
| 5139 | 1 | 0 |
| 5140 | 1 | 0 |
| 5141 | 1 | 0 |
| 5142 | 1 | 0 |
| 5143 | 1 | 0 |
| 5144 | 1 | 0 |
| 5145 | 1 | 0 |
| 5146 | 1 | 0 |
| 5147 | 1 | 0 |
| 5148 | 1 | 0 |
| 5149 | 1 | 0 |
| 5150 | 1 | 0 |
| 5151 | 1 | 0 |
| 5152 | 1 | 0 |
| 5153 | 1 | 0 |
| 5154 | 1 | 0 |
| 5155 | 1 | 0 |
| 5156 | 1 | 0 |
| 5157 | 1 | 0 |
| 5158 | 1 | 0 |
| 5159 | 1 | 0 |
| 5160 | 1 | 0 |
| 5161 | 1 | 0 |
| 5162 | 1 | 0 |
| 5163 | 1 | 0 |
| 5164 | 1 | 0 |
| 5165 | 1 | 0 |
| 5166 | 1 | 0 |
| 5167 | 1 | 0 |
| 5168 | 1 | 0 |
| 5169 | 1 | 0 |
| 5170 | 1 | 0 |
| 5171 | 1 | 0 |
| 5172 | 1 | 0 |
| 5173 | 1 | 0 |
| 5174 | 1 | 0 |
| 5175 | 1 | 0 |
| 5176 | 1 | 0 |
| 5177 | 1 | 0 |
| 5178 | 1 | 0 |
| 5179 | 1 | 0 |
| 5180 | 1 | 0 |
| 5181 | 1 | 0 |
| 5182 | 1 | 0 |
| 5183 | 1 | 0 |
| 5184 | 1 | 0 |
| 5185 | 1 | 0 |
| 5186 | 1 | 0 |
| 5187 | 1 | 0 |
| 5188 | 1 | 0 |
| 5189 | 1 | 0 |
| 5190 | 1 | 0 |
| 5191 | 1 | 0 |
| 5192 | 1 | 0 |
| 5193 | 1 | 0 |
| 5194 | 1 | 0 |
| 5195 | 1 | 0 |
| 5196 | 1 | 0 |
| 5197 | 1 | 0 |
| 5198 | 1 | 0 |
| 5199 | 1 | 0 |
| 5200 | 1 | 0 |
| 5201 | 1 | 0 |
| 5202 | 1 | 0 |
| 5203 | 1 | 0 |
| 5204 | 1 | 0 |
| 5205 | 1 | 0 |
| 5206 | 1 | 0 |
| 5207 | 1 | 0 |
| 5208 | 1 | 0 |
| 5209 | 1 | 0 |
| 5210 | 1 | 0 |
| 5211 | 1 | 0 |
| 5212 | 1 | 0 |
| 5213 | 1 | 0 |
| 5214 | 1 | 0 |
| 5215 | 1 | 0 |
| 5216 | 1 | 0 |
| 5217 | 1 | 0 |
| 5218 | 1 | 0 |
| 5219 | 1 | 0 |
| 5220 | 1 | 0 |
| 5221 | 1 | 0 |
| 5222 | 1 | 0 |
| 5223 | 1 | 0 |
| 5224 | 1 | 0 |
| 5225 | 1 | 0 |
| 5226 | 1 | 0 |
| 5227 | 1 | 0 |
| 5228 | 1 | 0 |
| 5229 | 1 | 0 |
| 5230 | 1 | 0 |
| 5231 | 1 | 0 |
| 5232 | 1 | 0 |
| 5233 | 1 | 0 |
| 5234 | 1 | 0 |
| 5235 | 1 | 0 |
| 5236 | 1 | 0 |
| 5237 | 1 | 0 |
| 5238 | 1 | 0 |
| 5239 | 1 | 0 |
| 5240 | 1 | 0 |
| 5241 | 1 | 0 |
| 5242 | 1 | 0 |
| 5243 | 1 | 0 |
| 5244 | 1 | 0 |
| 5245 | 1 | 0 |
| 5246 | 1 | 0 |
| 5247 | 1 | 0 |
| 5248 | 1 | 0 |
| 5249 | 1 | 0 |
| 5250 | 1 | 0 |
| 5251 | 1 | 0 |
| 5252 | 1 | 0 |
| 5253 | 1 | 0 |
| 5254 | 1 | 0 |
| 5255 | 1 | 0 |
| 5256 | 1 | 0 |
| 5257 | 1 | 0 |
| 5258 | 1 | 0 |
| 5259 | 1 | 0 |
| 5260 | 1 | 0 |
| 5261 | 1 | 0 |
| 5262 | 1 | 0 |
| 5263 | 1 | 0 |
| 5264 | 1 | 0 |
| 5265 | 1 | 0 |
| 5266 | 1 | 0 |
| 5267 | 1 | 0 |
| 5268 | 1 | 0 |
| 5269 | 1 | 0 |
| 5270 | 1 | 0 |
| 5271 | 1 | 0 |
| 5272 | 1 | 0 |
| 5273 | 1 | 0 |
| 5274 | 1 | 0 |
| 5275 | 1 | 0 |
| 5276 | 1 | 0 |
| 5277 | 1 | 0 |
| 5278 | 1 | 0 |
| 5279 | 1 | 0 |
| 5280 | 1 | 0 |
| 5281 | 1 | 0 |
| 5282 | 1 | 0 |
| 5283 | 1 | 0 |
| 5284 | 1 | 0 |
| 5285 | 1 | 0 |
| 5286 | 1 | 0 |
| 5287 | 1 | 0 |
| 5288 | 1 | 0 |
| 5289 | 1 | 0 |
| 5290 | 1 | 0 |
| 5291 | 1 | 0 |
| 5292 | 1 | 0 |
| 5293 | 1 | 0 |
| 5294 | 1 | 0 |
| 5295 | 1 | 0 |
| 5296 | 1 | 0 |
| 5297 | 1 | 0 |
| 5298 | 1 | 0 |
| 5299 | 1 | 0 |
| 5300 | 1 | 0 |
| 5301 | 1 | 0 |
| 5302 | 1 | 0 |
| 5303 | 1 | 0 |
| 5304 | 1 | 0 |
| 5305 | 1 | 0 |
| 5306 | 1 | 0 |
| 5307 | 1 | 0 |
| 5308 | 1 | 0 |
| 5309 | 1 | 0 |
| 5310 | 1 | 0 |
| 5311 | 1 | 0 |
| 5312 | 1 | 0 |
| 5313 | 1 | 0 |
| 5314 | 1 | 0 |
| 5315 | 1 | 0 |
| 5316 | 1 | 0 |
| 5317 | 1 | 0 |
| 5318 | 1 | 0 |
| 5319 | 1 | 0 |
| 5320 | 1 | 0 |
| 5321 | 1 | 0 |
| 5322 | 1 | 0 |
| 5323 | 1 | 0 |
| 5324 | 1 | 0 |
| 5325 | 1 | 0 |
| 5326 | 1 | 0 |
| 5327 | 1 | 0 |
| 5328 | 1 | 0 |
| 5329 | 1 | 0 |
| 5330 | 1 | 0 |
| 5331 | 1 | 0 |
| 5332 | 1 | 0 |
| 5333 | 1 | 0 |
| 5334 | 1 | 0 |
| 5335 | 1 | 0 |
| 5336 | 1 | 0 |
| 5337 | 1 | 0 |
| 5338 | 1 | 0 |
| 5339 | 1 | 0 |
| 5340 | 1 | 0 |
| 5341 | 1 | 0 |
| 5342 | 1 | 0 |
| 5343 | 1 | 0 |
| 5344 | 1 | 0 |
| 5345 | 1 | 0 |
| 5346 | 1 | 0 |
| 5347 | 1 | 0 |
| 5348 | 1 | 0 |
| 5349 | 1 | 0 |
| 5350 | 1 | 0 |
| 5351 | 1 | 0 |
| 5352 | 1 | 0 |
| 5353 | 1 | 0 |
| 5354 | 1 | 0 |
| 5355 | 1 | 0 |
| 5356 | 1 | 0 |
| 5357 | 1 | 0 |
| 5358 | 1 | 0 |
| 5359 | 1 | 0 |
| 5360 | 1 | 0 |
| 5361 | 1 | 0 |
| 5362 | 1 | 0 |
| 5363 | 1 | 0 |
| 5364 | 1 | 0 |
| 5365 | 1 | 0 |
| 5366 | 1 | 0 |
| 5367 | 1 | 0 |
| 5368 | 1 | 0 |
| 5369 | 1 | 0 |
| 5370 | 1 | 0 |
| 5371 | 1 | 0 |
| 5372 | 1 | 0 |
| 5373 | 1 | 0 |
| 5374 | 1 | 0 |
| 5375 | 1 | 0 |
| 5376 | 1 | 0 |
| 5377 | 1 | 0 |
| 5378 | 1 | 0 |
| 5379 | 1 | 0 |
| 5380 | 1 | 0 |
| 5381 | 1 | 0 |
| 5382 | 1 | 0 |
| 5383 | 1 | 0 |
| 5384 | 1 | 0 |
| 5385 | 1 | 0 |
| 5386 | 1 | 0 |
| 5387 | 1 | 0 |
| 5388 | 1 | 0 |
| 5389 | 1 | 0 |
| 5390 | 1 | 0 |
| 5391 | 1 | 0 |
| 5392 | 1 | 0 |
| 5393 | 1 | 0 |
| 5394 | 1 | 0 |
| 5395 | 1 | 0 |
| 5396 | 1 | 0 |
| 5397 | 1 | 0 |
| 5398 | 1 | 0 |
| 5399 | 1 | 0 |
| 5400 | 1 | 0 |
| 5401 | 1 | 0 |
| 5402 | 1 | 0 |
| 5403 | 1 | 0 |
| 5404 | 1 | 0 |
| 5405 | 1 | 0 |
| 5406 | 1 | 0 |
| 5407 | 1 | 0 |
| 5408 | 1 | 0 |
| 5409 | 1 | 0 |
| 5410 | 1 | 0 |
| 5411 | 1 | 0 |
| 5412 | 1 | 0 |
| 5413 | 1 | 0 |
| 5414 | 1 | 0 |
| 5415 | 1 | 0 |
| 5416 | 1 | 0 |
| 5417 | 1 | 0 |
| 5418 | 1 | 0 |
| 5419 | 1 | 0 |
| 5420 | 1 | 0 |
| 5421 | 1 | 0 |
| 5422 | 1 | 0 |
| 5423 | 1 | 0 |
| 5424 | 1 | 0 |
| 5425 | 1 | 0 |
| 5426 | 1 | 0 |
| 5427 | 1 | 0 |
| 5428 | 1 | 0 |
| 5429 | 1 | 0 |
| 5430 | 1 | 0 |
| 5431 | 1 | 0 |
| 5432 | 1 | 0 |
| 5433 | 1 | 0 |
| 5434 | 1 | 0 |
| 5435 | 1 | 0 |
| 5436 | 1 | 0 |
| 5437 | 1 | 0 |
| 5438 | 1 | 0 |
| 5439 | 1 | 0 |
| 5440 | 1 | 0 |
| 5441 | 1 | 0 |
| 5442 | 1 | 0 |
| 5443 | 1 | 0 |
| 5444 | 1 | 0 |
| 5445 | 1 | 0 |
| 5446 | 1 | 0 |
| 5447 | 1 | 0 |
| 5448 | 1 | 0 |
| 5449 | 1 | 0 |
| 5450 | 1 | 0 |
| 5451 | 1 | 0 |
| 5452 | 1 | 0 |
| 5453 | 1 | 0 |
| 5454 | 1 | 0 |
| 5455 | 1 | 0 |
| 5456 | 1 | 0 |
| 5457 | 1 | 0 |
| 5458 | 1 | 0 |
| 5459 | 1 | 0 |
| 5460 | 1 | 0 |
| 5461 | 1 | 0 |
| 5462 | 1 | 0 |
| 5463 | 1 | 0 |
| 5464 | 1 | 0 |
| 5465 | 1 | 0 |
| 5466 | 1 | 0 |
| 5467 | 1 | 0 |
| 5468 | 1 | 0 |
| 5469 | 1 | 0 |
| 5470 | 1 | 0 |
| 5471 | 1 | 0 |
| 5472 | 1 | 0 |
| 5473 | 1 | 0 |
| 5474 | 1 | 0 |
| 5475 | 1 | 0 |
| 5476 | 1 | 0 |
| 5477 | 1 | 0 |
| 5478 | 1 | 0 |
| 5479 | 1 | 0 |
| 5480 | 1 | 0 |
| 5481 | 1 | 0 |
| 5482 | 1 | 0 |
| 5483 | 1 | 0 |
| 5484 | 1 | 0 |
| 5485 | 1 | 0 |
| 5486 | 1 | 0 |
| 5487 | 1 | 0 |
| 5488 | 1 | 0 |
| 5489 | 1 | 0 |
| 5490 | 1 | 0 |
| 5491 | 1 | 0 |
| 5492 | 1 | 0 |
| 5493 | 1 | 0 |
| 5494 | 1 | 0 |
| 5495 | 1 | 0 |
| 5496 | 1 | 0 |
| 5497 | 1 | 0 |
| 5498 | 1 | 0 |
| 5499 | 1 | 0 |
| 5500 | 1 | 0 |
| 5501 | 1 | 0 |
| 5502 | 1 | 0 |
| 5503 | 1 | 0 |
| 5504 | 1 | 0 |
| 5505 | 1 | 0 |
| 5506 | 1 | 0 |
| 5507 | 1 | 0 |
| 5508 | 1 | 0 |
| 5509 | 1 | 0 |
| 5510 | 1 | 0 |
| 5511 | 1 | 0 |
| 5512 | 1 | 0 |
| 5513 | 1 | 0 |
| 5514 | 1 | 0 |
| 5515 | 1 | 0 |
| 5516 | 1 | 0 |
| 5517 | 1 | 0 |
| 5518 | 1 | 0 |
| 5519 | 1 | 0 |
| 5520 | 1 | 0 |
| 5521 | 1 | 0 |
| 5522 | 1 | 0 |
| 5523 | 1 | 0 |
| 5524 | 1 | 0 |
| 5525 | 1 | 0 |
| 5526 | 1 | 0 |
| 5527 | 1 | 0 |
| 5528 | 1 | 0 |
| 5529 | 1 | 0 |
| 5530 | 1 | 0 |
| 5531 | 1 | 0 |
| 5532 | 1 | 0 |
| 5533 | 1 | 0 |
| 5534 | 1 | 0 |
| 5535 | 1 | 0 |
| 5536 | 1 | 0 |
| 5537 | 1 | 0 |
| 5538 | 1 | 0 |
| 5539 | 1 | 0 |
| 5540 | 1 | 0 |
| 5541 | 1 | 0 |
| 5542 | 1 | 0 |
| 5543 | 1 | 0 |
| 5544 | 1 | 0 |
| 5545 | 1 | 0 |
| 5546 | 1 | 0 |
| 5547 | 1 | 0 |
| 5548 | 1 | 0 |
| 5549 | 1 | 0 |
| 5550 | 1 | 0 |
| 5551 | 1 | 0 |
| 5552 | 1 | 0 |
| 5553 | 1 | 0 |
| 5554 | 1 | 0 |
| 5555 | 1 | 0 |
| 5556 | 1 | 0 |
| 5557 | 1 | 0 |
| 5558 | 1 | 0 |
| 5559 | 1 | 0 |
| 5560 | 1 | 0 |
| 5561 | 1 | 0 |
| 5562 | 1 | 0 |
| 5563 | 1 | 0 |
| 5564 | 1 | 0 |
| 5565 | 1 | 0 |
| 5566 | 1 | 0 |
| 5567 | 1 | 0 |
| 5568 | 1 | 0 |
| 5569 | 1 | 0 |
| 5570 | 1 | 0 |
| 5571 | 1 | 0 |
| 5572 | 1 | 0 |
| 5573 | 1 | 0 |
| 5574 | 1 | 0 |
| 5575 | 1 | 0 |
| 5576 | 1 | 0 |
| 5577 | 1 | 0 |
| 5578 | 1 | 0 |
| 5579 | 1 | 0 |
| 5580 | 1 | 0 |
| 5581 | 1 | 0 |
| 5582 | 1 | 0 |
| 5583 | 1 | 0 |
| 5584 | 1 | 0 |
| 5585 | 1 | 0 |
| 5586 | 1 | 0 |
| 5587 | 1 | 0 |
| 5588 | 1 | 0 |
| 5589 | 1 | 0 |
| 5590 | 1 | 0 |
| 5591 | 1 | 0 |
| 5592 | 1 | 0 |
| 5593 | 1 | 0 |
| 5594 | 1 | 0 |
| 5595 | 1 | 0 |
| 5596 | 1 | 0 |
| 5597 | 1 | 0 |
| 5598 | 1 | 0 |
| 5599 | 1 | 0 |
| 5600 | 1 | 0 |
| 5601 | 1 | 0 |
| 5602 | 1 | 0 |
| 5603 | 1 | 0 |
| 5604 | 1 | 0 |
| 5605 | 1 | 0 |
| 5606 | 1 | 0 |
| 5607 | 1 | 0 |
| 5608 | 1 | 0 |
| 5609 | 1 | 0 |
| 5610 | 1 | 0 |
| 5611 | 1 | 0 |
| 5612 | 1 | 0 |
| 5613 | 1 | 0 |
| 5614 | 1 | 0 |
| 5615 | 1 | 0 |
| 5616 | 1 | 0 |
| 5617 | 1 | 0 |
| 5618 | 1 | 0 |
| 5619 | 1 | 0 |
| 5620 | 1 | 0 |
| 5621 | 1 | 0 |
| 5622 | 1 | 0 |
| 5623 | 1 | 0 |
| 5624 | 1 | 0 |
| 5625 | 1 | 0 |
| 5626 | 1 | 0 |
| 5627 | 1 | 0 |
| 5628 | 1 | 0 |
| 5629 | 1 | 0 |
| 5630 | 1 | 0 |
| 5631 | 1 | 0 |
| 5632 | 1 | 0 |
| 5633 | 1 | 0 |
| 5634 | 1 | 0 |
| 5635 | 1 | 0 |
| 5636 | 1 | 0 |
| 5637 | 1 | 0 |
| 5638 | 1 | 0 |
| 5639 | 1 | 0 |
| 5640 | 1 | 0 |
| 5641 | 1 | 0 |
| 5642 | 1 | 0 |
| 5643 | 1 | 0 |
| 5644 | 1 | 0 |
| 5645 | 1 | 0 |
| 5646 | 1 | 0 |
| 5647 | 1 | 0 |
| 5648 | 1 | 0 |
| 5649 | 1 | 0 |
| 5650 | 1 | 0 |
| 5651 | 1 | 0 |
| 5652 | 1 | 0 |
| 5653 | 1 | 0 |
| 5654 | 1 | 0 |
| 5655 | 1 | 0 |
| 5656 | 1 | 0 |
| 5657 | 1 | 0 |
| 5658 | 1 | 0 |
| 5659 | 1 | 0 |
| 5660 | 1 | 0 |
| 5661 | 1 | 0 |
| 5662 | 1 | 0 |
| 5663 | 1 | 0 |
| 5664 | 1 | 0 |
| 5665 | 1 | 0 |
| 5666 | 1 | 0 |
| 5667 | 1 | 0 |
| 5668 | 1 | 0 |
| 5669 | 1 | 0 |
| 5670 | 1 | 0 |
| 5671 | 1 | 0 |
| 5672 | 1 | 0 |
| 5673 | 1 | 0 |
| 5674 | 1 | 0 |
| 5675 | 1 | 0 |
| 5676 | 1 | 0 |
| 5677 | 1 | 0 |
| 5678 | 1 | 0 |
| 5679 | 1 | 0 |
| 5680 | 1 | 0 |
| 5681 | 1 | 0 |
| 5682 | 1 | 0 |
| 5683 | 1 | 0 |
| 5684 | 1 | 0 |
| 5685 | 1 | 0 |
| 5686 | 1 | 0 |
| 5687 | 1 | 0 |
| 5688 | 1 | 0 |
| 5689 | 1 | 0 |
| 5690 | 1 | 0 |
| 5691 | 1 | 0 |
| 5692 | 1 | 0 |
| 5693 | 1 | 0 |
| 5694 | 1 | 0 |
| 5695 | 1 | 0 |
| 5696 | 1 | 0 |
| 5697 | 1 | 0 |
| 5698 | 1 | 0 |
| 5699 | 1 | 0 |
| 5700 | 1 | 0 |
| 5701 | 1 | 0 |
| 5702 | 1 | 0 |
| 5703 | 1 | 0 |
| 5704 | 1 | 0 |
| 5705 | 1 | 0 |
| 5706 | 1 | 0 |
| 5707 | 1 | 0 |
| 5708 | 1 | 0 |
| 5709 | 1 | 0 |
| 5710 | 1 | 0 |
| 5711 | 1 | 0 |
| 5712 | 1 | 0 |
| 5713 | 1 | 0 |
| 5714 | 1 | 0 |
| 5715 | 1 | 0 |
| 5716 | 1 | 0 |
| 5717 | 1 | 0 |
| 5718 | 1 | 0 |
| 5719 | 1 | 0 |
| 5720 | 1 | 0 |
| 5721 | 1 | 0 |
| 5722 | 1 | 0 |
| 5723 | 1 | 0 |
| 5724 | 1 | 0 |
| 5725 | 1 | 0 |
| 5726 | 1 | 0 |
| 5727 | 1 | 0 |
| 5728 | 1 | 0 |
| 5729 | 1 | 0 |
| 5730 | 1 | 0 |
| 5731 | 1 | 0 |
| 5732 | 1 | 0 |
| 5733 | 1 | 0 |
| 5734 | 1 | 0 |
| 5735 | 1 | 0 |
| 5736 | 1 | 0 |
| 5737 | 1 | 0 |
| 5738 | 1 | 0 |
| 5739 | 1 | 0 |
| 5740 | 1 | 0 |
| 5741 | 1 | 0 |
| 5742 | 1 | 0 |
| 5743 | 1 | 0 |
| 5744 | 1 | 0 |
| 5745 | 1 | 0 |
| 5746 | 1 | 0 |
| 5747 | 1 | 0 |
| 5748 | 1 | 0 |
| 5749 | 1 | 0 |
| 5750 | 1 | 0 |
| 5751 | 1 | 0 |
| 5752 | 1 | 0 |
| 5753 | 1 | 0 |
| 5754 | 1 | 0 |
| 5755 | 1 | 0 |
| 5756 | 1 | 0 |
| 5757 | 1 | 0 |
| 5758 | 1 | 0 |
| 5759 | 1 | 0 |
| 5760 | 1 | 0 |
| 5761 | 1 | 0 |
| 5762 | 1 | 0 |
| 5763 | 1 | 0 |
| 5764 | 1 | 0 |
| 5765 | 1 | 0 |
| 5766 | 1 | 0 |
| 5767 | 1 | 0 |
| 5768 | 1 | 0 |
| 5769 | 1 | 0 |
| 5770 | 1 | 0 |
| 5771 | 1 | 0 |
| 5772 | 1 | 0 |
| 5773 | 1 | 0 |
| 5774 | 1 | 0 |
| 5775 | 1 | 0 |
| 5776 | 1 | 0 |
| 5777 | 1 | 0 |
| 5778 | 1 | 0 |
| 5779 | 1 | 0 |
| 5780 | 1 | 0 |
| 5781 | 1 | 0 |
| 5782 | 1 | 0 |
| 5783 | 1 | 0 |
| 5784 | 1 | 0 |
| 5785 | 1 | 0 |
| 5786 | 1 | 0 |
| 5787 | 1 | 0 |
| 5788 | 1 | 0 |
| 5789 | 1 | 0 |
| 5790 | 1 | 0 |
| 5791 | 1 | 0 |
| 5792 | 1 | 0 |
| 5793 | 1 | 0 |
| 5794 | 1 | 0 |
| 5795 | 1 | 0 |
| 5796 | 1 | 0 |
| 5797 | 1 | 0 |
| 5798 | 1 | 0 |
| 5799 | 1 | 0 |
| 5800 | 1 | 0 |
| 5801 | 1 | 0 |
| 5802 | 1 | 0 |
| 5803 | 1 | 0 |
| 5804 | 1 | 0 |
| 5805 | 1 | 0 |
| 5806 | 1 | 0 |
| 5807 | 1 | 0 |
| 5808 | 1 | 0 |
| 5809 | 1 | 0 |
| 5810 | 1 | 0 |
| 5811 | 1 | 0 |
| 5812 | 1 | 0 |
| 5813 | 1 | 0 |
| 5814 | 1 | 0 |
| 5815 | 1 | 0 |
| 5816 | 1 | 0 |
| 5817 | 1 | 0 |
| 5818 | 1 | 0 |
| 5819 | 1 | 0 |
| 5820 | 1 | 0 |
| 5821 | 1 | 0 |
| 5822 | 1 | 0 |
| 5823 | 1 | 0 |
| 5824 | 1 | 0 |
| 5825 | 1 | 0 |
| 5826 | 1 | 0 |
| 5827 | 1 | 0 |
| 5828 | 1 | 0 |
| 5829 | 1 | 0 |
| 5830 | 1 | 0 |
| 5831 | 1 | 0 |
| 5832 | 1 | 0 |
| 5833 | 1 | 0 |
| 5834 | 1 | 0 |
| 5835 | 1 | 0 |
| 5836 | 1 | 0 |
| 5837 | 1 | 0 |
| 5838 | 1 | 0 |
| 5839 | 1 | 0 |
| 5840 | 1 | 0 |
| 5841 | 1 | 0 |
| 5842 | 1 | 0 |
| 5843 | 1 | 0 |
| 5844 | 1 | 0 |
| 5845 | 1 | 0 |
| 5846 | 1 | 0 |
| 5847 | 1 | 0 |
| 5848 | 1 | 0 |
| 5849 | 1 | 0 |
| 5850 | 1 | 0 |
| 5851 | 1 | 0 |
| 5852 | 1 | 0 |
| 5853 | 1 | 0 |
| 5854 | 1 | 0 |
| 5855 | 1 | 0 |
| 5856 | 1 | 0 |
| 5857 | 1 | 0 |
| 5858 | 1 | 0 |
| 5859 | 1 | 0 |
| 5860 | 1 | 0 |
| 5861 | 1 | 0 |
| 5862 | 1 | 0 |
| 5863 | 1 | 0 |
| 5864 | 1 | 0 |
| 5865 | 1 | 0 |
| 5866 | 1 | 0 |
| 5867 | 1 | 0 |
| 5868 | 1 | 0 |
| 5869 | 1 | 0 |
| 5870 | 1 | 0 |
| 5871 | 1 | 0 |
| 5872 | 1 | 0 |
| 5873 | 1 | 0 |
| 5874 | 1 | 0 |
| 5875 | 1 | 0 |
| 5876 | 1 | 0 |
| 5877 | 1 | 0 |
| 5878 | 1 | 0 |
| 5879 | 1 | 0 |
| 5880 | 1 | 0 |
| 5881 | 1 | 0 |
| 5882 | 1 | 0 |
| 5883 | 1 | 0 |
| 5884 | 1 | 0 |
| 5885 | 1 | 0 |
| 5886 | 1 | 0 |
| 5887 | 1 | 0 |
| 5888 | 1 | 0 |
| 5889 | 1 | 0 |
| 5890 | 1 | 0 |
| 5891 | 1 | 0 |
| 5892 | 1 | 0 |
| 5893 | 1 | 0 |
| 5894 | 1 | 0 |
| 5895 | 1 | 0 |
| 5896 | 1 | 0 |
| 5897 | 1 | 0 |
| 5898 | 1 | 0 |
| 5899 | 1 | 0 |
| 5900 | 1 | 0 |
| 5901 | 1 | 0 |
| 5902 | 1 | 0 |
| 5903 | 1 | 0 |
| 5904 | 1 | 0 |
| 5905 | 1 | 0 |
| 5906 | 1 | 0 |
| 5907 | 1 | 0 |
| 5908 | 1 | 0 |
| 5909 | 1 | 0 |
| 5910 | 1 | 0 |
| 5911 | 1 | 0 |
| 5912 | 1 | 0 |
| 5913 | 1 | 0 |
| 5914 | 1 | 0 |
| 5915 | 1 | 0 |
| 5916 | 1 | 0 |
| 5917 | 1 | 0 |
| 5918 | 1 | 0 |
| 5919 | 1 | 0 |
| 5920 | 1 | 0 |
| 5921 | 1 | 0 |
| 5922 | 1 | 0 |
| 5923 | 1 | 0 |
| 5924 | 1 | 0 |
| 5925 | 1 | 0 |
| 5926 | 1 | 0 |
| 5927 | 1 | 0 |
| 5928 | 1 | 0 |
| 5929 | 1 | 0 |
| 5930 | 1 | 0 |
| 5931 | 1 | 0 |
| 5932 | 1 | 0 |
| 5933 | 1 | 0 |
| 5934 | 1 | 0 |
| 5935 | 1 | 0 |
| 5936 | 1 | 0 |
| 5937 | 1 | 0 |
| 5938 | 1 | 0 |
| 5939 | 1 | 0 |
| 5940 | 1 | 0 |
| 5941 | 1 | 0 |
| 5942 | 1 | 0 |
| 5943 | 1 | 0 |
| 5944 | 1 | 0 |
| 5945 | 1 | 0 |
| 5946 | 1 | 0 |
| 5947 | 1 | 0 |
| 5948 | 1 | 0 |
| 5949 | 1 | 0 |
| 5950 | 1 | 0 |
| 5951 | 1 | 0 |
| 5952 | 1 | 0 |
| 5953 | 1 | 0 |
| 5954 | 1 | 0 |
| 5955 | 1 | 0 |
| 5956 | 1 | 0 |
| 5957 | 1 | 0 |
| 5958 | 1 | 0 |
| 5959 | 1 | 0 |
| 5960 | 1 | 0 |
| 5961 | 1 | 0 |
| 5962 | 1 | 0 |
| 5963 | 1 | 0 |
| 5964 | 1 | 0 |
| 5965 | 1 | 0 |
| 5966 | 1 | 0 |
| 5967 | 1 | 0 |
| 5968 | 1 | 0 |
| 5969 | 1 | 0 |
| 5970 | 1 | 0 |
| 5971 | 1 | 0 |
| 5972 | 1 | 0 |
| 5973 | 1 | 0 |
| 5974 | 1 | 0 |
| 5975 | 1 | 0 |
| 5976 | 1 | 0 |
| 5977 | 1 | 0 |
| 5978 | 1 | 0 |
| 5979 | 1 | 0 |
| 5980 | 1 | 0 |
| 5981 | 1 | 0 |
| 5982 | 1 | 0 |
| 5983 | 1 | 0 |
| 5984 | 1 | 0 |
| 5985 | 1 | 0 |
| 5986 | 1 | 0 |
| 5987 | 1 | 0 |
| 5988 | 1 | 0 |
| 5989 | 1 | 0 |
| 5990 | 1 | 0 |
| 5991 | 1 | 0 |
| 5992 | 1 | 0 |
| 5993 | 1 | 0 |
| 5994 | 1 | 0 |
| 5995 | 1 | 0 |
| 5996 | 1 | 0 |
| 5997 | 1 | 0 |
| 5998 | 1 | 0 |
| 5999 | 1 | 0 |
| 6000 | 1 | 0 |
| 6001 | 1 | 0 |
| 6002 | 1 | 0 |
| 6003 | 1 | 0 |
| 6004 | 1 | 0 |
| 6005 | 1 | 0 |
| 6006 | 1 | 0 |
| 6007 | 1 | 0 |
| 6008 | 1 | 0 |
| 6009 | 1 | 0 |
| 6010 | 1 | 0 |
| 6011 | 1 | 0 |
| 6012 | 1 | 0 |
| 6013 | 1 | 0 |
| 6014 | 1 | 0 |
| 6015 | 1 | 0 |
| 6016 | 1 | 0 |
| 6017 | 1 | 0 |
| 6018 | 1 | 0 |
| 6019 | 1 | 0 |
| 6020 | 1 | 0 |
| 6021 | 1 | 0 |
| 6022 | 1 | 0 |
| 6023 | 1 | 0 |
| 6024 | 1 | 0 |
| 6025 | 1 | 0 |
| 6026 | 1 | 0 |
| 6027 | 1 | 0 |
| 6028 | 1 | 0 |
| 6029 | 1 | 0 |
| 6030 | 1 | 0 |
| 6031 | 1 | 0 |
| 6032 | 1 | 0 |
| 6033 | 1 | 0 |
| 6034 | 1 | 0 |
| 6035 | 1 | 0 |
| 6036 | 1 | 0 |
| 6037 | 1 | 0 |
| 6038 | 1 | 0 |
| 6039 | 1 | 0 |
| 6040 | 1 | 0 |
| 6041 | 1 | 0 |
| 6042 | 1 | 0 |
| 6043 | 1 | 0 |
| 6044 | 1 | 0 |
| 6045 | 1 | 0 |
| 6046 | 1 | 0 |
| 6047 | 1 | 0 |
| 6048 | 1 | 0 |
| 6049 | 1 | 0 |
| 6050 | 1 | 0 |
| 6051 | 1 | 0 |
| 6052 | 1 | 0 |
| 6053 | 1 | 0 |
| 6054 | 1 | 0 |
| 6055 | 1 | 0 |
| 6056 | 1 | 0 |
| 6057 | 1 | 0 |
| 6058 | 1 | 0 |
| 6059 | 1 | 0 |
| 6060 | 1 | 0 |
| 6061 | 1 | 0 |
| 6062 | 1 | 0 |
| 6063 | 1 | 0 |
| 6064 | 1 | 0 |
| 6065 | 1 | 0 |
| 6066 | 1 | 0 |
| 6067 | 1 | 0 |
| 6068 | 1 | 0 |
| 6069 | 1 | 0 |
| 6070 | 1 | 0 |
| 6071 | 1 | 0 |
| 6072 | 1 | 0 |
| 6073 | 1 | 0 |
| 6074 | 1 | 0 |
| 6075 | 1 | 0 |
| 6076 | 1 | 0 |
| 6077 | 1 | 0 |
| 6078 | 1 | 0 |
| 6079 | 1 | 0 |
| 6080 | 1 | 0 |
| 6081 | 1 | 0 |
| 6082 | 1 | 0 |
| 6083 | 1 | 0 |
| 6084 | 1 | 0 |
| 6085 | 1 | 0 |
| 6086 | 1 | 0 |
| 6087 | 1 | 0 |
| 6088 | 1 | 0 |
| 6089 | 1 | 0 |
| 6090 | 1 | 0 |
| 6091 | 1 | 0 |
| 6092 | 1 | 0 |
| 6093 | 1 | 0 |
| 6094 | 1 | 0 |
| 6095 | 1 | 0 |
| 6096 | 1 | 0 |
| 6097 | 1 | 0 |
| 6098 | 1 | 0 |
| 6099 | 1 | 0 |
| 6100 | 1 | 0 |
| 6101 | 1 | 0 |
| 6102 | 1 | 0 |
| 6103 | 1 | 0 |
| 6104 | 1 | 0 |
| 6105 | 1 | 0 |
| 6106 | 1 | 0 |
| 6107 | 1 | 0 |
| 6108 | 1 | 0 |
| 6109 | 1 | 0 |
| 6110 | 1 | 0 |
| 6111 | 1 | 0 |
| 6112 | 1 | 0 |
| 6113 | 1 | 0 |
| 6114 | 1 | 0 |
| 6115 | 1 | 0 |
| 6116 | 1 | 0 |
| 6117 | 1 | 0 |
| 6118 | 1 | 0 |
| 6119 | 1 | 0 |
| 6120 | 1 | 0 |
| 6121 | 1 | 0 |
| 6122 | 1 | 0 |
| 6123 | 1 | 0 |
| 6124 | 1 | 0 |
| 6125 | 1 | 0 |
| 6126 | 1 | 0 |
| 6127 | 1 | 0 |
| 6128 | 1 | 0 |
| 6129 | 1 | 0 |
| 6130 | 1 | 0 |
| 6131 | 1 | 0 |
| 6132 | 1 | 0 |
| 6133 | 1 | 0 |
| 6134 | 1 | 0 |
| 6135 | 1 | 0 |
| 6136 | 1 | 0 |
| 6137 | 1 | 0 |
| 6138 | 1 | 0 |
| 6139 | 1 | 0 |
| 6140 | 1 | 0 |
| 6141 | 1 | 0 |
| 6142 | 1 | 0 |
| 6143 | 1 | 0 |
| 6144 | 1 | 0 |
| 6145 | 1 | 0 |
| 6146 | 1 | 0 |
| 6147 | 1 | 0 |
| 6148 | 1 | 0 |
| 6149 | 1 | 0 |
| 6150 | 1 | 0 |
| 6151 | 1 | 0 |
| 6152 | 1 | 0 |
| 6153 | 1 | 0 |
| 6154 | 1 | 0 |
| 6155 | 1 | 0 |
| 6156 | 1 | 0 |
| 6157 | 1 | 0 |
| 6158 | 1 | 0 |
| 6159 | 1 | 0 |
| 6160 | 1 | 0 |
| 6161 | 1 | 0 |
| 6162 | 1 | 0 |
| 6163 | 1 | 0 |
| 6164 | 1 | 0 |
| 6165 | 1 | 0 |
| 6166 | 1 | 0 |
| 6167 | 1 | 0 |
| 6168 | 1 | 0 |
| 6169 | 1 | 0 |
| 6170 | 1 | 0 |
| 6171 | 1 | 0 |
| 6172 | 1 | 0 |
| 6173 | 1 | 0 |
| 6174 | 1 | 0 |
| 6175 | 1 | 0 |
| 6176 | 1 | 0 |
| 6177 | 1 | 0 |
| 6178 | 1 | 0 |
| 6179 | 1 | 0 |
| 6180 | 1 | 0 |
| 6181 | 1 | 0 |
| 6182 | 1 | 0 |
| 6183 | 1 | 0 |
| 6184 | 1 | 0 |
| 6185 | 1 | 0 |
| 6186 | 1 | 0 |
| 6187 | 1 | 0 |
| 6188 | 1 | 0 |
| 6189 | 1 | 0 |
| 6190 | 1 | 0 |
| 6191 | 1 | 0 |
| 6192 | 1 | 0 |
| 6193 | 1 | 0 |
| 6194 | 1 | 0 |
| 6195 | 1 | 0 |
| 6196 | 1 | 0 |
| 6197 | 1 | 0 |
| 6198 | 1 | 0 |
| 6199 | 1 | 0 |
| 6200 | 1 | 0 |
| 6201 | 1 | 0 |
| 6202 | 1 | 0 |
| 6203 | 1 | 0 |
| 6204 | 1 | 0 |
| 6205 | 1 | 0 |
| 6206 | 1 | 0 |
| 6207 | 1 | 0 |
| 6208 | 1 | 0 |
| 6209 | 1 | 0 |
| 6210 | 1 | 0 |
| 6211 | 1 | 0 |
| 6212 | 1 | 0 |
| 6213 | 1 | 0 |
| 6214 | 1 | 0 |
| 6215 | 1 | 0 |
| 6216 | 1 | 0 |
| 6217 | 1 | 0 |
| 6218 | 1 | 0 |
| 6219 | 1 | 0 |
| 6220 | 1 | 0 |
| 6221 | 1 | 0 |
| 6222 | 1 | 0 |
| 6223 | 1 | 0 |
| 6224 | 1 | 0 |
| 6225 | 1 | 0 |
| 6226 | 1 | 0 |
| 6227 | 1 | 0 |
| 6228 | 1 | 0 |
| 6229 | 1 | 0 |
| 6230 | 1 | 0 |
| 6231 | 1 | 0 |
| 6232 | 1 | 0 |
| 6233 | 1 | 0 |
| 6234 | 1 | 0 |
| 6235 | 1 | 0 |
| 6236 | 1 | 0 |
| 6237 | 1 | 0 |
| 6238 | 1 | 0 |
| 6239 | 1 | 0 |
| 6240 | 1 | 0 |
| 6241 | 1 | 0 |
| 6242 | 1 | 0 |
| 6243 | 1 | 0 |
| 6244 | 1 | 0 |
| 6245 | 1 | 0 |
| 6246 | 1 | 0 |
| 6247 | 1 | 0 |
| 6248 | 1 | 0 |
| 6249 | 1 | 0 |
| 6250 | 1 | 0 |
| 6251 | 1 | 0 |
| 6252 | 1 | 0 |
| 6253 | 1 | 0 |
| 6254 | 1 | 0 |
| 6255 | 1 | 0 |
| 6256 | 1 | 0 |
| 6257 | 1 | 0 |
| 6258 | 1 | 0 |
| 6259 | 1 | 0 |
| 6260 | 1 | 0 |
| 6261 | 1 | 0 |
| 6262 | 1 | 0 |
| 6263 | 1 | 0 |
| 6264 | 1 | 0 |
| 6265 | 1 | 0 |
| 6266 | 1 | 0 |
| 6267 | 1 | 0 |
| 6268 | 1 | 0 |
| 6269 | 1 | 0 |
| 6270 | 1 | 0 |
| 6271 | 1 | 0 |
| 6272 | 1 | 0 |
| 6273 | 1 | 0 |
| 6274 | 1 | 0 |
| 6275 | 1 | 0 |
| 6276 | 1 | 0 |
| 6277 | 1 | 0 |
| 6278 | 1 | 0 |
| 6279 | 1 | 0 |
| 6280 | 1 | 0 |
| 6281 | 1 | 0 |
| 6282 | 1 | 0 |
| 6283 | 1 | 0 |
| 6284 | 1 | 0 |
| 6285 | 1 | 0 |
| 6286 | 1 | 0 |
| 6287 | 1 | 0 |
| 6288 | 1 | 0 |
| 6289 | 1 | 0 |
| 6290 | 1 | 0 |
| 6291 | 1 | 0 |
| 6292 | 1 | 0 |
| 6293 | 1 | 0 |
| 6294 | 1 | 0 |
| 6295 | 1 | 0 |
| 6296 | 1 | 0 |
| 6297 | 1 | 0 |
| 6298 | 1 | 0 |
| 6299 | 1 | 0 |
| 6300 | 1 | 0 |
| 6301 | 1 | 0 |
| 6302 | 1 | 0 |
| 6303 | 1 | 0 |
| 6304 | 1 | 0 |
| 6305 | 1 | 0 |
| 6306 | 1 | 0 |
| 6307 | 1 | 0 |
| 6308 | 1 | 0 |
| 6309 | 1 | 0 |
| 6310 | 1 | 0 |
| 6311 | 1 | 0 |
| 6312 | 1 | 0 |
| 6313 | 1 | 0 |
| 6314 | 1 | 0 |
| 6315 | 1 | 0 |
| 6316 | 1 | 0 |
| 6317 | 1 | 0 |
| 6318 | 1 | 0 |
| 6319 | 1 | 0 |
| 6320 | 1 | 0 |
| 6321 | 1 | 0 |
| 6322 | 1 | 0 |
| 6323 | 1 | 0 |
| 6324 | 1 | 0 |
| 6325 | 1 | 0 |
| 6326 | 1 | 0 |
| 6327 | 1 | 0 |
| 6328 | 1 | 0 |
| 6329 | 1 | 0 |
| 6330 | 1 | 0 |
| 6331 | 1 | 0 |
| 6332 | 1 | 0 |
| 6333 | 1 | 0 |
| 6334 | 1 | 0 |
| 6335 | 1 | 0 |
| 6336 | 1 | 0 |
| 6337 | 1 | 0 |
| 6338 | 1 | 0 |
| 6339 | 1 | 0 |
| 6340 | 1 | 0 |
| 6341 | 1 | 0 |
| 6342 | 1 | 0 |
| 6343 | 1 | 0 |
| 6344 | 1 | 0 |
| 6345 | 1 | 0 |
| 6346 | 1 | 0 |
| 6347 | 1 | 0 |
| 6348 | 1 | 0 |
| 6349 | 1 | 0 |
| 6350 | 1 | 0 |
| 6351 | 1 | 0 |
| 6352 | 1 | 0 |
| 6353 | 1 | 0 |
| 6354 | 1 | 0 |
| 6355 | 1 | 0 |
| 6356 | 1 | 0 |
| 6357 | 1 | 0 |
| 6358 | 1 | 0 |
| 6359 | 1 | 0 |
| 6360 | 1 | 0 |
| 6361 | 1 | 0 |
| 6362 | 1 | 0 |
| 6363 | 1 | 0 |
| 6364 | 1 | 0 |
| 6365 | 1 | 0 |
| 6366 | 1 | 0 |
| 6367 | 1 | 0 |
| 6368 | 1 | 0 |
| 6369 | 1 | 0 |
| 6370 | 1 | 0 |
| 6371 | 1 | 0 |
| 6372 | 1 | 0 |
| 6373 | 1 | 0 |
| 6374 | 1 | 0 |
| 6375 | 1 | 0 |
| 6376 | 1 | 0 |
| 6377 | 1 | 0 |
| 6378 | 1 | 0 |
| 6379 | 1 | 0 |
| 6380 | 1 | 0 |
| 6381 | 1 | 0 |
| 6382 | 1 | 0 |
| 6383 | 1 | 0 |
| 6384 | 1 | 0 |
| 6385 | 1 | 0 |
| 6386 | 1 | 0 |
| 6387 | 1 | 0 |
| 6388 | 1 | 0 |
| 6389 | 1 | 0 |
| 6390 | 1 | 0 |
| 6391 | 1 | 0 |
| 6392 | 1 | 0 |
| 6393 | 1 | 0 |
| 6394 | 1 | 0 |
| 6395 | 1 | 0 |
| 6396 | 1 | 0 |
| 6397 | 1 | 0 |
| 6398 | 1 | 0 |
| 6399 | 1 | 0 |
| 6400 | 1 | 0 |
| 6401 | 1 | 0 |
| 6402 | 1 | 0 |
| 6403 | 1 | 0 |
| 6404 | 1 | 0 |
| 6405 | 1 | 0 |
| 6406 | 1 | 0 |
| 6407 | 1 | 0 |
| 6408 | 1 | 0 |
| 6409 | 1 | 0 |
| 6410 | 1 | 0 |
| 6411 | 1 | 0 |
| 6412 | 1 | 0 |
| 6413 | 1 | 0 |
| 6414 | 1 | 0 |
| 6415 | 1 | 0 |
| 6416 | 1 | 0 |
| 6417 | 1 | 0 |
| 6418 | 1 | 0 |
| 6419 | 1 | 0 |
| 6420 | 1 | 0 |
| 6421 | 1 | 0 |
| 6422 | 1 | 0 |
| 6423 | 1 | 0 |
| 6424 | 1 | 0 |
| 6425 | 1 | 0 |
| 6426 | 1 | 0 |
| 6427 | 1 | 0 |
| 6428 | 1 | 0 |
| 6429 | 1 | 0 |
| 6430 | 1 | 0 |
| 6431 | 1 | 0 |
| 6432 | 1 | 0 |
| 6433 | 1 | 0 |
| 6434 | 1 | 0 |
| 6435 | 1 | 0 |
| 6436 | 1 | 0 |
| 6437 | 1 | 0 |
| 6438 | 1 | 0 |
| 6439 | 1 | 0 |
| 6440 | 1 | 0 |
| 6441 | 1 | 0 |
| 6442 | 1 | 0 |
| 6443 | 1 | 0 |
| 6444 | 1 | 0 |
| 6445 | 1 | 0 |
| 6446 | 1 | 0 |
| 6447 | 1 | 0 |
| 6448 | 1 | 0 |
| 6449 | 1 | 0 |
| 6450 | 1 | 0 |
| 6451 | 1 | 0 |
| 6452 | 1 | 0 |
| 6453 | 1 | 0 |
| 6454 | 1 | 0 |
| 6455 | 1 | 0 |
| 6456 | 1 | 0 |
| 6457 | 1 | 0 |
| 6458 | 1 | 0 |
| 6459 | 1 | 0 |
| 6460 | 1 | 0 |
| 6461 | 1 | 0 |
| 6462 | 1 | 0 |
| 6463 | 1 | 0 |
| 6464 | 1 | 0 |
| 6465 | 1 | 0 |
| 6466 | 1 | 0 |
| 6467 | 1 | 0 |
| 6468 | 1 | 0 |
| 6469 | 1 | 0 |
| 6470 | 1 | 0 |
| 6471 | 1 | 0 |
| 6472 | 1 | 0 |
| 6473 | 1 | 0 |
| 6474 | 1 | 0 |
| 6475 | 1 | 0 |
| 6476 | 1 | 0 |
| 6477 | 1 | 0 |
| 6478 | 1 | 0 |
| 6479 | 1 | 0 |
| 6480 | 1 | 0 |
| 6481 | 1 | 0 |
| 6482 | 1 | 0 |
| 6483 | 1 | 0 |
| 6484 | 1 | 0 |
| 6485 | 1 | 0 |
| 6486 | 1 | 0 |
| 6487 | 1 | 0 |
| 6488 | 1 | 0 |
| 6489 | 1 | 0 |
| 6490 | 1 | 0 |
| 6491 | 1 | 0 |
| 6492 | 1 | 0 |
| 6493 | 1 | 0 |
| 6494 | 1 | 0 |
| 6495 | 1 | 0 |
| 6496 | 1 | 0 |
| 6497 | 1 | 0 |
| 6498 | 1 | 0 |
| 6499 | 1 | 0 |
| 6500 | 1 | 0 |
| 6501 | 1 | 0 |
| 6502 | 1 | 0 |
| 6503 | 1 | 0 |
| 6504 | 1 | 0 |
| 6505 | 1 | 0 |
| 6506 | 1 | 0 |
| 6507 | 1 | 0 |
| 6508 | 1 | 0 |
| 6509 | 1 | 0 |
| 6510 | 1 | 0 |
| 6511 | 1 | 0 |
| 6512 | 1 | 0 |
| 6513 | 1 | 0 |
| 6514 | 1 | 0 |
| 6515 | 1 | 0 |
| 6516 | 1 | 0 |
| 6517 | 1 | 0 |
| 6518 | 1 | 0 |
| 6519 | 1 | 0 |
| 6520 | 1 | 0 |
| 6521 | 1 | 0 |
| 6522 | 1 | 0 |
| 6523 | 1 | 0 |
| 6524 | 1 | 0 |
| 6525 | 1 | 0 |
| 6526 | 1 | 0 |
| 6527 | 1 | 0 |
| 6528 | 1 | 0 |
| 6529 | 1 | 0 |
| 6530 | 1 | 0 |
| 6531 | 1 | 0 |
| 6532 | 1 | 0 |
| 6533 | 1 | 0 |
| 6534 | 1 | 0 |
| 6535 | 1 | 0 |
| 6536 | 1 | 0 |
| 6537 | 1 | 0 |
| 6538 | 1 | 0 |
| 6539 | 1 | 0 |
| 6540 | 1 | 0 |
| 6541 | 1 | 0 |
| 6542 | 1 | 0 |
| 6543 | 1 | 0 |
| 6544 | 1 | 0 |
| 6545 | 1 | 0 |
| 6546 | 1 | 0 |
| 6547 | 1 | 0 |
| 6548 | 1 | 0 |
| 6549 | 1 | 0 |
| 6550 | 1 | 0 |
| 6551 | 1 | 0 |
| 6552 | 1 | 0 |
| 6553 | 1 | 0 |
| 6554 | 1 | 0 |
| 6555 | 1 | 0 |
| 6556 | 1 | 0 |
| 6557 | 1 | 0 |
| 6558 | 1 | 0 |
| 6559 | 1 | 0 |
| 6560 | 1 | 0 |
| 6561 | 1 | 0 |
| 6562 | 1 | 0 |
| 6563 | 1 | 0 |
| 6564 | 1 | 0 |
| 6565 | 1 | 0 |
| 6566 | 1 | 0 |
| 6567 | 1 | 0 |
| 6568 | 1 | 0 |
| 6569 | 1 | 0 |
| 6570 | 1 | 0 |
| 6571 | 1 | 0 |
| 6572 | 1 | 0 |
| 6573 | 1 | 0 |
| 6574 | 1 | 0 |
| 6575 | 1 | 0 |
| 6576 | 1 | 0 |
| 6577 | 1 | 0 |
| 6578 | 1 | 0 |
| 6579 | 1 | 0 |
| 6580 | 1 | 0 |
| 6581 | 1 | 0 |
| 6582 | 1 | 0 |
| 6583 | 1 | 0 |
| 6584 | 1 | 0 |
| 6585 | 1 | 0 |
| 6586 | 1 | 0 |
| 6587 | 1 | 0 |
| 6588 | 1 | 0 |
| 6589 | 1 | 0 |
| 6590 | 1 | 0 |
| 6591 | 1 | 0 |
| 6592 | 1 | 0 |
| 6593 | 1 | 0 |
| 6594 | 1 | 0 |
| 6595 | 1 | 0 |
| 6596 | 1 | 0 |
| 6597 | 1 | 0 |
| 6598 | 1 | 0 |
| 6599 | 1 | 0 |
| 6600 | 1 | 0 |
| 6601 | 1 | 0 |
| 6602 | 1 | 0 |
| 6603 | 1 | 0 |
| 6604 | 1 | 0 |
| 6605 | 1 | 0 |
| 6606 | 1 | 0 |
| 6607 | 1 | 0 |
| 6608 | 1 | 0 |
| 6609 | 1 | 0 |
| 6610 | 1 | 0 |
| 6611 | 1 | 0 |
| 6612 | 1 | 0 |
| 6613 | 1 | 0 |
| 6614 | 1 | 0 |
| 6615 | 1 | 0 |
| 6616 | 1 | 0 |
| 6617 | 1 | 0 |
| 6618 | 1 | 0 |
| 6619 | 1 | 0 |
| 6620 | 1 | 0 |
| 6621 | 1 | 0 |
| 6622 | 1 | 0 |
| 6623 | 1 | 0 |
| 6624 | 1 | 0 |
| 6625 | 1 | 0 |
| 6626 | 1 | 0 |
| 6627 | 1 | 0 |
| 6628 | 1 | 0 |
| 6629 | 1 | 0 |
| 6630 | 1 | 0 |
| 6631 | 1 | 0 |
| 6632 | 1 | 0 |
| 6633 | 1 | 0 |
| 6634 | 1 | 0 |
| 6635 | 1 | 0 |
| 6636 | 1 | 0 |
| 6637 | 1 | 0 |
| 6638 | 1 | 0 |
| 6639 | 1 | 0 |
| 6640 | 1 | 0 |
| 6641 | 1 | 0 |
| 6642 | 1 | 0 |
| 6643 | 1 | 0 |
| 6644 | 1 | 0 |
| 6645 | 1 | 0 |
| 6646 | 1 | 0 |
| 6647 | 1 | 0 |
| 6648 | 1 | 0 |
| 6649 | 1 | 0 |
| 6650 | 1 | 0 |
| 6651 | 1 | 0 |
| 6652 | 1 | 0 |
| 6653 | 1 | 0 |
| 6654 | 1 | 0 |
| 6655 | 1 | 0 |
| 6656 | 1 | 0 |
| 6657 | 1 | 0 |
| 6658 | 1 | 0 |
| 6659 | 1 | 0 |
| 6660 | 1 | 0 |
| 6661 | 1 | 0 |
| 6662 | 1 | 0 |
| 6663 | 1 | 0 |
| 6664 | 1 | 0 |
| 6665 | 1 | 0 |
| 6666 | 1 | 0 |
| 6667 | 1 | 0 |
| 6668 | 1 | 0 |
| 6669 | 1 | 0 |
| 6670 | 1 | 0 |
| 6671 | 1 | 0 |
| 6672 | 1 | 0 |
| 6673 | 1 | 0 |
| 6674 | 1 | 0 |
| 6675 | 1 | 0 |
| 6676 | 1 | 0 |
| 6677 | 1 | 0 |
| 6678 | 1 | 0 |
| 6679 | 1 | 0 |
| 6680 | 1 | 0 |
| 6681 | 1 | 0 |
| 6682 | 1 | 0 |
| 6683 | 1 | 0 |
| 6684 | 1 | 0 |
| 6685 | 1 | 0 |
| 6686 | 1 | 0 |
| 6687 | 1 | 0 |
| 6688 | 1 | 0 |
| 6689 | 1 | 0 |
| 6690 | 1 | 0 |
| 6691 | 1 | 0 |
| 6692 | 1 | 0 |
| 6693 | 1 | 0 |
| 6694 | 1 | 0 |
| 6695 | 1 | 0 |
| 6696 | 1 | 0 |
| 6697 | 1 | 0 |
| 6698 | 1 | 0 |
| 6699 | 1 | 0 |
| 6700 | 1 | 0 |
| 6701 | 1 | 0 |
| 6702 | 1 | 0 |
| 6703 | 1 | 0 |
| 6704 | 1 | 0 |
| 6705 | 1 | 0 |
| 6706 | 1 | 0 |
| 6707 | 1 | 0 |
| 6708 | 1 | 0 |
| 6709 | 1 | 0 |
| 6710 | 1 | 0 |
| 6711 | 1 | 0 |
| 6712 | 1 | 0 |
| 6713 | 1 | 0 |
| 6714 | 1 | 0 |
| 6715 | 1 | 0 |
| 6716 | 1 | 0 |
| 6717 | 1 | 0 |
| 6718 | 1 | 0 |
| 6719 | 1 | 0 |
| 6720 | 1 | 0 |
| 6721 | 1 | 0 |
| 6722 | 1 | 0 |
| 6723 | 1 | 0 |
| 6724 | 1 | 0 |
| 6725 | 1 | 0 |
| 6726 | 1 | 0 |
| 6727 | 1 | 0 |
| 6728 | 1 | 0 |
| 6729 | 1 | 0 |
| 6730 | 1 | 0 |
| 6731 | 1 | 0 |
| 6732 | 1 | 0 |
| 6733 | 1 | 0 |
| 6734 | 1 | 0 |
| 6735 | 1 | 0 |
| 6736 | 1 | 0 |
| 6737 | 1 | 0 |
| 6738 | 1 | 0 |
| 6739 | 1 | 0 |
| 6740 | 1 | 0 |
| 6741 | 1 | 0 |
| 6742 | 1 | 0 |
| 6743 | 1 | 0 |
| 6744 | 1 | 0 |
| 6745 | 1 | 0 |
| 6746 | 1 | 0 |
| 6747 | 1 | 0 |
| 6748 | 1 | 0 |
| 6749 | 1 | 0 |
| 6750 | 1 | 0 |
| 6751 | 1 | 0 |
| 6752 | 1 | 0 |
| 6753 | 1 | 0 |
| 6754 | 1 | 0 |
| 6755 | 1 | 0 |
| 6756 | 1 | 0 |
| 6757 | 1 | 0 |
| 6758 | 1 | 0 |
| 6759 | 1 | 0 |
| 6760 | 1 | 0 |
| 6761 | 1 | 0 |
| 6762 | 1 | 0 |
| 6763 | 1 | 0 |
| 6764 | 1 | 0 |
| 6765 | 1 | 0 |
| 6766 | 1 | 0 |
| 6767 | 1 | 0 |
| 6768 | 1 | 0 |
| 6769 | 1 | 0 |
| 6770 | 1 | 0 |
| 6771 | 1 | 0 |
| 6772 | 1 | 0 |
| 6773 | 1 | 0 |
| 6774 | 1 | 0 |
| 6775 | 1 | 0 |
| 6776 | 1 | 0 |
| 6777 | 1 | 0 |
| 6778 | 1 | 0 |
| 6779 | 1 | 0 |
| 6780 | 1 | 0 |
| 6781 | 1 | 0 |
| 6782 | 1 | 0 |
| 6783 | 1 | 0 |
| 6784 | 1 | 0 |
| 6785 | 1 | 0 |
| 6786 | 1 | 0 |
| 6787 | 1 | 0 |
| 6788 | 1 | 0 |
| 6789 | 1 | 0 |
| 6790 | 1 | 0 |
| 6791 | 1 | 0 |
| 6792 | 1 | 0 |
| 6793 | 1 | 0 |
| 6794 | 1 | 0 |
| 6795 | 1 | 0 |
| 6796 | 1 | 0 |
| 6797 | 1 | 0 |
| 6798 | 1 | 0 |
| 6799 | 1 | 0 |
| 6800 | 1 | 0 |
| 6801 | 1 | 0 |
| 6802 | 1 | 0 |
| 6803 | 1 | 0 |
| 6804 | 1 | 0 |
| 6805 | 1 | 0 |
| 6806 | 1 | 0 |
| 6807 | 1 | 0 |
| 6808 | 1 | 0 |
| 6809 | 1 | 0 |
| 6810 | 1 | 0 |
| 6811 | 1 | 0 |
| 6812 | 1 | 0 |
| 6813 | 1 | 0 |
| 6814 | 1 | 0 |
| 6815 | 1 | 0 |
| 6816 | 1 | 0 |
| 6817 | 1 | 0 |
| 6818 | 1 | 0 |
| 6819 | 1 | 0 |
| 6820 | 1 | 0 |
| 6821 | 1 | 0 |
| 6822 | 1 | 0 |
| 6823 | 1 | 0 |
| 6824 | 1 | 0 |
| 6825 | 1 | 0 |
| 6826 | 1 | 0 |
| 6827 | 1 | 0 |
| 6828 | 1 | 0 |
| 6829 | 1 | 0 |
| 6830 | 1 | 0 |
| 6831 | 1 | 0 |
| 6832 | 1 | 0 |
| 6833 | 1 | 0 |
| 6834 | 1 | 0 |
| 6835 | 1 | 0 |
| 6836 | 1 | 0 |
| 6837 | 1 | 0 |
| 6838 | 1 | 0 |
| 6839 | 1 | 0 |
| 6840 | 1 | 0 |
| 6841 | 1 | 0 |
| 6842 | 1 | 0 |
| 6843 | 1 | 0 |
| 6844 | 1 | 0 |
| 6845 | 1 | 0 |
| 6846 | 1 | 0 |
| 6847 | 1 | 0 |
| 6848 | 1 | 0 |
| 6849 | 1 | 0 |
| 6850 | 1 | 0 |
| 6851 | 1 | 0 |
| 6852 | 1 | 0 |
| 6853 | 1 | 0 |
| 6854 | 1 | 0 |
| 6855 | 1 | 0 |
| 6856 | 1 | 0 |
| 6857 | 1 | 0 |
| 6858 | 1 | 0 |
| 6859 | 1 | 0 |
| 6860 | 1 | 0 |
| 6861 | 1 | 0 |
| 6862 | 1 | 0 |
| 6863 | 1 | 0 |
| 6864 | 1 | 0 |
| 6865 | 1 | 0 |
| 6866 | 1 | 0 |
| 6867 | 1 | 0 |
| 6868 | 1 | 0 |
| 6869 | 1 | 0 |
| 6870 | 1 | 0 |
| 6871 | 1 | 0 |
| 6872 | 1 | 0 |
| 6873 | 1 | 0 |
| 6874 | 1 | 0 |
| 6875 | 1 | 0 |
| 6876 | 1 | 0 |
| 6877 | 1 | 0 |
| 6878 | 1 | 0 |
| 6879 | 1 | 0 |
| 6880 | 1 | 0 |
| 6881 | 1 | 0 |
| 6882 | 1 | 0 |
| 6883 | 1 | 0 |
| 6884 | 1 | 0 |
| 6885 | 1 | 0 |
| 6886 | 1 | 0 |
| 6887 | 1 | 0 |
| 6888 | 1 | 0 |
| 6889 | 1 | 0 |
| 6890 | 1 | 0 |
| 6891 | 1 | 0 |
| 6892 | 1 | 0 |
| 6893 | 1 | 0 |
| 6894 | 1 | 0 |
| 6895 | 1 | 0 |
| 6896 | 1 | 0 |
| 6897 | 1 | 0 |
| 6898 | 1 | 0 |
| 6899 | 1 | 0 |
| 6900 | 1 | 0 |
| 6901 | 1 | 0 |
| 6902 | 1 | 0 |
| 6903 | 1 | 0 |
| 6904 | 1 | 0 |
| 6905 | 1 | 0 |
| 6906 | 1 | 0 |
| 6907 | 1 | 0 |
| 6908 | 1 | 0 |
| 6909 | 1 | 0 |
| 6910 | 1 | 0 |
| 6911 | 1 | 0 |
| 6912 | 1 | 0 |
| 6913 | 1 | 0 |
| 6914 | 1 | 0 |
| 6915 | 1 | 0 |
| 6916 | 1 | 0 |
| 6917 | 1 | 0 |
| 6918 | 1 | 0 |
| 6919 | 1 | 0 |
| 6920 | 1 | 0 |
| 6921 | 1 | 0 |
| 6922 | 1 | 0 |
| 6923 | 1 | 0 |
| 6924 | 1 | 0 |
| 6925 | 1 | 0 |
| 6926 | 1 | 0 |
| 6927 | 1 | 0 |
| 6928 | 1 | 0 |
| 6929 | 1 | 0 |
| 6930 | 1 | 0 |
| 6931 | 1 | 0 |
| 6932 | 1 | 0 |
| 6933 | 1 | 0 |
| 6934 | 1 | 0 |
| 6935 | 1 | 0 |
| 6936 | 1 | 0 |
| 6937 | 1 | 0 |
| 6938 | 1 | 0 |
| 6939 | 1 | 0 |
| 6940 | 1 | 0 |
| 6941 | 1 | 0 |
| 6942 | 1 | 0 |
| 6943 | 1 | 0 |
| 6944 | 1 | 0 |
| 6945 | 1 | 0 |
| 6946 | 1 | 0 |
| 6947 | 1 | 0 |
| 6948 | 1 | 0 |
| 6949 | 1 | 0 |
| 6950 | 1 | 0 |
| 6951 | 1 | 0 |
| 6952 | 1 | 0 |
| 6953 | 1 | 0 |
| 6954 | 1 | 0 |
| 6955 | 1 | 0 |
| 6956 | 1 | 0 |
| 6957 | 1 | 0 |
| 6958 | 1 | 0 |
| 6959 | 1 | 0 |
| 6960 | 1 | 0 |
| 6961 | 1 | 0 |
| 6962 | 1 | 0 |
| 6963 | 1 | 0 |
| 6964 | 1 | 0 |
| 6965 | 1 | 0 |
| 6966 | 1 | 0 |
| 6967 | 1 | 0 |
| 6968 | 1 | 0 |
| 6969 | 1 | 0 |
| 6970 | 1 | 0 |
| 6971 | 1 | 0 |
| 6972 | 1 | 0 |
| 6973 | 1 | 0 |
| 6974 | 1 | 0 |
| 6975 | 1 | 0 |
| 6976 | 1 | 0 |
| 6977 | 1 | 0 |
| 6978 | 1 | 0 |
| 6979 | 1 | 0 |
| 6980 | 1 | 0 |
| 6981 | 1 | 0 |
| 6982 | 1 | 0 |
| 6983 | 1 | 0 |
| 6984 | 1 | 0 |
| 6985 | 1 | 0 |
| 6986 | 1 | 0 |
| 6987 | 1 | 0 |
| 6988 | 1 | 0 |
| 6989 | 1 | 0 |
| 6990 | 1 | 0 |
| 6991 | 1 | 0 |
| 6992 | 1 | 0 |
| 6993 | 1 | 0 |
| 6994 | 1 | 0 |
| 6995 | 1 | 0 |
| 6996 | 1 | 0 |
| 6997 | 1 | 0 |
| 6998 | 1 | 0 |
| 6999 | 1 | 0 |
| 7000 | 1 | 0 |
| 7001 | 1 | 0 |
| 7002 | 1 | 0 |
| 7003 | 1 | 0 |
| 7004 | 1 | 0 |
| 7005 | 1 | 0 |
| 7006 | 1 | 0 |
| 7007 | 1 | 0 |
| 7008 | 1 | 0 |
| 7009 | 1 | 0 |
| 7010 | 1 | 0 |
| 7011 | 1 | 0 |
| 7012 | 1 | 0 |
| 7013 | 1 | 0 |
| 7014 | 1 | 0 |
| 7015 | 1 | 0 |
| 7016 | 1 | 0 |
| 7017 | 1 | 0 |
| 7018 | 1 | 0 |
| 7019 | 1 | 0 |
| 7020 | 1 | 0 |
| 7021 | 1 | 0 |
| 7022 | 1 | 0 |
| 7023 | 1 | 0 |
| 7024 | 1 | 0 |
| 7025 | 1 | 0 |
| 7026 | 1 | 0 |
| 7027 | 1 | 0 |
| 7028 | 1 | 0 |
| 7029 | 1 | 0 |
| 7030 | 1 | 0 |
| 7031 | 1 | 0 |
| 7032 | 1 | 0 |
| 7033 | 1 | 0 |
| 7034 | 1 | 0 |
| 7035 | 1 | 0 |
| 7036 | 1 | 0 |
| 7037 | 1 | 0 |
| 7038 | 1 | 0 |
| 7039 | 1 | 0 |
| 7040 | 1 | 0 |
| 7041 | 1 | 0 |
| 7042 | 1 | 0 |
| 7043 | 1 | 0 |
| 7044 | 1 | 0 |
| 7045 | 1 | 0 |
| 7046 | 1 | 0 |
| 7047 | 1 | 0 |
| 7048 | 1 | 0 |
| 7049 | 1 | 0 |
| 7050 | 1 | 0 |
| 7051 | 1 | 0 |
| 7052 | 1 | 0 |
| 7053 | 1 | 0 |
| 7054 | 1 | 0 |
| 7055 | 1 | 0 |
| 7056 | 1 | 0 |
| 7057 | 1 | 0 |
| 7058 | 1 | 0 |
| 7059 | 1 | 0 |
| 7060 | 1 | 0 |
| 7061 | 1 | 0 |
| 7062 | 1 | 0 |
| 7063 | 1 | 0 |
| 7064 | 1 | 0 |
| 7065 | 1 | 0 |
| 7066 | 1 | 0 |
| 7067 | 1 | 0 |
| 7068 | 1 | 0 |
| 7069 | 1 | 0 |
| 7070 | 1 | 0 |
| 7071 | 1 | 0 |
| 7072 | 1 | 0 |
| 7073 | 1 | 0 |
| 7074 | 1 | 0 |
| 7075 | 1 | 0 |
| 7076 | 1 | 0 |
| 7077 | 1 | 0 |
| 7078 | 1 | 0 |
| 7079 | 1 | 0 |
| 7080 | 1 | 0 |
| 7081 | 1 | 0 |
| 7082 | 1 | 0 |
| 7083 | 1 | 0 |
| 7084 | 1 | 0 |
| 7085 | 1 | 0 |
| 7086 | 1 | 0 |
| 7087 | 1 | 0 |
| 7088 | 1 | 0 |
| 7089 | 1 | 0 |
| 7090 | 1 | 0 |
| 7091 | 1 | 0 |
| 7092 | 1 | 0 |
| 7093 | 1 | 0 |
| 7094 | 1 | 0 |
| 7095 | 1 | 0 |
| 7096 | 1 | 0 |
| 7097 | 1 | 0 |
| 7098 | 1 | 0 |
| 7099 | 1 | 0 |
| 7100 | 1 | 0 |
| 7101 | 1 | 0 |
| 7102 | 1 | 0 |
| 7103 | 1 | 0 |
| 7104 | 1 | 0 |
| 7105 | 1 | 0 |
| 7106 | 1 | 0 |
| 7107 | 1 | 0 |
| 7108 | 1 | 0 |
| 7109 | 1 | 0 |
| 7110 | 1 | 0 |
| 7111 | 1 | 0 |
| 7112 | 1 | 0 |
| 7113 | 1 | 0 |
| 7114 | 1 | 0 |
| 7115 | 1 | 0 |
| 7116 | 1 | 0 |
| 7117 | 1 | 0 |
| 7118 | 1 | 0 |
| 7119 | 1 | 0 |
| 7120 | 1 | 0 |
| 7121 | 1 | 0 |
| 7122 | 1 | 0 |
| 7123 | 1 | 0 |
| 7124 | 1 | 0 |
| 7125 | 1 | 0 |
| 7126 | 1 | 0 |
| 7127 | 1 | 0 |
| 7128 | 1 | 0 |
| 7129 | 1 | 0 |
| 7130 | 1 | 0 |
| 7131 | 1 | 0 |
| 7132 | 1 | 0 |
| 7133 | 1 | 0 |
| 7134 | 1 | 0 |
| 7135 | 1 | 0 |
| 7136 | 1 | 0 |
| 7137 | 1 | 0 |
| 7138 | 1 | 0 |
| 7139 | 1 | 0 |
| 7140 | 1 | 0 |
| 7141 | 1 | 0 |
| 7142 | 1 | 0 |
| 7143 | 1 | 0 |
| 7144 | 1 | 0 |
| 7145 | 1 | 0 |
| 7146 | 1 | 0 |
| 7147 | 1 | 0 |
| 7148 | 1 | 0 |
| 7149 | 1 | 0 |
| 7150 | 1 | 0 |
| 7151 | 1 | 0 |
| 7152 | 1 | 0 |
| 7153 | 1 | 0 |
| 7154 | 1 | 0 |
| 7155 | 1 | 0 |
| 7156 | 1 | 0 |
| 7157 | 1 | 0 |
| 7158 | 1 | 0 |
| 7159 | 1 | 0 |
| 7160 | 1 | 0 |
| 7161 | 1 | 0 |
| 7162 | 1 | 0 |
| 7163 | 1 | 0 |
| 7164 | 1 | 0 |
| 7165 | 1 | 0 |
| 7166 | 1 | 0 |
| 7167 | 1 | 0 |
| 7168 | 1 | 0 |
| 7169 | 1 | 0 |
| 7170 | 1 | 0 |
| 7171 | 1 | 0 |
| 7172 | 1 | 0 |
| 7173 | 1 | 0 |
| 7174 | 1 | 0 |
| 7175 | 1 | 0 |
| 7176 | 1 | 0 |
| 7177 | 1 | 0 |
| 7178 | 1 | 0 |
| 7179 | 1 | 0 |
| 7180 | 1 | 0 |
| 7181 | 1 | 0 |
| 7182 | 1 | 0 |
| 7183 | 1 | 0 |
| 7184 | 1 | 0 |
| 7185 | 1 | 0 |
| 7186 | 1 | 0 |
| 7187 | 1 | 0 |
| 7188 | 1 | 0 |
| 7189 | 1 | 0 |
| 7190 | 1 | 0 |
| 7191 | 1 | 0 |
| 7192 | 1 | 0 |
| 7193 | 1 | 0 |
| 7194 | 1 | 0 |
| 7195 | 1 | 0 |
| 7196 | 1 | 0 |
| 7197 | 1 | 0 |
| 7198 | 1 | 0 |
| 7199 | 1 | 0 |
| 7200 | 1 | 0 |
| 7201 | 1 | 0 |
| 7202 | 1 | 0 |
| 7203 | 1 | 0 |
| 7204 | 1 | 0 |
| 7205 | 1 | 0 |
| 7206 | 1 | 0 |
| 7207 | 1 | 0 |
| 7208 | 1 | 0 |
| 7209 | 1 | 0 |
| 7210 | 1 | 0 |
| 7211 | 1 | 0 |
| 7212 | 1 | 0 |
| 7213 | 1 | 0 |
| 7214 | 1 | 0 |
| 7215 | 1 | 0 |
| 7216 | 1 | 0 |
| 7217 | 1 | 0 |
| 7218 | 1 | 0 |
| 7219 | 1 | 0 |
| 7220 | 1 | 0 |
| 7221 | 1 | 0 |
| 7222 | 1 | 0 |
| 7223 | 1 | 0 |
| 7224 | 1 | 0 |
| 7225 | 1 | 0 |
| 7226 | 1 | 0 |
| 7227 | 1 | 0 |
| 7228 | 1 | 0 |
| 7229 | 1 | 0 |
| 7230 | 1 | 0 |
| 7231 | 1 | 0 |
| 7232 | 1 | 0 |
| 7233 | 1 | 0 |
| 7234 | 1 | 0 |
| 7235 | 1 | 0 |
| 7236 | 1 | 0 |
| 7237 | 1 | 0 |
| 7238 | 1 | 0 |
| 7239 | 1 | 0 |
| 7240 | 1 | 0 |
| 7241 | 1 | 0 |
| 7242 | 1 | 0 |
| 7243 | 1 | 0 |
| 7244 | 1 | 0 |
| 7245 | 1 | 0 |
| 7246 | 1 | 0 |
| 7247 | 1 | 0 |
| 7248 | 1 | 0 |
| 7249 | 1 | 0 |
| 7250 | 1 | 0 |
| 7251 | 1 | 0 |
| 7252 | 1 | 0 |
| 7253 | 1 | 0 |
| 7254 | 1 | 0 |
| 7255 | 1 | 0 |
| 7256 | 1 | 0 |
| 7257 | 1 | 0 |
| 7258 | 1 | 0 |
| 7259 | 1 | 0 |
| 7260 | 1 | 0 |
| 7261 | 1 | 0 |
| 7262 | 1 | 0 |
| 7263 | 1 | 0 |
| 7264 | 1 | 0 |
| 7265 | 1 | 0 |
| 7266 | 1 | 0 |
| 7267 | 1 | 0 |
| 7268 | 1 | 0 |
| 7269 | 1 | 0 |
| 7270 | 1 | 0 |
| 7271 | 1 | 0 |
| 7272 | 1 | 0 |
| 7273 | 1 | 0 |
| 7274 | 1 | 0 |
| 7275 | 1 | 0 |
| 7276 | 1 | 0 |
| 7277 | 1 | 0 |
| 7278 | 1 | 0 |
| 7279 | 1 | 0 |
| 7280 | 1 | 0 |
| 7281 | 1 | 0 |
| 7282 | 1 | 0 |
| 7283 | 1 | 0 |
| 7284 | 1 | 0 |
| 7285 | 1 | 0 |
| 7286 | 1 | 0 |
| 7287 | 1 | 0 |
| 7288 | 1 | 0 |
| 7289 | 1 | 0 |
| 7290 | 1 | 0 |
| 7291 | 1 | 0 |
| 7292 | 1 | 0 |
| 7293 | 1 | 0 |
| 7294 | 1 | 0 |
| 7295 | 1 | 0 |
| 7296 | 1 | 0 |
| 7297 | 1 | 0 |
| 7298 | 1 | 0 |
| 7299 | 1 | 0 |
| 7300 | 1 | 0 |
| 7301 | 1 | 0 |
| 7302 | 1 | 0 |
| 7303 | 1 | 0 |
| 7304 | 1 | 0 |
| 7305 | 1 | 0 |
| 7306 | 1 | 0 |
| 7307 | 1 | 0 |
| 7308 | 1 | 0 |
| 7309 | 1 | 0 |
| 7310 | 1 | 0 |
| 7311 | 1 | 0 |
| 7312 | 1 | 0 |
| 7313 | 1 | 0 |
| 7314 | 1 | 0 |
| 7315 | 1 | 0 |
| 7316 | 1 | 0 |
| 7317 | 1 | 0 |
| 7318 | 1 | 0 |
| 7319 | 1 | 0 |
| 7320 | 1 | 0 |
| 7321 | 1 | 0 |
| 7322 | 1 | 0 |
| 7323 | 1 | 0 |
| 7324 | 1 | 0 |
| 7325 | 1 | 0 |
| 7326 | 1 | 0 |
| 7327 | 1 | 0 |
| 7328 | 1 | 0 |
| 7329 | 1 | 0 |
| 7330 | 1 | 0 |
| 7331 | 1 | 0 |
| 7332 | 1 | 0 |
| 7333 | 1 | 0 |
| 7334 | 1 | 0 |
| 7335 | 1 | 0 |
| 7336 | 1 | 0 |
| 7337 | 1 | 0 |
| 7338 | 1 | 0 |
| 7339 | 1 | 0 |
| 7340 | 1 | 0 |
| 7341 | 1 | 0 |
| 7342 | 1 | 0 |
| 7343 | 1 | 0 |
| 7344 | 1 | 0 |
| 7345 | 1 | 0 |
| 7346 | 1 | 0 |
| 7347 | 1 | 0 |
| 7348 | 1 | 0 |
| 7349 | 1 | 0 |
| 7350 | 1 | 0 |
| 7351 | 1 | 0 |
| 7352 | 1 | 0 |
| 7353 | 1 | 0 |
| 7354 | 1 | 0 |
| 7355 | 1 | 0 |
| 7356 | 1 | 0 |
| 7357 | 1 | 0 |
| 7358 | 1 | 0 |
| 7359 | 1 | 0 |
| 7360 | 1 | 0 |
| 7361 | 1 | 0 |
| 7362 | 1 | 0 |
| 7363 | 1 | 0 |
| 7364 | 1 | 0 |
| 7365 | 1 | 0 |
| 7366 | 1 | 0 |
| 7367 | 1 | 0 |
| 7368 | 1 | 0 |
| 7369 | 1 | 0 |
| 7370 | 1 | 0 |
| 7371 | 1 | 0 |
| 7372 | 1 | 0 |
| 7373 | 1 | 0 |
| 7374 | 1 | 0 |
| 7375 | 1 | 0 |
| 7376 | 1 | 0 |
| 7377 | 1 | 0 |
| 7378 | 1 | 0 |
| 7379 | 1 | 0 |
| 7380 | 1 | 0 |
| 7381 | 1 | 0 |
| 7382 | 1 | 0 |
| 7383 | 1 | 0 |
| 7384 | 1 | 0 |
| 7385 | 1 | 0 |
| 7386 | 1 | 0 |
| 7387 | 1 | 0 |
| 7388 | 1 | 0 |
| 7389 | 1 | 0 |
| 7390 | 1 | 0 |
| 7391 | 1 | 0 |
| 7392 | 1 | 0 |
| 7393 | 1 | 0 |
| 7394 | 1 | 0 |
| 7395 | 1 | 0 |
| 7396 | 1 | 0 |
| 7397 | 1 | 0 |
| 7398 | 1 | 0 |
| 7399 | 1 | 0 |
| 7400 | 1 | 0 |
| 7401 | 1 | 0 |
| 7402 | 1 | 0 |
| 7403 | 1 | 0 |
| 7404 | 1 | 0 |
| 7405 | 1 | 0 |
| 7406 | 1 | 0 |
| 7407 | 1 | 0 |
| 7408 | 1 | 0 |
| 7409 | 1 | 0 |
| 7410 | 1 | 0 |
| 7411 | 1 | 0 |
| 7412 | 1 | 0 |
| 7413 | 1 | 0 |
| 7414 | 1 | 0 |
| 7415 | 1 | 0 |
| 7416 | 1 | 0 |
| 7417 | 1 | 0 |
| 7418 | 1 | 0 |
| 7419 | 1 | 0 |
| 7420 | 1 | 0 |
| 7421 | 1 | 0 |
| 7422 | 1 | 0 |
| 7423 | 1 | 0 |
| 7424 | 1 | 0 |
| 7425 | 1 | 0 |
| 7426 | 1 | 0 |
| 7427 | 1 | 0 |
| 7428 | 1 | 0 |
| 7429 | 1 | 0 |
| 7430 | 1 | 0 |
| 7431 | 1 | 0 |
| 7432 | 1 | 0 |
| 7433 | 1 | 0 |
| 7434 | 1 | 0 |
| 7435 | 1 | 0 |
| 7436 | 1 | 0 |
| 7437 | 1 | 0 |
| 7438 | 1 | 0 |
| 7439 | 1 | 0 |
| 7440 | 1 | 0 |
| 7441 | 1 | 0 |
| 7442 | 1 | 0 |
| 7443 | 1 | 0 |
| 7444 | 1 | 0 |
| 7445 | 1 | 0 |
| 7446 | 1 | 0 |
| 7447 | 1 | 0 |
| 7448 | 1 | 0 |
| 7449 | 1 | 0 |
| 7450 | 1 | 0 |
| 7451 | 1 | 0 |
| 7452 | 1 | 0 |
| 7453 | 1 | 0 |
| 7454 | 1 | 0 |
| 7455 | 1 | 0 |
| 7456 | 1 | 0 |
| 7457 | 1 | 0 |
| 7458 | 1 | 0 |
| 7459 | 1 | 0 |
| 7460 | 1 | 0 |
| 7461 | 1 | 0 |
| 7462 | 1 | 0 |
| 7463 | 1 | 0 |
| 7464 | 1 | 0 |
| 7465 | 1 | 0 |
| 7466 | 1 | 0 |
| 7467 | 1 | 0 |
| 7468 | 1 | 0 |
| 7469 | 1 | 0 |
| 7470 | 1 | 0 |
| 7471 | 1 | 0 |
| 7472 | 1 | 0 |
| 7473 | 1 | 0 |
| 7474 | 1 | 0 |
| 7475 | 1 | 0 |
| 7476 | 1 | 0 |
| 7477 | 1 | 0 |
| 7478 | 1 | 0 |
| 7479 | 1 | 0 |
| 7480 | 1 | 0 |
| 7481 | 1 | 0 |
| 7482 | 1 | 0 |
| 7483 | 1 | 0 |
| 7484 | 1 | 0 |
| 7485 | 1 | 0 |
| 7486 | 1 | 0 |
| 7487 | 1 | 0 |
| 7488 | 1 | 0 |
| 7489 | 1 | 0 |
| 7490 | 1 | 0 |
| 7491 | 1 | 0 |
| 7492 | 1 | 0 |
| 7493 | 1 | 0 |
| 7494 | 1 | 0 |
| 7495 | 1 | 0 |
| 7496 | 1 | 0 |
| 7497 | 1 | 0 |
| 7498 | 1 | 0 |
| 7499 | 1 | 0 |
| 7500 | 1 | 0 |
| 7501 | 1 | 0 |
| 7502 | 1 | 0 |
| 7503 | 1 | 0 |
| 7504 | 1 | 0 |
| 7505 | 1 | 0 |
| 7506 | 1 | 0 |
| 7507 | 1 | 0 |
| 7508 | 1 | 0 |
| 7509 | 1 | 0 |
| 7510 | 1 | 0 |
| 7511 | 1 | 0 |
| 7512 | 1 | 0 |
| 7513 | 1 | 0 |
| 7514 | 1 | 0 |
| 7515 | 1 | 0 |
| 7516 | 1 | 0 |
| 7517 | 1 | 0 |
| 7518 | 1 | 0 |
| 7519 | 1 | 0 |
| 7520 | 1 | 0 |
| 7521 | 1 | 0 |
| 7522 | 1 | 0 |
| 7523 | 1 | 0 |
| 7524 | 1 | 0 |
| 7525 | 1 | 0 |
| 7526 | 1 | 0 |
| 7527 | 1 | 0 |
| 7528 | 1 | 0 |
| 7529 | 1 | 0 |
| 7530 | 1 | 0 |
| 7531 | 1 | 0 |
| 7532 | 1 | 0 |
| 7533 | 1 | 0 |
| 7534 | 1 | 0 |
| 7535 | 1 | 0 |
| 7536 | 1 | 0 |
| 7537 | 1 | 0 |
| 7538 | 1 | 0 |
| 7539 | 1 | 0 |
| 7540 | 1 | 0 |
| 7541 | 1 | 0 |
| 7542 | 1 | 0 |
| 7543 | 1 | 0 |
| 7544 | 1 | 0 |
| 7545 | 1 | 0 |
| 7546 | 1 | 0 |
| 7547 | 1 | 0 |
| 7548 | 1 | 0 |
| 7549 | 1 | 0 |
| 7550 | 1 | 0 |
| 7551 | 1 | 0 |
| 7552 | 1 | 0 |
| 7553 | 1 | 0 |
| 7554 | 1 | 0 |
| 7555 | 1 | 0 |
| 7556 | 1 | 0 |
| 7557 | 1 | 0 |
| 7558 | 1 | 0 |
| 7559 | 1 | 0 |
| 7560 | 1 | 0 |
| 7561 | 1 | 0 |
| 7562 | 1 | 0 |
| 7563 | 1 | 0 |
| 7564 | 1 | 0 |
| 7565 | 1 | 0 |
| 7566 | 1 | 0 |
| 7567 | 1 | 0 |
| 7568 | 1 | 0 |
| 7569 | 1 | 0 |
| 7570 | 1 | 0 |
| 7571 | 1 | 0 |
| 7572 | 1 | 0 |
| 7573 | 1 | 0 |
| 7574 | 1 | 0 |
| 7575 | 1 | 0 |
| 7576 | 1 | 0 |
| 7577 | 1 | 0 |
| 7578 | 1 | 0 |
| 7579 | 1 | 0 |
| 7580 | 1 | 0 |
| 7581 | 1 | 0 |
| 7582 | 1 | 0 |
| 7583 | 1 | 0 |
| 7584 | 1 | 0 |
| 7585 | 1 | 0 |
| 7586 | 1 | 0 |
| 7587 | 1 | 0 |
| 7588 | 1 | 0 |
| 7589 | 1 | 0 |
| 7590 | 1 | 0 |
| 7591 | 1 | 0 |
| 7592 | 1 | 0 |
| 7593 | 1 | 0 |
| 7594 | 1 | 0 |
| 7595 | 1 | 0 |
| 7596 | 1 | 0 |
| 7597 | 1 | 0 |
| 7598 | 1 | 0 |
| 7599 | 1 | 0 |
| 7600 | 1 | 0 |
| 7601 | 1 | 0 |
| 7602 | 1 | 0 |
| 7603 | 1 | 0 |
| 7604 | 1 | 0 |
| 7605 | 1 | 0 |
| 7606 | 1 | 0 |
| 7607 | 1 | 0 |
| 7608 | 1 | 0 |
| 7609 | 1 | 0 |
| 7610 | 1 | 0 |
| 7611 | 1 | 0 |
| 7612 | 1 | 0 |
| 7613 | 1 | 0 |
| 7614 | 1 | 0 |
| 7615 | 1 | 0 |
| 7616 | 1 | 0 |
| 7617 | 1 | 0 |
| 7618 | 1 | 0 |
| 7619 | 1 | 0 |
| 7620 | 1 | 0 |
| 7621 | 1 | 0 |
| 7622 | 1 | 0 |
| 7623 | 1 | 0 |
| 7624 | 1 | 0 |
| 7625 | 1 | 0 |
| 7626 | 1 | 0 |
| 7627 | 1 | 0 |
| 7628 | 1 | 0 |
| 7629 | 1 | 0 |
| 7630 | 1 | 0 |
| 7631 | 1 | 0 |
| 7632 | 1 | 0 |
| 7633 | 1 | 0 |
| 7634 | 1 | 0 |
| 7635 | 1 | 0 |
| 7636 | 1 | 0 |
| 7637 | 1 | 0 |
| 7638 | 1 | 0 |
| 7639 | 1 | 0 |
| 7640 | 1 | 0 |
| 7641 | 1 | 0 |
| 7642 | 1 | 0 |
| 7643 | 1 | 0 |
| 7644 | 1 | 0 |
| 7645 | 1 | 0 |
| 7646 | 1 | 0 |
| 7647 | 1 | 0 |
| 7648 | 1 | 0 |
| 7649 | 1 | 0 |
| 7650 | 1 | 0 |
| 7651 | 1 | 0 |
| 7652 | 1 | 0 |
| 7653 | 1 | 0 |
| 7654 | 1 | 0 |
| 7655 | 1 | 0 |
| 7656 | 1 | 0 |
| 7657 | 1 | 0 |
| 7658 | 1 | 0 |
| 7659 | 1 | 0 |
| 7660 | 1 | 0 |
| 7661 | 1 | 0 |
| 7662 | 1 | 0 |
| 7663 | 1 | 0 |
| 7664 | 1 | 0 |
| 7665 | 1 | 0 |
| 7666 | 1 | 0 |
| 7667 | 1 | 0 |
| 7668 | 1 | 0 |
| 7669 | 1 | 0 |
| 7670 | 1 | 0 |
| 7671 | 1 | 0 |
| 7672 | 1 | 0 |
| 7673 | 1 | 0 |
| 7674 | 1 | 0 |
| 7675 | 1 | 0 |
| 7676 | 1 | 0 |
| 7677 | 1 | 0 |
| 7678 | 1 | 0 |
| 7679 | 1 | 0 |
| 7680 | 1 | 0 |
| 7681 | 1 | 0 |
| 7682 | 1 | 0 |
| 7683 | 1 | 0 |
| 7684 | 1 | 0 |
| 7685 | 1 | 0 |
| 7686 | 1 | 0 |
| 7687 | 1 | 0 |
| 7688 | 1 | 0 |
| 7689 | 1 | 0 |
| 7690 | 1 | 0 |
| 7691 | 1 | 0 |
| 7692 | 1 | 0 |
| 7693 | 1 | 0 |
| 7694 | 1 | 0 |
| 7695 | 1 | 0 |
| 7696 | 1 | 0 |
| 7697 | 1 | 0 |
| 7698 | 1 | 0 |
| 7699 | 1 | 0 |
| 7700 | 1 | 0 |
| 7701 | 1 | 0 |
| 7702 | 1 | 0 |
| 7703 | 1 | 0 |
| 7704 | 1 | 0 |
| 7705 | 1 | 0 |
| 7706 | 1 | 0 |
| 7707 | 1 | 0 |
| 7708 | 1 | 0 |
| 7709 | 1 | 0 |
| 7710 | 1 | 0 |
| 7711 | 1 | 0 |
| 7712 | 1 | 0 |
| 7713 | 1 | 0 |
| 7714 | 1 | 0 |
| 7715 | 1 | 0 |
| 7716 | 1 | 0 |
| 7717 | 1 | 0 |
| 7718 | 1 | 0 |
| 7719 | 1 | 0 |
| 7720 | 1 | 0 |
| 7721 | 1 | 0 |
| 7722 | 1 | 0 |
| 7723 | 1 | 0 |
| 7724 | 1 | 0 |
| 7725 | 1 | 0 |
| 7726 | 1 | 0 |
| 7727 | 1 | 0 |
| 7728 | 1 | 0 |
| 7729 | 1 | 0 |
| 7730 | 1 | 0 |
| 7731 | 1 | 0 |
| 7732 | 1 | 0 |
| 7733 | 1 | 0 |
| 7734 | 1 | 0 |
| 7735 | 1 | 0 |
| 7736 | 1 | 0 |
| 7737 | 1 | 0 |
| 7738 | 1 | 0 |
| 7739 | 1 | 0 |
| 7740 | 1 | 0 |
| 7741 | 1 | 0 |
| 7742 | 1 | 0 |
| 7743 | 1 | 0 |
| 7744 | 1 | 0 |
| 7745 | 1 | 0 |
| 7746 | 1 | 0 |
| 7747 | 1 | 0 |
| 7748 | 1 | 0 |
| 7749 | 1 | 0 |
| 7750 | 1 | 0 |
| 7751 | 1 | 0 |
| 7752 | 1 | 0 |
| 7753 | 1 | 0 |
| 7754 | 1 | 0 |
| 7755 | 1 | 0 |
| 7756 | 1 | 0 |
| 7757 | 1 | 0 |
| 7758 | 1 | 0 |
| 7759 | 1 | 0 |
| 7760 | 1 | 0 |
| 7761 | 1 | 0 |
| 7762 | 1 | 0 |
| 7763 | 1 | 0 |
| 7764 | 1 | 0 |
| 7765 | 1 | 0 |
| 7766 | 1 | 0 |
| 7767 | 1 | 0 |
| 7768 | 1 | 0 |
| 7769 | 1 | 0 |
| 7770 | 1 | 0 |
| 7771 | 1 | 0 |
| 7772 | 1 | 0 |
| 7773 | 1 | 0 |
| 7774 | 1 | 0 |
| 7775 | 1 | 0 |
| 7776 | 1 | 0 |
| 7777 | 1 | 0 |
| 7778 | 1 | 0 |
| 7779 | 1 | 0 |
| 7780 | 1 | 0 |
| 7781 | 1 | 0 |
| 7782 | 1 | 0 |
| 7783 | 1 | 0 |
| 7784 | 1 | 0 |
| 7785 | 1 | 0 |
| 7786 | 1 | 0 |
| 7787 | 1 | 0 |
| 7788 | 1 | 0 |
| 7789 | 1 | 0 |
| 7790 | 1 | 0 |
| 7791 | 1 | 0 |
| 7792 | 1 | 0 |
| 7793 | 1 | 0 |
| 7794 | 1 | 0 |
| 7795 | 1 | 0 |
| 7796 | 1 | 0 |
| 7797 | 1 | 0 |
| 7798 | 1 | 0 |
| 7799 | 1 | 0 |
| 7800 | 1 | 0 |
| 7801 | 1 | 0 |
| 7802 | 1 | 0 |
| 7803 | 1 | 0 |
| 7804 | 1 | 0 |
| 7805 | 1 | 0 |
| 7806 | 1 | 0 |
| 7807 | 1 | 0 |
| 7808 | 1 | 0 |
| 7809 | 1 | 0 |
| 7810 | 1 | 0 |
| 7811 | 1 | 0 |
| 7812 | 1 | 0 |
| 7813 | 1 | 0 |
| 7814 | 1 | 0 |
| 7815 | 1 | 0 |
| 7816 | 1 | 0 |
| 7817 | 1 | 0 |
| 7818 | 1 | 0 |
| 7819 | 1 | 0 |
| 7820 | 1 | 0 |
| 7821 | 1 | 0 |
| 7822 | 1 | 0 |
| 7823 | 1 | 0 |
| 7824 | 1 | 0 |
| 7825 | 1 | 0 |
| 7826 | 1 | 0 |
| 7827 | 1 | 0 |
| 7828 | 1 | 0 |
| 7829 | 1 | 0 |
| 7830 | 1 | 0 |
| 7831 | 1 | 0 |
| 7832 | 1 | 0 |
| 7833 | 1 | 0 |
| 7834 | 1 | 0 |
| 7835 | 1 | 0 |
| 7836 | 1 | 0 |
| 7837 | 1 | 0 |
| 7838 | 1 | 0 |
| 7839 | 1 | 0 |
| 7840 | 1 | 0 |
| 7841 | 1 | 0 |
| 7842 | 1 | 0 |
| 7843 | 1 | 0 |
| 7844 | 1 | 0 |
| 7845 | 1 | 0 |
| 7846 | 1 | 0 |
| 7847 | 1 | 0 |
| 7848 | 1 | 0 |
| 7849 | 1 | 0 |
| 7850 | 1 | 0 |
| 7851 | 1 | 0 |
| 7852 | 1 | 0 |
| 7853 | 1 | 0 |
| 7854 | 1 | 0 |
| 7855 | 1 | 0 |
| 7856 | 1 | 0 |
| 7857 | 1 | 0 |
| 7858 | 1 | 0 |
| 7859 | 1 | 0 |
| 7860 | 1 | 0 |
| 7861 | 1 | 0 |
| 7862 | 1 | 0 |
| 7863 | 1 | 0 |
| 7864 | 1 | 0 |
| 7865 | 1 | 0 |
| 7866 | 1 | 0 |
| 7867 | 1 | 0 |
| 7868 | 1 | 0 |
| 7869 | 1 | 0 |
| 7870 | 1 | 0 |
| 7871 | 1 | 0 |
| 7872 | 1 | 0 |
| 7873 | 1 | 0 |
| 7874 | 1 | 0 |
| 7875 | 1 | 0 |
| 7876 | 1 | 0 |
| 7877 | 1 | 0 |
| 7878 | 1 | 0 |
| 7879 | 1 | 0 |
| 7880 | 1 | 0 |
| 7881 | 1 | 0 |
| 7882 | 1 | 0 |
| 7883 | 1 | 0 |
| 7884 | 1 | 0 |
| 7885 | 1 | 0 |
| 7886 | 1 | 0 |
| 7887 | 1 | 0 |
| 7888 | 1 | 0 |
| 7889 | 1 | 0 |
| 7890 | 1 | 0 |
| 7891 | 1 | 0 |
| 7892 | 1 | 0 |
| 7893 | 1 | 0 |
| 7894 | 1 | 0 |
| 7895 | 1 | 0 |
| 7896 | 1 | 0 |
| 7897 | 1 | 0 |
| 7898 | 1 | 0 |
| 7899 | 1 | 0 |
| 7900 | 1 | 0 |
| 7901 | 1 | 0 |
| 7902 | 1 | 0 |
| 7903 | 1 | 0 |
| 7904 | 1 | 0 |
| 7905 | 1 | 0 |
| 7906 | 1 | 0 |
| 7907 | 1 | 0 |
| 7908 | 1 | 0 |
| 7909 | 1 | 0 |
| 7910 | 1 | 0 |
| 7911 | 1 | 0 |
| 7912 | 1 | 0 |
| 7913 | 1 | 0 |
| 7914 | 1 | 0 |
| 7915 | 1 | 0 |
| 7916 | 1 | 0 |
| 7917 | 1 | 0 |
| 7918 | 1 | 0 |
| 7919 | 1 | 0 |
| 7920 | 1 | 0 |
| 7921 | 1 | 0 |
| 7922 | 1 | 0 |
| 7923 | 1 | 0 |
| 7924 | 1 | 0 |
| 7925 | 1 | 0 |
| 7926 | 1 | 0 |
| 7927 | 1 | 0 |
| 7928 | 1 | 0 |
| 7929 | 1 | 0 |
| 7930 | 1 | 0 |
| 7931 | 1 | 0 |
| 7932 | 1 | 0 |
| 7933 | 1 | 0 |
| 7934 | 1 | 0 |
| 7935 | 1 | 0 |
| 7936 | 1 | 0 |
| 7937 | 1 | 0 |
| 7938 | 1 | 0 |
| 7939 | 1 | 0 |
| 7940 | 1 | 0 |
| 7941 | 1 | 0 |
| 7942 | 1 | 0 |
| 7943 | 1 | 0 |
| 7944 | 1 | 0 |
| 7945 | 1 | 0 |
| 7946 | 1 | 0 |
| 7947 | 1 | 0 |
| 7948 | 1 | 0 |
| 7949 | 1 | 0 |
| 7950 | 1 | 0 |
| 7951 | 1 | 0 |
| 7952 | 1 | 0 |
| 7953 | 1 | 0 |
| 7954 | 1 | 0 |
| 7955 | 1 | 0 |
| 7956 | 1 | 0 |
| 7957 | 1 | 0 |
| 7958 | 1 | 0 |
| 7959 | 1 | 0 |
| 7960 | 1 | 0 |
| 7961 | 1 | 0 |
| 7962 | 1 | 0 |
| 7963 | 1 | 0 |
| 7964 | 1 | 0 |
| 7965 | 1 | 0 |
| 7966 | 1 | 0 |
| 7967 | 1 | 0 |
| 7968 | 1 | 0 |
| 7969 | 1 | 0 |
| 7970 | 1 | 0 |
| 7971 | 1 | 0 |
| 7972 | 1 | 0 |
| 7973 | 1 | 0 |
| 7974 | 1 | 0 |
| 7975 | 1 | 0 |
| 7976 | 1 | 0 |
| 7977 | 1 | 0 |
| 7978 | 1 | 0 |
| 7979 | 1 | 0 |
| 7980 | 1 | 0 |
| 7981 | 1 | 0 |
| 7982 | 1 | 0 |
| 7983 | 1 | 0 |
| 7984 | 1 | 0 |
| 7985 | 1 | 0 |
| 7986 | 1 | 0 |
| 7987 | 1 | 0 |
| 7988 | 1 | 0 |
| 7989 | 1 | 0 |
| 7990 | 1 | 0 |
| 7991 | 1 | 0 |
| 7992 | 1 | 0 |
| 7993 | 1 | 0 |
| 7994 | 1 | 0 |
| 7995 | 1 | 0 |
| 7996 | 1 | 0 |
| 7997 | 1 | 0 |
| 7998 | 1 | 0 |
| 7999 | 1 | 0 |
| 8000 | 1 | 0 |
| 8001 | 1 | 0 |
| 8002 | 1 | 0 |
| 8003 | 1 | 0 |
| 8004 | 1 | 0 |
| 8005 | 1 | 0 |
| 8006 | 1 | 0 |
| 8007 | 1 | 0 |
| 8008 | 1 | 0 |
| 8009 | 1 | 0 |
| 8010 | 1 | 0 |
| 8011 | 1 | 0 |
| 8012 | 1 | 0 |
| 8013 | 1 | 0 |
| 8014 | 1 | 0 |
| 8015 | 1 | 0 |
| 8016 | 1 | 0 |
| 8017 | 1 | 0 |
| 8018 | 1 | 0 |
| 8019 | 1 | 0 |
| 8020 | 1 | 0 |
| 8021 | 1 | 0 |
| 8022 | 1 | 0 |
| 8023 | 1 | 0 |
| 8024 | 1 | 0 |
| 8025 | 1 | 0 |
| 8026 | 1 | 0 |
| 8027 | 1 | 0 |
| 8028 | 1 | 0 |
| 8029 | 1 | 0 |
| 8030 | 1 | 0 |
| 8031 | 1 | 0 |
| 8032 | 1 | 0 |
| 8033 | 1 | 0 |
| 8034 | 1 | 0 |
| 8035 | 1 | 0 |
| 8036 | 1 | 0 |
| 8037 | 1 | 0 |
| 8038 | 1 | 0 |
| 8039 | 1 | 0 |
| 8040 | 1 | 0 |
| 8041 | 1 | 0 |
| 8042 | 1 | 0 |
| 8043 | 1 | 0 |
| 8044 | 1 | 0 |
| 8045 | 1 | 0 |
| 8046 | 1 | 0 |
| 8047 | 1 | 0 |
| 8048 | 1 | 0 |
| 8049 | 1 | 0 |
| 8050 | 1 | 0 |
| 8051 | 1 | 0 |
| 8052 | 1 | 0 |
| 8053 | 1 | 0 |
| 8054 | 1 | 0 |
| 8055 | 1 | 0 |
| 8056 | 1 | 0 |
| 8057 | 1 | 0 |
| 8058 | 1 | 0 |
| 8059 | 1 | 0 |
| 8060 | 1 | 0 |
| 8061 | 1 | 0 |
| 8062 | 1 | 0 |
| 8063 | 1 | 0 |
| 8064 | 1 | 0 |
| 8065 | 1 | 0 |
| 8066 | 1 | 0 |
| 8067 | 1 | 0 |
| 8068 | 1 | 0 |
| 8069 | 1 | 0 |
| 8070 | 1 | 0 |
| 8071 | 1 | 0 |
| 8072 | 1 | 0 |
| 8073 | 1 | 0 |
| 8074 | 1 | 0 |
| 8075 | 1 | 0 |
| 8076 | 1 | 0 |
| 8077 | 1 | 0 |
| 8078 | 1 | 0 |
| 8079 | 1 | 0 |
| 8080 | 1 | 0 |
| 8081 | 1 | 0 |
| 8082 | 1 | 0 |
| 8083 | 1 | 0 |
| 8084 | 1 | 0 |
| 8085 | 1 | 0 |
| 8086 | 1 | 0 |
| 8087 | 1 | 0 |
| 8088 | 1 | 0 |
| 8089 | 1 | 0 |
| 8090 | 1 | 0 |
| 8091 | 1 | 0 |
| 8092 | 1 | 0 |
| 8093 | 1 | 0 |
| 8094 | 1 | 0 |
| 8095 | 1 | 0 |
| 8096 | 1 | 0 |
| 8097 | 1 | 0 |
| 8098 | 1 | 0 |
| 8099 | 1 | 0 |
| 8100 | 1 | 0 |
| 8101 | 1 | 0 |
| 8102 | 1 | 0 |
| 8103 | 1 | 0 |
| 8104 | 1 | 0 |
| 8105 | 1 | 0 |
| 8106 | 1 | 0 |
| 8107 | 1 | 0 |
| 8108 | 1 | 0 |
| 8109 | 1 | 0 |
| 8110 | 1 | 0 |
| 8111 | 1 | 0 |
| 8112 | 1 | 0 |
| 8113 | 1 | 0 |
| 8114 | 1 | 0 |
| 8115 | 1 | 0 |
| 8116 | 1 | 0 |
| 8117 | 1 | 0 |
| 8118 | 1 | 0 |
| 8119 | 1 | 0 |
| 8120 | 1 | 0 |
| 8121 | 1 | 0 |
| 8122 | 1 | 0 |
| 8123 | 1 | 0 |
| 8124 | 1 | 0 |
| 8125 | 1 | 0 |
| 8126 | 1 | 0 |
| 8127 | 1 | 0 |
| 8128 | 1 | 0 |
| 8129 | 1 | 0 |
| 8130 | 1 | 0 |
| 8131 | 1 | 0 |
| 8132 | 1 | 0 |
| 8133 | 1 | 0 |
| 8134 | 1 | 0 |
| 8135 | 1 | 0 |
| 8136 | 1 | 0 |
| 8137 | 1 | 0 |
| 8138 | 1 | 0 |
| 8139 | 1 | 0 |
| 8140 | 1 | 0 |
| 8141 | 1 | 0 |
| 8142 | 1 | 0 |
| 8143 | 1 | 0 |
| 8144 | 1 | 0 |
| 8145 | 1 | 0 |
| 8146 | 1 | 0 |
| 8147 | 1 | 0 |
| 8148 | 1 | 0 |
| 8149 | 1 | 0 |
| 8150 | 1 | 0 |
| 8151 | 1 | 0 |
| 8152 | 1 | 0 |
| 8153 | 1 | 0 |
| 8154 | 1 | 0 |
| 8155 | 1 | 0 |
| 8156 | 1 | 0 |
| 8157 | 1 | 0 |
| 8158 | 1 | 0 |
| 8159 | 1 | 0 |
| 8160 | 1 | 0 |
| 8161 | 1 | 0 |
| 8162 | 1 | 0 |
| 8163 | 1 | 0 |
| 8164 | 1 | 0 |
| 8165 | 1 | 0 |
| 8166 | 1 | 0 |
| 8167 | 1 | 0 |
| 8168 | 1 | 0 |
| 8169 | 1 | 0 |
| 8170 | 1 | 0 |
| 8171 | 1 | 0 |
| 8172 | 1 | 0 |
| 8173 | 1 | 0 |
| 8174 | 1 | 0 |
| 8175 | 1 | 0 |
| 8176 | 1 | 0 |
| 8177 | 1 | 0 |
| 8178 | 1 | 0 |
| 8179 | 1 | 0 |
| 8180 | 1 | 0 |
| 8181 | 1 | 0 |
| 8182 | 1 | 0 |
| 8183 | 1 | 0 |
| 8184 | 1 | 0 |
| 8185 | 1 | 0 |
| 8186 | 1 | 0 |
| 8187 | 1 | 0 |
| 8188 | 1 | 0 |
| 8189 | 1 | 0 |
| 8190 | 1 | 0 |
| 8191 | 1 | 0 |
| 8192 | 1 | 0 |
| 8193 | 1 | 0 |
| 8194 | 1 | 0 |
| 8195 | 1 | 0 |
| 8196 | 1 | 0 |
| 8197 | 1 | 0 |
| 8198 | 1 | 0 |
| 8199 | 1 | 0 |
| 8200 | 1 | 0 |
| 8201 | 1 | 0 |
| 8202 | 1 | 0 |
| 8203 | 1 | 0 |
| 8204 | 1 | 0 |
| 8205 | 1 | 0 |
| 8206 | 1 | 0 |
| 8207 | 1 | 0 |
| 8208 | 1 | 0 |
| 8209 | 1 | 0 |
| 8210 | 1 | 0 |
| 8211 | 1 | 0 |
| 8212 | 1 | 0 |
| 8213 | 1 | 0 |
| 8214 | 1 | 0 |
| 8215 | 1 | 0 |
| 8216 | 1 | 0 |
| 8217 | 1 | 0 |
| 8218 | 1 | 0 |
| 8219 | 1 | 0 |
| 8220 | 1 | 0 |
| 8221 | 1 | 0 |
| 8222 | 1 | 0 |
| 8223 | 1 | 0 |
| 8224 | 1 | 0 |
| 8225 | 1 | 0 |
| 8226 | 1 | 0 |
| 8227 | 1 | 0 |
| 8228 | 1 | 0 |
| 8229 | 1 | 0 |
| 8230 | 1 | 0 |
| 8231 | 1 | 0 |
| 8232 | 1 | 0 |
| 8233 | 1 | 0 |
| 8234 | 1 | 0 |
| 8235 | 1 | 0 |
| 8236 | 1 | 0 |
| 8237 | 1 | 0 |
| 8238 | 1 | 0 |
| 8239 | 1 | 0 |
| 8240 | 1 | 0 |
| 8241 | 1 | 0 |
| 8242 | 1 | 0 |
| 8243 | 1 | 0 |
| 8244 | 1 | 0 |
| 8245 | 1 | 0 |
| 8246 | 1 | 0 |
| 8247 | 1 | 0 |
| 8248 | 1 | 0 |
| 8249 | 1 | 0 |
| 8250 | 1 | 0 |
| 8251 | 1 | 0 |
| 8252 | 1 | 0 |
| 8253 | 1 | 0 |
| 8254 | 1 | 0 |
| 8255 | 1 | 0 |
| 8256 | 1 | 0 |
| 8257 | 1 | 0 |
| 8258 | 1 | 0 |
| 8259 | 1 | 0 |
| 8260 | 1 | 0 |
| 8261 | 1 | 0 |
| 8262 | 1 | 0 |
| 8263 | 1 | 0 |
| 8264 | 1 | 0 |
| 8265 | 1 | 0 |
| 8266 | 1 | 0 |
| 8267 | 1 | 0 |
| 8268 | 1 | 0 |
| 8269 | 1 | 0 |
| 8270 | 1 | 0 |
| 8271 | 1 | 0 |
| 8272 | 1 | 0 |
| 8273 | 1 | 0 |
| 8274 | 1 | 0 |
| 8275 | 1 | 0 |
| 8276 | 1 | 0 |
| 8277 | 1 | 0 |
| 8278 | 1 | 0 |
| 8279 | 1 | 0 |
| 8280 | 1 | 0 |
| 8281 | 1 | 0 |
| 8282 | 1 | 0 |
| 8283 | 1 | 0 |
| 8284 | 1 | 0 |
| 8285 | 1 | 0 |
| 8286 | 1 | 0 |
| 8287 | 1 | 0 |
| 8288 | 1 | 0 |
| 8289 | 1 | 0 |
| 8290 | 1 | 0 |
| 8291 | 1 | 0 |
| 8292 | 1 | 0 |
| 8293 | 1 | 0 |
| 8294 | 1 | 0 |
| 8295 | 1 | 0 |
| 8296 | 1 | 0 |
| 8297 | 1 | 0 |
| 8298 | 1 | 0 |
| 8299 | 1 | 0 |
| 8300 | 1 | 0 |
| 8301 | 1 | 0 |
| 8302 | 1 | 0 |
| 8303 | 1 | 0 |
| 8304 | 1 | 0 |
| 8305 | 1 | 0 |
| 8306 | 1 | 0 |
| 8307 | 1 | 0 |
| 8308 | 1 | 0 |
| 8309 | 1 | 0 |
| 8310 | 1 | 0 |
| 8311 | 1 | 0 |
| 8312 | 1 | 0 |
| 8313 | 1 | 0 |
| 8314 | 1 | 0 |
| 8315 | 1 | 0 |
| 8316 | 1 | 0 |
| 8317 | 1 | 0 |
| 8318 | 1 | 0 |
| 8319 | 1 | 0 |
| 8320 | 1 | 0 |
| 8321 | 1 | 0 |
| 8322 | 1 | 0 |
| 8323 | 1 | 0 |
| 8324 | 1 | 0 |
| 8325 | 1 | 0 |
| 8326 | 1 | 0 |
| 8327 | 1 | 0 |
| 8328 | 1 | 0 |
| 8329 | 1 | 0 |
| 8330 | 1 | 0 |
| 8331 | 1 | 0 |
| 8332 | 1 | 0 |
| 8333 | 1 | 0 |
| 8334 | 1 | 0 |
| 8335 | 1 | 0 |
| 8336 | 1 | 0 |
| 8337 | 1 | 0 |
| 8338 | 1 | 0 |
| 8339 | 1 | 0 |
| 8340 | 1 | 0 |
| 8341 | 1 | 0 |
| 8342 | 1 | 0 |
| 8343 | 1 | 0 |
| 8344 | 1 | 0 |
| 8345 | 1 | 0 |
| 8346 | 1 | 0 |
| 8347 | 1 | 0 |
| 8348 | 1 | 0 |
| 8349 | 1 | 0 |
| 8350 | 1 | 0 |
| 8351 | 1 | 0 |
| 8352 | 1 | 0 |
| 8353 | 1 | 0 |
| 8354 | 1 | 0 |
| 8355 | 1 | 0 |
| 8356 | 1 | 0 |
| 8357 | 1 | 0 |
| 8358 | 1 | 0 |
| 8359 | 1 | 0 |
| 8360 | 1 | 0 |
| 8361 | 1 | 0 |
| 8362 | 1 | 0 |
| 8363 | 1 | 0 |
| 8364 | 1 | 0 |
| 8365 | 1 | 0 |
| 8366 | 1 | 0 |
| 8367 | 1 | 0 |
| 8368 | 1 | 0 |
| 8369 | 1 | 0 |
| 8370 | 1 | 0 |
| 8371 | 1 | 0 |
| 8372 | 1 | 0 |
| 8373 | 1 | 0 |
| 8374 | 1 | 0 |
| 8375 | 1 | 0 |
| 8376 | 1 | 0 |
| 8377 | 1 | 0 |
| 8378 | 1 | 0 |
| 8379 | 1 | 0 |
| 8380 | 1 | 0 |
| 8381 | 1 | 0 |
| 8382 | 1 | 0 |
| 8383 | 1 | 0 |
| 8384 | 1 | 0 |
| 8385 | 1 | 0 |
| 8386 | 1 | 0 |
| 8387 | 1 | 0 |
| 8388 | 1 | 0 |
| 8389 | 1 | 0 |
| 8390 | 1 | 0 |
| 8391 | 1 | 0 |
| 8392 | 1 | 0 |
| 8393 | 1 | 0 |
| 8394 | 1 | 0 |
| 8395 | 1 | 0 |
| 8396 | 1 | 0 |
| 8397 | 1 | 0 |
| 8398 | 1 | 0 |
| 8399 | 1 | 0 |
| 8400 | 1 | 0 |
| 8401 | 1 | 0 |
| 8402 | 1 | 0 |
| 8403 | 1 | 0 |
| 8404 | 1 | 0 |
| 8405 | 1 | 0 |
| 8406 | 1 | 0 |
| 8407 | 1 | 0 |
| 8408 | 1 | 0 |
| 8409 | 1 | 0 |
| 8410 | 1 | 0 |
| 8411 | 1 | 0 |
| 8412 | 1 | 0 |
| 8413 | 1 | 0 |
| 8414 | 1 | 0 |
| 8415 | 1 | 0 |
| 8416 | 1 | 0 |
| 8417 | 1 | 0 |
| 8418 | 1 | 0 |
| 8419 | 1 | 0 |
| 8420 | 1 | 0 |
| 8421 | 1 | 0 |
| 8422 | 1 | 0 |
| 8423 | 1 | 0 |
| 8424 | 1 | 0 |
| 8425 | 1 | 0 |
| 8426 | 1 | 0 |
| 8427 | 1 | 0 |
| 8428 | 1 | 0 |
| 8429 | 1 | 0 |
| 8430 | 1 | 0 |
| 8431 | 1 | 0 |
| 8432 | 1 | 0 |
| 8433 | 1 | 0 |
| 8434 | 1 | 0 |
| 8435 | 1 | 0 |
| 8436 | 1 | 0 |
| 8437 | 1 | 0 |
| 8438 | 1 | 0 |
| 8439 | 1 | 0 |
| 8440 | 1 | 0 |
| 8441 | 1 | 0 |
| 8442 | 1 | 0 |
| 8443 | 1 | 0 |
| 8444 | 1 | 0 |
| 8445 | 1 | 0 |
| 8446 | 1 | 0 |
| 8447 | 1 | 0 |
| 8448 | 1 | 0 |
| 8449 | 1 | 0 |
| 8450 | 1 | 0 |
| 8451 | 1 | 0 |
| 8452 | 1 | 0 |
| 8453 | 1 | 0 |
| 8454 | 1 | 0 |
| 8455 | 1 | 0 |
| 8456 | 1 | 0 |
| 8457 | 1 | 0 |
| 8458 | 1 | 0 |
| 8459 | 1 | 0 |
| 8460 | 1 | 0 |
| 8461 | 1 | 0 |
| 8462 | 1 | 0 |
| 8463 | 1 | 0 |
| 8464 | 1 | 0 |
| 8465 | 1 | 0 |
| 8466 | 1 | 0 |
| 8467 | 1 | 0 |
| 8468 | 1 | 0 |
| 8469 | 1 | 0 |
| 8470 | 1 | 0 |
| 8471 | 1 | 0 |
| 8472 | 1 | 0 |
| 8473 | 1 | 0 |
| 8474 | 1 | 0 |
| 8475 | 1 | 0 |
| 8476 | 1 | 0 |
| 8477 | 1 | 0 |
| 8478 | 1 | 0 |
| 8479 | 1 | 0 |
| 8480 | 1 | 0 |
| 8481 | 1 | 0 |
| 8482 | 1 | 0 |
| 8483 | 1 | 0 |
| 8484 | 1 | 0 |
| 8485 | 1 | 0 |
| 8486 | 1 | 0 |
| 8487 | 1 | 0 |
| 8488 | 1 | 0 |
| 8489 | 1 | 0 |
| 8490 | 1 | 0 |
| 8491 | 1 | 0 |
| 8492 | 1 | 0 |
| 8493 | 1 | 0 |
| 8494 | 1 | 0 |
| 8495 | 1 | 0 |
| 8496 | 1 | 0 |
| 8497 | 1 | 0 |
| 8498 | 1 | 0 |
| 8499 | 1 | 0 |
| 8500 | 1 | 0 |
| 8501 | 1 | 0 |
| 8502 | 1 | 0 |
| 8503 | 1 | 0 |
| 8504 | 1 | 0 |
| 8505 | 1 | 0 |
| 8506 | 1 | 0 |
| 8507 | 1 | 0 |
| 8508 | 1 | 0 |
| 8509 | 1 | 0 |
| 8510 | 1 | 0 |
| 8511 | 1 | 0 |
| 8512 | 1 | 0 |
| 8513 | 1 | 0 |
| 8514 | 1 | 0 |
| 8515 | 1 | 0 |
| 8516 | 1 | 0 |
| 8517 | 1 | 0 |
| 8518 | 1 | 0 |
| 8519 | 1 | 0 |
| 8520 | 1 | 0 |
| 8521 | 1 | 0 |
| 8522 | 1 | 0 |
| 8523 | 1 | 0 |
| 8524 | 1 | 0 |
| 8525 | 1 | 0 |
| 8526 | 1 | 0 |
| 8527 | 1 | 0 |
| 8528 | 1 | 0 |
| 8529 | 1 | 0 |
| 8530 | 1 | 0 |
| 8531 | 1 | 0 |
| 8532 | 1 | 0 |
| 8533 | 1 | 0 |
| 8534 | 1 | 0 |
| 8535 | 1 | 0 |
| 8536 | 1 | 0 |
| 8537 | 1 | 0 |
| 8538 | 1 | 0 |
| 8539 | 1 | 0 |
| 8540 | 1 | 0 |
| 8541 | 1 | 0 |
| 8542 | 1 | 0 |
| 8543 | 1 | 0 |
| 8544 | 1 | 0 |
| 8545 | 1 | 0 |
| 8546 | 1 | 0 |
| 8547 | 1 | 0 |
| 8548 | 1 | 0 |
| 8549 | 1 | 0 |
| 8550 | 1 | 0 |
| 8551 | 1 | 0 |
| 8552 | 1 | 0 |
| 8553 | 1 | 0 |
| 8554 | 1 | 0 |
| 8555 | 1 | 0 |
| 8556 | 1 | 0 |
| 8557 | 1 | 0 |
| 8558 | 1 | 0 |
| 8559 | 1 | 0 |
| 8560 | 1 | 0 |
| 8561 | 1 | 0 |
| 8562 | 1 | 0 |
| 8563 | 1 | 0 |
| 8564 | 1 | 0 |
| 8565 | 1 | 0 |
| 8566 | 1 | 0 |
| 8567 | 1 | 0 |
| 8568 | 1 | 0 |
| 8569 | 1 | 0 |
| 8570 | 1 | 0 |
| 8571 | 1 | 0 |
| 8572 | 1 | 0 |
| 8573 | 1 | 0 |
| 8574 | 1 | 0 |
| 8575 | 1 | 0 |
| 8576 | 1 | 0 |
| 8577 | 1 | 0 |
| 8578 | 1 | 0 |
| 8579 | 1 | 0 |
| 8580 | 1 | 0 |
| 8581 | 1 | 0 |
| 8582 | 1 | 0 |
| 8583 | 1 | 0 |
| 8584 | 1 | 0 |
| 8585 | 1 | 0 |
| 8586 | 1 | 0 |
| 8587 | 1 | 0 |
| 8588 | 1 | 0 |
| 8589 | 1 | 0 |
| 8590 | 1 | 0 |
| 8591 | 1 | 0 |
| 8592 | 1 | 0 |
| 8593 | 1 | 0 |
| 8594 | 1 | 0 |
| 8595 | 1 | 0 |
| 8596 | 1 | 0 |
| 8597 | 1 | 0 |
| 8598 | 1 | 0 |
| 8599 | 1 | 0 |
| 8600 | 1 | 0 |
| 8601 | 1 | 0 |
| 8602 | 1 | 0 |
| 8603 | 1 | 0 |
| 8604 | 1 | 0 |
| 8605 | 1 | 0 |
| 8606 | 1 | 0 |
| 8607 | 1 | 0 |
| 8608 | 1 | 0 |
| 8609 | 1 | 0 |
| 8610 | 1 | 0 |
| 8611 | 1 | 0 |
| 8612 | 1 | 0 |
| 8613 | 1 | 0 |
| 8614 | 1 | 0 |
| 8615 | 1 | 0 |
| 8616 | 1 | 0 |
| 8617 | 1 | 0 |
| 8618 | 1 | 0 |
| 8619 | 1 | 0 |
| 8620 | 1 | 0 |
| 8621 | 1 | 0 |
| 8622 | 1 | 0 |
| 8623 | 1 | 0 |
| 8624 | 1 | 0 |
| 8625 | 1 | 0 |
| 8626 | 1 | 0 |
| 8627 | 1 | 0 |
| 8628 | 1 | 0 |
| 8629 | 1 | 0 |
| 8630 | 1 | 0 |
| 8631 | 1 | 0 |
| 8632 | 1 | 0 |
| 8633 | 1 | 0 |
| 8634 | 1 | 0 |
| 8635 | 1 | 0 |
| 8636 | 1 | 0 |
| 8637 | 1 | 0 |
| 8638 | 1 | 0 |
| 8639 | 1 | 0 |
| 8640 | 1 | 0 |
| 8641 | 1 | 0 |
| 8642 | 1 | 0 |
| 8643 | 1 | 0 |
| 8644 | 1 | 0 |
| 8645 | 1 | 0 |
| 8646 | 1 | 0 |
| 8647 | 1 | 0 |
| 8648 | 1 | 0 |
| 8649 | 1 | 0 |
| 8650 | 1 | 0 |
| 8651 | 1 | 0 |
| 8652 | 1 | 0 |
| 8653 | 1 | 0 |
| 8654 | 1 | 0 |
| 8655 | 1 | 0 |
| 8656 | 1 | 0 |
| 8657 | 1 | 0 |
| 8658 | 1 | 0 |
| 8659 | 1 | 0 |
| 8660 | 1 | 0 |
| 8661 | 1 | 0 |
| 8662 | 1 | 0 |
| 8663 | 1 | 0 |
| 8664 | 1 | 0 |
| 8665 | 1 | 0 |
| 8666 | 1 | 0 |
| 8667 | 1 | 0 |
| 8668 | 1 | 0 |
| 8669 | 1 | 0 |
| 8670 | 1 | 0 |
| 8671 | 1 | 0 |
| 8672 | 1 | 0 |
| 8673 | 1 | 0 |
| 8674 | 1 | 0 |
| 8675 | 1 | 0 |
| 8676 | 1 | 0 |
| 8677 | 1 | 0 |
| 8678 | 1 | 0 |
| 8679 | 1 | 0 |
| 8680 | 1 | 0 |
| 8681 | 1 | 0 |
| 8682 | 1 | 0 |
| 8683 | 1 | 0 |
| 8684 | 1 | 0 |
| 8685 | 1 | 0 |
| 8686 | 1 | 0 |
| 8687 | 1 | 0 |
| 8688 | 1 | 0 |
| 8689 | 1 | 0 |
| 8690 | 1 | 0 |
| 8691 | 1 | 0 |
| 8692 | 1 | 0 |
| 8693 | 1 | 0 |
| 8694 | 1 | 0 |
| 8695 | 1 | 0 |
| 8696 | 1 | 0 |
| 8697 | 1 | 0 |
| 8698 | 1 | 0 |
| 8699 | 1 | 0 |
| 8700 | 1 | 0 |
| 8701 | 1 | 0 |
| 8702 | 1 | 0 |
| 8703 | 1 | 0 |
| 8704 | 1 | 0 |
| 8705 | 1 | 0 |
| 8706 | 1 | 0 |
| 8707 | 1 | 0 |
| 8708 | 1 | 0 |
| 8709 | 1 | 0 |
| 8710 | 1 | 0 |
| 8711 | 1 | 0 |
| 8712 | 1 | 0 |
| 8713 | 1 | 0 |
| 8714 | 1 | 0 |
| 8715 | 1 | 0 |
| 8716 | 1 | 0 |
| 8717 | 1 | 0 |
| 8718 | 1 | 0 |
| 8719 | 1 | 0 |
| 8720 | 1 | 0 |
| 8721 | 1 | 0 |
| 8722 | 1 | 0 |
| 8723 | 1 | 0 |
| 8724 | 1 | 0 |
| 8725 | 1 | 0 |
| 8726 | 1 | 0 |
| 8727 | 1 | 0 |
| 8728 | 1 | 0 |
| 8729 | 1 | 0 |
| 8730 | 1 | 0 |
| 8731 | 1 | 0 |
| 8732 | 1 | 0 |
| 8733 | 1 | 0 |
| 8734 | 1 | 0 |
| 8735 | 1 | 0 |
| 8736 | 1 | 0 |
| 8737 | 1 | 0 |
| 8738 | 1 | 0 |
| 8739 | 1 | 0 |
| 8740 | 1 | 0 |
| 8741 | 1 | 0 |
| 8742 | 1 | 0 |
| 8743 | 1 | 0 |
| 8744 | 1 | 0 |
| 8745 | 1 | 0 |
| 8746 | 1 | 0 |
| 8747 | 1 | 0 |
| 8748 | 1 | 0 |
| 8749 | 1 | 0 |
| 8750 | 1 | 0 |
| 8751 | 1 | 0 |
| 8752 | 1 | 0 |
| 8753 | 1 | 0 |
| 8754 | 1 | 0 |
| 8755 | 1 | 0 |
| 8756 | 1 | 0 |
| 8757 | 1 | 0 |
| 8758 | 1 | 0 |
| 8759 | 1 | 0 |
| 8760 | 1 | 0 |
| 8761 | 1 | 0 |
| 8762 | 1 | 0 |
| 8763 | 1 | 0 |
| 8764 | 1 | 0 |
| 8765 | 1 | 0 |
| 8766 | 1 | 0 |
| 8767 | 1 | 0 |
| 8768 | 1 | 0 |
| 8769 | 1 | 0 |
| 8770 | 1 | 0 |
| 8771 | 1 | 0 |
| 8772 | 1 | 0 |
| 8773 | 1 | 0 |
| 8774 | 1 | 0 |
| 8775 | 1 | 0 |
| 8776 | 1 | 0 |
| 8777 | 1 | 0 |
| 8778 | 1 | 0 |
| 8779 | 1 | 0 |
| 8780 | 1 | 0 |
| 8781 | 1 | 0 |
| 8782 | 1 | 0 |
| 8783 | 1 | 0 |
| 8784 | 1 | 0 |
| 8785 | 1 | 0 |
| 8786 | 1 | 0 |
| 8787 | 1 | 0 |
| 8788 | 1 | 0 |
| 8789 | 1 | 0 |
| 8790 | 1 | 0 |
| 8791 | 1 | 0 |
| 8792 | 1 | 0 |
| 8793 | 1 | 0 |
| 8794 | 1 | 0 |
| 8795 | 1 | 0 |
| 8796 | 1 | 0 |
| 8797 | 1 | 0 |
| 8798 | 1 | 0 |
| 8799 | 1 | 0 |
| 8800 | 1 | 0 |
| 8801 | 1 | 0 |
| 8802 | 1 | 0 |
| 8803 | 1 | 0 |
| 8804 | 1 | 0 |
| 8805 | 1 | 0 |
| 8806 | 1 | 0 |
| 8807 | 1 | 0 |
| 8808 | 1 | 0 |
| 8809 | 1 | 0 |
| 8810 | 1 | 0 |
| 8811 | 1 | 0 |
| 8812 | 1 | 0 |
| 8813 | 1 | 0 |
| 8814 | 1 | 0 |
| 8815 | 1 | 0 |
| 8816 | 1 | 0 |
| 8817 | 1 | 0 |
| 8818 | 1 | 0 |
| 8819 | 1 | 0 |
| 8820 | 1 | 0 |
| 8821 | 1 | 0 |
| 8822 | 1 | 0 |
| 8823 | 1 | 0 |
| 8824 | 1 | 0 |
| 8825 | 1 | 0 |
| 8826 | 1 | 0 |
| 8827 | 1 | 0 |
| 8828 | 1 | 0 |
| 8829 | 1 | 0 |
| 8830 | 1 | 0 |
| 8831 | 1 | 0 |
| 8832 | 1 | 0 |
| 8833 | 1 | 0 |
| 8834 | 1 | 0 |
| 8835 | 1 | 0 |
| 8836 | 1 | 0 |
| 8837 | 1 | 0 |
| 8838 | 1 | 0 |
| 8839 | 1 | 0 |
| 8840 | 1 | 0 |
| 8841 | 1 | 0 |
| 8842 | 1 | 0 |
| 8843 | 1 | 0 |
| 8844 | 1 | 0 |
| 8845 | 1 | 0 |
| 8846 | 1 | 0 |
| 8847 | 1 | 0 |
| 8848 | 1 | 0 |
| 8849 | 1 | 0 |
| 8850 | 1 | 0 |
| 8851 | 1 | 0 |
| 8852 | 1 | 0 |
| 8853 | 1 | 0 |
| 8854 | 1 | 0 |
| 8855 | 1 | 0 |
| 8856 | 1 | 0 |
| 8857 | 1 | 0 |
| 8858 | 1 | 0 |
| 8859 | 1 | 0 |
| 8860 | 1 | 0 |
| 8861 | 1 | 0 |
| 8862 | 1 | 0 |
| 8863 | 1 | 0 |
| 8864 | 1 | 0 |
| 8865 | 1 | 0 |
| 8866 | 1 | 0 |
| 8867 | 1 | 0 |
| 8868 | 1 | 0 |
| 8869 | 1 | 0 |
| 8870 | 1 | 0 |
| 8871 | 1 | 0 |
| 8872 | 1 | 0 |
| 8873 | 1 | 0 |
| 8874 | 1 | 0 |
| 8875 | 1 | 0 |
| 8876 | 1 | 0 |
| 8877 | 1 | 0 |
| 8878 | 1 | 0 |
| 8879 | 1 | 0 |
| 8880 | 1 | 0 |
| 8881 | 1 | 0 |
| 8882 | 1 | 0 |
| 8883 | 1 | 0 |
| 8884 | 1 | 0 |
| 8885 | 1 | 0 |
| 8886 | 1 | 0 |
| 8887 | 1 | 0 |
| 8888 | 1 | 0 |
| 8889 | 1 | 0 |
| 8890 | 1 | 0 |
| 8891 | 1 | 0 |
| 8892 | 1 | 0 |
| 8893 | 1 | 0 |
| 8894 | 1 | 0 |
| 8895 | 1 | 0 |
| 8896 | 1 | 0 |
| 8897 | 1 | 0 |
| 8898 | 1 | 0 |
| 8899 | 1 | 0 |
| 8900 | 1 | 0 |
| 8901 | 1 | 0 |
| 8902 | 1 | 0 |
| 8903 | 1 | 0 |
| 8904 | 1 | 0 |
| 8905 | 1 | 0 |
| 8906 | 1 | 0 |
| 8907 | 1 | 0 |
| 8908 | 1 | 0 |
| 8909 | 1 | 0 |
| 8910 | 1 | 0 |
| 8911 | 1 | 0 |
| 8912 | 1 | 0 |
| 8913 | 1 | 0 |
| 8914 | 1 | 0 |
| 8915 | 1 | 0 |
| 8916 | 1 | 0 |
| 8917 | 1 | 0 |
| 8918 | 1 | 0 |
| 8919 | 1 | 0 |
| 8920 | 1 | 0 |
| 8921 | 1 | 0 |
| 8922 | 1 | 0 |
| 8923 | 1 | 0 |
| 8924 | 1 | 0 |
| 8925 | 1 | 0 |
| 8926 | 1 | 0 |
| 8927 | 1 | 0 |
| 8928 | 1 | 0 |
| 8929 | 1 | 0 |
| 8930 | 1 | 0 |
| 8931 | 1 | 0 |
| 8932 | 1 | 0 |
| 8933 | 1 | 0 |
| 8934 | 1 | 0 |
| 8935 | 1 | 0 |
| 8936 | 1 | 0 |
| 8937 | 1 | 0 |
| 8938 | 1 | 0 |
| 8939 | 1 | 0 |
| 8940 | 1 | 0 |
| 8941 | 1 | 0 |
| 8942 | 1 | 0 |
| 8943 | 1 | 0 |
| 8944 | 1 | 0 |
| 8945 | 1 | 0 |
| 8946 | 1 | 0 |
| 8947 | 1 | 0 |
| 8948 | 1 | 0 |
| 8949 | 1 | 0 |
| 8950 | 1 | 0 |
| 8951 | 1 | 0 |
| 8952 | 1 | 0 |
| 8953 | 1 | 0 |
| 8954 | 1 | 0 |
| 8955 | 1 | 0 |
| 8956 | 1 | 0 |
| 8957 | 1 | 0 |
| 8958 | 1 | 0 |
| 8959 | 1 | 0 |
| 8960 | 1 | 0 |
| 8961 | 1 | 0 |
| 8962 | 1 | 0 |
| 8963 | 1 | 0 |
| 8964 | 1 | 0 |
| 8965 | 1 | 0 |
| 8966 | 1 | 0 |
| 8967 | 1 | 0 |
| 8968 | 1 | 0 |
| 8969 | 1 | 0 |
| 8970 | 1 | 0 |
| 8971 | 1 | 0 |
| 8972 | 1 | 0 |
| 8973 | 1 | 0 |
| 8974 | 1 | 0 |
| 8975 | 1 | 0 |
| 8976 | 1 | 0 |
| 8977 | 1 | 0 |
| 8978 | 1 | 0 |
| 8979 | 1 | 0 |
| 8980 | 1 | 0 |
| 8981 | 1 | 0 |
| 8982 | 1 | 0 |
| 8983 | 1 | 0 |
| 8984 | 1 | 0 |
| 8985 | 1 | 0 |
| 8986 | 1 | 0 |
| 8987 | 1 | 0 |
| 8988 | 1 | 0 |
| 8989 | 1 | 0 |
| 8990 | 1 | 0 |
| 8991 | 1 | 0 |
| 8992 | 1 | 0 |
| 8993 | 1 | 0 |
| 8994 | 1 | 0 |
| 8995 | 1 | 0 |
| 8996 | 1 | 0 |
| 8997 | 1 | 0 |
| 8998 | 1 | 0 |
| 8999 | 1 | 0 |
| 9000 | 1 | 0 |
| 9001 | 1 | 0 |
| 9002 | 1 | 0 |
| 9003 | 1 | 0 |
| 9004 | 1 | 0 |
| 9005 | 1 | 0 |
| 9006 | 1 | 0 |
| 9007 | 1 | 0 |
| 9008 | 1 | 0 |
| 9009 | 1 | 0 |
| 9010 | 1 | 0 |
| 9011 | 1 | 0 |
| 9012 | 1 | 0 |
| 9013 | 1 | 0 |
| 9014 | 1 | 0 |
| 9015 | 1 | 0 |
| 9016 | 1 | 0 |
| 9017 | 1 | 0 |
| 9018 | 1 | 0 |
| 9019 | 1 | 0 |
| 9020 | 1 | 0 |
| 9021 | 1 | 0 |
| 9022 | 1 | 0 |
| 9023 | 1 | 0 |
| 9024 | 1 | 0 |
| 9025 | 1 | 0 |
| 9026 | 1 | 0 |
| 9027 | 1 | 0 |
| 9028 | 1 | 0 |
| 9029 | 1 | 0 |
| 9030 | 1 | 0 |
| 9031 | 1 | 0 |
| 9032 | 1 | 0 |
| 9033 | 1 | 0 |
| 9034 | 1 | 0 |
| 9035 | 1 | 0 |
| 9036 | 1 | 0 |
| 9037 | 1 | 0 |
| 9038 | 1 | 0 |
| 9039 | 1 | 0 |
| 9040 | 1 | 0 |
| 9041 | 1 | 0 |
| 9042 | 1 | 0 |
| 9043 | 1 | 0 |
| 9044 | 1 | 0 |
| 9045 | 1 | 0 |
| 9046 | 1 | 0 |
| 9047 | 1 | 0 |
| 9048 | 1 | 0 |
| 9049 | 1 | 0 |
| 9050 | 1 | 0 |
| 9051 | 1 | 0 |
| 9052 | 1 | 0 |
| 9053 | 1 | 0 |
| 9054 | 1 | 0 |
| 9055 | 1 | 0 |
| 9056 | 1 | 0 |
| 9057 | 1 | 0 |
| 9058 | 1 | 0 |
| 9059 | 1 | 0 |
| 9060 | 1 | 0 |
| 9061 | 1 | 0 |
| 9062 | 1 | 0 |
| 9063 | 1 | 0 |
| 9064 | 1 | 0 |
| 9065 | 1 | 0 |
| 9066 | 1 | 0 |
| 9067 | 1 | 0 |
| 9068 | 1 | 0 |
| 9069 | 1 | 0 |
| 9070 | 1 | 0 |
| 9071 | 1 | 0 |
| 9072 | 1 | 0 |
| 9073 | 1 | 0 |
| 9074 | 1 | 0 |
| 9075 | 1 | 0 |
| 9076 | 1 | 0 |
| 9077 | 1 | 0 |
| 9078 | 1 | 0 |
| 9079 | 1 | 0 |
| 9080 | 1 | 0 |
| 9081 | 1 | 0 |
| 9082 | 1 | 0 |
| 9083 | 1 | 0 |
| 9084 | 1 | 0 |
| 9085 | 1 | 0 |
| 9086 | 1 | 0 |
| 9087 | 1 | 0 |
| 9088 | 1 | 0 |
| 9089 | 1 | 0 |
| 9090 | 1 | 0 |
| 9091 | 1 | 0 |
| 9092 | 1 | 0 |
| 9093 | 1 | 0 |
| 9094 | 1 | 0 |
| 9095 | 1 | 0 |
| 9096 | 1 | 0 |
| 9097 | 1 | 0 |
| 9098 | 1 | 0 |
| 9099 | 1 | 0 |
| 9100 | 1 | 0 |
| 9101 | 1 | 0 |
| 9102 | 1 | 0 |
| 9103 | 1 | 0 |
| 9104 | 1 | 0 |
| 9105 | 1 | 0 |
| 9106 | 1 | 0 |
| 9107 | 1 | 0 |
| 9108 | 1 | 0 |
| 9109 | 1 | 0 |
| 9110 | 1 | 0 |
| 9111 | 1 | 0 |
| 9112 | 1 | 0 |
| 9113 | 1 | 0 |
| 9114 | 1 | 0 |
| 9115 | 1 | 0 |
| 9116 | 1 | 0 |
| 9117 | 1 | 0 |
| 9118 | 1 | 0 |
| 9119 | 1 | 0 |
| 9120 | 1 | 0 |
| 9121 | 1 | 0 |
| 9122 | 1 | 0 |
| 9123 | 1 | 0 |
| 9124 | 1 | 0 |
| 9125 | 1 | 0 |
| 9126 | 1 | 0 |
| 9127 | 1 | 0 |
| 9128 | 1 | 0 |
| 9129 | 1 | 0 |
| 9130 | 1 | 0 |
| 9131 | 1 | 0 |
| 9132 | 1 | 0 |
| 9133 | 1 | 0 |
| 9134 | 1 | 0 |
| 9135 | 1 | 0 |
| 9136 | 1 | 0 |
| 9137 | 1 | 0 |
| 9138 | 1 | 0 |
| 9139 | 1 | 0 |
| 9140 | 1 | 0 |
| 9141 | 1 | 0 |
| 9142 | 1 | 0 |
| 9143 | 1 | 0 |
| 9144 | 1 | 0 |
| 9145 | 1 | 0 |
| 9146 | 1 | 0 |
| 9147 | 1 | 0 |
| 9148 | 1 | 0 |
| 9149 | 1 | 0 |
| 9150 | 1 | 0 |
| 9151 | 1 | 0 |
| 9152 | 1 | 0 |
| 9153 | 1 | 0 |
| 9154 | 1 | 0 |
| 9155 | 1 | 0 |
| 9156 | 1 | 0 |
| 9157 | 1 | 0 |
| 9158 | 1 | 0 |
| 9159 | 1 | 0 |
| 9160 | 1 | 0 |
| 9161 | 1 | 0 |
| 9162 | 1 | 0 |
| 9163 | 1 | 0 |
| 9164 | 1 | 0 |
| 9165 | 1 | 0 |
| 9166 | 1 | 0 |
| 9167 | 1 | 0 |
| 9168 | 1 | 0 |
| 9169 | 1 | 0 |
| 9170 | 1 | 0 |
| 9171 | 1 | 0 |
| 9172 | 1 | 0 |
| 9173 | 1 | 0 |
| 9174 | 1 | 0 |
| 9175 | 1 | 0 |
| 9176 | 1 | 0 |
| 9177 | 1 | 0 |
| 9178 | 1 | 0 |
| 9179 | 1 | 0 |
| 9180 | 1 | 0 |
| 9181 | 1 | 0 |
| 9182 | 1 | 0 |
| 9183 | 1 | 0 |
| 9184 | 1 | 0 |
| 9185 | 1 | 0 |
| 9186 | 1 | 0 |
| 9187 | 1 | 0 |
| 9188 | 1 | 0 |
| 9189 | 1 | 0 |
| 9190 | 1 | 0 |
| 9191 | 1 | 0 |
| 9192 | 1 | 0 |
| 9193 | 1 | 0 |
| 9194 | 1 | 0 |
| 9195 | 1 | 0 |
| 9196 | 1 | 0 |
| 9197 | 1 | 0 |
| 9198 | 1 | 0 |
| 9199 | 1 | 0 |
| 9200 | 1 | 0 |
| 9201 | 1 | 0 |
| 9202 | 1 | 0 |
| 9203 | 1 | 0 |
| 9204 | 1 | 0 |
| 9205 | 1 | 0 |
| 9206 | 1 | 0 |
| 9207 | 1 | 0 |
| 9208 | 1 | 0 |
| 9209 | 1 | 0 |
| 9210 | 1 | 0 |
| 9211 | 1 | 0 |
| 9212 | 1 | 0 |
| 9213 | 1 | 0 |
| 9214 | 1 | 0 |
| 9215 | 1 | 0 |
| 9216 | 1 | 0 |
| 9217 | 1 | 0 |
| 9218 | 1 | 0 |
| 9219 | 1 | 0 |
| 9220 | 1 | 0 |
| 9221 | 1 | 0 |
| 9222 | 1 | 0 |
| 9223 | 1 | 0 |
| 9224 | 1 | 0 |
| 9225 | 1 | 0 |
| 9226 | 1 | 0 |
| 9227 | 1 | 0 |
| 9228 | 1 | 0 |
| 9229 | 1 | 0 |
| 9230 | 1 | 0 |
| 9231 | 1 | 0 |
| 9232 | 1 | 0 |
| 9233 | 1 | 0 |
| 9234 | 1 | 0 |
| 9235 | 1 | 0 |
| 9236 | 1 | 0 |
| 9237 | 1 | 0 |
| 9238 | 1 | 0 |
| 9239 | 1 | 0 |
| 9240 | 1 | 0 |
| 9241 | 1 | 0 |
| 9242 | 1 | 0 |
| 9243 | 1 | 0 |
| 9244 | 1 | 0 |
| 9245 | 1 | 0 |
| 9246 | 1 | 0 |
| 9247 | 1 | 0 |
| 9248 | 1 | 0 |
| 9249 | 1 | 0 |
| 9250 | 1 | 0 |
| 9251 | 1 | 0 |
| 9252 | 1 | 0 |
| 9253 | 1 | 0 |
| 9254 | 1 | 0 |
| 9255 | 1 | 0 |
| 9256 | 1 | 0 |
| 9257 | 1 | 0 |
| 9258 | 1 | 0 |
| 9259 | 1 | 0 |
| 9260 | 1 | 0 |
| 9261 | 1 | 0 |
| 9262 | 1 | 0 |
| 9263 | 1 | 0 |
| 9264 | 1 | 0 |
| 9265 | 1 | 0 |
| 9266 | 1 | 0 |
| 9267 | 1 | 0 |
| 9268 | 1 | 0 |
| 9269 | 1 | 0 |
| 9270 | 1 | 0 |
| 9271 | 1 | 0 |
| 9272 | 1 | 0 |
| 9273 | 1 | 0 |
| 9274 | 1 | 0 |
| 9275 | 1 | 0 |
| 9276 | 1 | 0 |
| 9277 | 1 | 0 |
| 9278 | 1 | 0 |
| 9279 | 1 | 0 |
| 9280 | 1 | 0 |
| 9281 | 1 | 0 |
| 9282 | 1 | 0 |
| 9283 | 1 | 0 |
| 9284 | 1 | 0 |
| 9285 | 1 | 0 |
| 9286 | 1 | 0 |
| 9287 | 1 | 0 |
| 9288 | 1 | 0 |
| 9289 | 1 | 0 |
| 9290 | 1 | 0 |
| 9291 | 1 | 0 |
| 9292 | 1 | 0 |
| 9293 | 1 | 0 |
| 9294 | 1 | 0 |
| 9295 | 1 | 0 |
| 9296 | 1 | 0 |
| 9297 | 1 | 0 |
| 9298 | 1 | 0 |
| 9299 | 1 | 0 |
| 9300 | 1 | 0 |
| 9301 | 1 | 0 |
| 9302 | 1 | 0 |
| 9303 | 1 | 0 |
| 9304 | 1 | 0 |
| 9305 | 1 | 0 |
| 9306 | 1 | 0 |
| 9307 | 1 | 0 |
| 9308 | 1 | 0 |
| 9309 | 1 | 0 |
| 9310 | 1 | 0 |
| 9311 | 1 | 0 |
| 9312 | 1 | 0 |
| 9313 | 1 | 0 |
| 9314 | 1 | 0 |
| 9315 | 1 | 0 |
| 9316 | 1 | 0 |
| 9317 | 1 | 0 |
| 9318 | 1 | 0 |
| 9319 | 1 | 0 |
| 9320 | 1 | 0 |
| 9321 | 1 | 0 |
| 9322 | 1 | 0 |
| 9323 | 1 | 0 |
| 9324 | 1 | 0 |
| 9325 | 1 | 0 |
| 9326 | 1 | 0 |
| 9327 | 1 | 0 |
| 9328 | 1 | 0 |
| 9329 | 1 | 0 |
| 9330 | 1 | 0 |
| 9331 | 1 | 0 |
| 9332 | 1 | 0 |
| 9333 | 1 | 0 |
| 9334 | 1 | 0 |
| 9335 | 1 | 0 |
| 9336 | 1 | 0 |
| 9337 | 1 | 0 |
| 9338 | 1 | 0 |
| 9339 | 1 | 0 |
| 9340 | 1 | 0 |
| 9341 | 1 | 0 |
| 9342 | 1 | 0 |
| 9343 | 1 | 0 |
| 9344 | 1 | 0 |
| 9345 | 1 | 0 |
| 9346 | 1 | 0 |
| 9347 | 1 | 0 |
| 9348 | 1 | 0 |
| 9349 | 1 | 0 |
| 9350 | 1 | 0 |
| 9351 | 1 | 0 |
| 9352 | 1 | 0 |
| 9353 | 1 | 0 |
| 9354 | 1 | 0 |
| 9355 | 1 | 0 |
| 9356 | 1 | 0 |
| 9357 | 1 | 0 |
| 9358 | 1 | 0 |
| 9359 | 1 | 0 |
| 9360 | 1 | 0 |
| 9361 | 1 | 0 |
| 9362 | 1 | 0 |
| 9363 | 1 | 0 |
| 9364 | 1 | 0 |
| 9365 | 1 | 0 |
| 9366 | 1 | 0 |
| 9367 | 1 | 0 |
| 9368 | 1 | 0 |
| 9369 | 1 | 0 |
| 9370 | 1 | 0 |
| 9371 | 1 | 0 |
| 9372 | 1 | 0 |
| 9373 | 1 | 0 |
| 9374 | 1 | 0 |
| 9375 | 1 | 0 |
| 9376 | 1 | 0 |
| 9377 | 1 | 0 |
| 9378 | 1 | 0 |
| 9379 | 1 | 0 |
| 9380 | 1 | 0 |
| 9381 | 1 | 0 |
| 9382 | 1 | 0 |
| 9383 | 1 | 0 |
| 9384 | 1 | 0 |
| 9385 | 1 | 0 |
| 9386 | 1 | 0 |
| 9387 | 1 | 0 |
| 9388 | 1 | 0 |
| 9389 | 1 | 0 |
| 9390 | 1 | 0 |
| 9391 | 1 | 0 |
| 9392 | 1 | 0 |
| 9393 | 1 | 0 |
| 9394 | 1 | 0 |
| 9395 | 1 | 0 |
| 9396 | 1 | 0 |
| 9397 | 1 | 0 |
| 9398 | 1 | 0 |
| 9399 | 1 | 0 |
| 9400 | 1 | 0 |
| 9401 | 1 | 0 |
| 9402 | 1 | 0 |
| 9403 | 1 | 0 |
| 9404 | 1 | 0 |
| 9405 | 1 | 0 |
| 9406 | 1 | 0 |
| 9407 | 1 | 0 |
| 9408 | 1 | 0 |
| 9409 | 1 | 0 |
| 9410 | 1 | 0 |
| 9411 | 1 | 0 |
| 9412 | 1 | 0 |
| 9413 | 1 | 0 |
| 9414 | 1 | 0 |
| 9415 | 1 | 0 |
| 9416 | 1 | 0 |
| 9417 | 1 | 0 |
| 9418 | 1 | 0 |
| 9419 | 1 | 0 |
| 9420 | 1 | 0 |
| 9421 | 1 | 0 |
| 9422 | 1 | 0 |
| 9423 | 1 | 0 |
| 9424 | 1 | 0 |
| 9425 | 1 | 0 |
| 9426 | 1 | 0 |
| 9427 | 1 | 0 |
| 9428 | 1 | 0 |
| 9429 | 1 | 0 |
| 9430 | 1 | 0 |
| 9431 | 1 | 0 |
| 9432 | 1 | 0 |
| 9433 | 1 | 0 |
| 9434 | 1 | 0 |
| 9435 | 1 | 0 |
| 9436 | 1 | 0 |
| 9437 | 1 | 0 |
| 9438 | 1 | 0 |
| 9439 | 1 | 0 |
| 9440 | 1 | 0 |
| 9441 | 1 | 0 |
| 9442 | 1 | 0 |
| 9443 | 1 | 0 |
| 9444 | 1 | 0 |
| 9445 | 1 | 0 |
| 9446 | 1 | 0 |
| 9447 | 1 | 0 |
| 9448 | 1 | 0 |
| 9449 | 1 | 0 |
| 9450 | 1 | 0 |
| 9451 | 1 | 0 |
| 9452 | 1 | 0 |
| 9453 | 1 | 0 |
| 9454 | 1 | 0 |
| 9455 | 1 | 0 |
| 9456 | 1 | 0 |
| 9457 | 1 | 0 |
| 9458 | 1 | 0 |
| 9459 | 1 | 0 |
| 9460 | 1 | 0 |
| 9461 | 1 | 0 |
| 9462 | 1 | 0 |
| 9463 | 1 | 0 |
| 9464 | 1 | 0 |
| 9465 | 1 | 0 |
| 9466 | 1 | 0 |
| 9467 | 1 | 0 |
| 9468 | 1 | 0 |
| 9469 | 1 | 0 |
| 9470 | 1 | 0 |
| 9471 | 1 | 0 |
| 9472 | 1 | 0 |
| 9473 | 1 | 0 |
| 9474 | 1 | 0 |
| 9475 | 1 | 0 |
| 9476 | 1 | 0 |
| 9477 | 1 | 0 |
| 9478 | 1 | 0 |
| 9479 | 1 | 0 |
| 9480 | 1 | 0 |
| 9481 | 1 | 0 |
| 9482 | 1 | 0 |
| 9483 | 1 | 0 |
| 9484 | 1 | 0 |
| 9485 | 1 | 0 |
| 9486 | 1 | 0 |
| 9487 | 1 | 0 |
| 9488 | 1 | 0 |
| 9489 | 1 | 0 |
| 9490 | 1 | 0 |
| 9491 | 1 | 0 |
| 9492 | 1 | 0 |
| 9493 | 1 | 0 |
| 9494 | 1 | 0 |
| 9495 | 1 | 0 |
| 9496 | 1 | 0 |
| 9497 | 1 | 0 |
| 9498 | 1 | 0 |
| 9499 | 1 | 0 |
| 9500 | 1 | 0 |
| 9501 | 1 | 0 |
| 9502 | 1 | 0 |
| 9503 | 1 | 0 |
| 9504 | 1 | 0 |
| 9505 | 1 | 0 |
| 9506 | 1 | 0 |
| 9507 | 1 | 0 |
| 9508 | 1 | 0 |
| 9509 | 1 | 0 |
| 9510 | 1 | 0 |
| 9511 | 1 | 0 |
| 9512 | 1 | 0 |
| 9513 | 1 | 0 |
| 9514 | 1 | 0 |
| 9515 | 1 | 0 |
| 9516 | 1 | 0 |
| 9517 | 1 | 0 |
| 9518 | 1 | 0 |
| 9519 | 1 | 0 |
| 9520 | 1 | 0 |
| 9521 | 1 | 0 |
| 9522 | 1 | 0 |
| 9523 | 1 | 0 |
| 9524 | 1 | 0 |
| 9525 | 1 | 0 |
| 9526 | 1 | 0 |
| 9527 | 1 | 0 |
| 9528 | 1 | 0 |
| 9529 | 1 | 0 |
| 9530 | 1 | 0 |
| 9531 | 1 | 0 |
| 9532 | 1 | 0 |
| 9533 | 1 | 0 |
| 9534 | 1 | 0 |
| 9535 | 1 | 0 |
| 9536 | 1 | 0 |
| 9537 | 1 | 0 |
| 9538 | 1 | 0 |
| 9539 | 1 | 0 |
| 9540 | 1 | 0 |
| 9541 | 1 | 0 |
| 9542 | 1 | 0 |
| 9543 | 1 | 0 |
| 9544 | 1 | 0 |
| 9545 | 1 | 0 |
| 9546 | 1 | 0 |
| 9547 | 1 | 0 |
| 9548 | 1 | 0 |
| 9549 | 1 | 0 |
| 9550 | 1 | 0 |
| 9551 | 1 | 0 |
| 9552 | 1 | 0 |
| 9553 | 1 | 0 |
| 9554 | 1 | 0 |
| 9555 | 1 | 0 |
| 9556 | 1 | 0 |
| 9557 | 1 | 0 |
| 9558 | 1 | 0 |
| 9559 | 1 | 0 |
| 9560 | 1 | 0 |
| 9561 | 1 | 0 |
| 9562 | 1 | 0 |
| 9563 | 1 | 0 |
| 9564 | 1 | 0 |
| 9565 | 1 | 0 |
| 9566 | 1 | 0 |
| 9567 | 1 | 0 |
| 9568 | 1 | 0 |
| 9569 | 1 | 0 |
| 9570 | 1 | 0 |
| 9571 | 1 | 0 |
| 9572 | 1 | 0 |
| 9573 | 1 | 0 |
| 9574 | 1 | 0 |
| 9575 | 1 | 0 |
| 9576 | 1 | 0 |
| 9577 | 1 | 0 |
| 9578 | 1 | 0 |
| 9579 | 1 | 0 |
| 9580 | 1 | 0 |
| 9581 | 1 | 0 |
| 9582 | 1 | 0 |
| 9583 | 1 | 0 |
| 9584 | 1 | 0 |
| 9585 | 1 | 0 |
| 9586 | 1 | 0 |
| 9587 | 1 | 0 |
| 9588 | 1 | 0 |
| 9589 | 1 | 0 |
| 9590 | 1 | 0 |
| 9591 | 1 | 0 |
| 9592 | 1 | 0 |
| 9593 | 1 | 0 |
| 9594 | 1 | 0 |
| 9595 | 1 | 0 |
| 9596 | 1 | 0 |
| 9597 | 1 | 0 |
| 9598 | 1 | 0 |
| 9599 | 1 | 0 |
| 9600 | 1 | 0 |
| 9601 | 1 | 0 |
| 9602 | 1 | 0 |
| 9603 | 1 | 0 |
| 9604 | 1 | 0 |
| 9605 | 1 | 0 |
| 9606 | 1 | 0 |
| 9607 | 1 | 0 |
| 9608 | 1 | 0 |
| 9609 | 1 | 0 |
| 9610 | 1 | 0 |
| 9611 | 1 | 0 |
| 9612 | 1 | 0 |
| 9613 | 1 | 0 |
| 9614 | 1 | 0 |
| 9615 | 1 | 0 |
| 9616 | 1 | 0 |
| 9617 | 1 | 0 |
| 9618 | 1 | 0 |
| 9619 | 1 | 0 |
| 9620 | 1 | 0 |
| 9621 | 1 | 0 |
| 9622 | 1 | 0 |
| 9623 | 1 | 0 |
| 9624 | 1 | 0 |
| 9625 | 1 | 0 |
| 9626 | 1 | 0 |
| 9627 | 1 | 0 |
| 9628 | 1 | 0 |
| 9629 | 1 | 0 |
| 9630 | 1 | 0 |
| 9631 | 1 | 0 |
| 9632 | 1 | 0 |
| 9633 | 1 | 0 |
| 9634 | 1 | 0 |
| 9635 | 1 | 0 |
| 9636 | 1 | 0 |
| 9637 | 1 | 0 |
| 9638 | 1 | 0 |
| 9639 | 1 | 0 |
| 9640 | 1 | 0 |
| 9641 | 1 | 0 |
| 9642 | 1 | 0 |
| 9643 | 1 | 0 |
| 9644 | 1 | 0 |
| 9645 | 1 | 0 |
| 9646 | 1 | 0 |
| 9647 | 1 | 0 |
| 9648 | 1 | 0 |
| 9649 | 1 | 0 |
| 9650 | 1 | 0 |
| 9651 | 1 | 0 |
| 9652 | 1 | 0 |
| 9653 | 1 | 0 |
| 9654 | 1 | 0 |
| 9655 | 1 | 0 |
| 9656 | 1 | 0 |
| 9657 | 1 | 0 |
| 9658 | 1 | 0 |
| 9659 | 1 | 0 |
| 9660 | 1 | 0 |
| 9661 | 1 | 0 |
| 9662 | 1 | 0 |
| 9663 | 1 | 0 |
| 9664 | 1 | 0 |
| 9665 | 1 | 0 |
| 9666 | 1 | 0 |
| 9667 | 1 | 0 |
| 9668 | 1 | 0 |
| 9669 | 1 | 0 |
| 9670 | 1 | 0 |
| 9671 | 1 | 0 |
| 9672 | 1 | 0 |
| 9673 | 1 | 0 |
| 9674 | 1 | 0 |
| 9675 | 1 | 0 |
| 9676 | 1 | 0 |
| 9677 | 1 | 0 |
| 9678 | 1 | 0 |
| 9679 | 1 | 0 |
| 9680 | 1 | 0 |
| 9681 | 1 | 0 |
| 9682 | 1 | 0 |
| 9683 | 1 | 0 |
| 9684 | 1 | 0 |
| 9685 | 1 | 0 |
| 9686 | 1 | 0 |
| 9687 | 1 | 0 |
| 9688 | 1 | 0 |
| 9689 | 1 | 0 |
| 9690 | 1 | 0 |
| 9691 | 1 | 0 |
| 9692 | 1 | 0 |
| 9693 | 1 | 0 |
| 9694 | 1 | 0 |
| 9695 | 1 | 0 |
| 9696 | 1 | 0 |
| 9697 | 1 | 0 |
| 9698 | 1 | 0 |
| 9699 | 1 | 0 |
| 9700 | 1 | 0 |
| 9701 | 1 | 0 |
| 9702 | 1 | 0 |
| 9703 | 1 | 0 |
| 9704 | 1 | 0 |
| 9705 | 1 | 0 |
| 9706 | 1 | 0 |
| 9707 | 1 | 0 |
| 9708 | 1 | 0 |
| 9709 | 1 | 0 |
| 9710 | 1 | 0 |
| 9711 | 1 | 0 |
| 9712 | 1 | 0 |
| 9713 | 1 | 0 |
| 9714 | 1 | 0 |
| 9715 | 1 | 0 |
| 9716 | 1 | 0 |
| 9717 | 1 | 0 |
| 9718 | 1 | 0 |
| 9719 | 1 | 0 |
| 9720 | 1 | 0 |
| 9721 | 1 | 0 |
| 9722 | 1 | 0 |
| 9723 | 1 | 0 |
| 9724 | 1 | 0 |
| 9725 | 1 | 0 |
| 9726 | 1 | 0 |
| 9727 | 1 | 0 |
| 9728 | 1 | 0 |
| 9729 | 1 | 0 |
| 9730 | 1 | 0 |
| 9731 | 1 | 0 |
| 9732 | 1 | 0 |
| 9733 | 1 | 0 |
| 9734 | 1 | 0 |
| 9735 | 1 | 0 |
| 9736 | 1 | 0 |
| 9737 | 1 | 0 |
| 9738 | 1 | 0 |
| 9739 | 1 | 0 |
| 9740 | 1 | 0 |
| 9741 | 1 | 0 |
| 9742 | 1 | 0 |
| 9743 | 1 | 0 |
| 9744 | 1 | 0 |
| 9745 | 1 | 0 |
| 9746 | 1 | 0 |
| 9747 | 1 | 0 |
| 9748 | 1 | 0 |
| 9749 | 1 | 0 |
| 9750 | 1 | 0 |
| 9751 | 1 | 0 |
| 9752 | 1 | 0 |
| 9753 | 1 | 0 |
| 9754 | 1 | 0 |
| 9755 | 1 | 0 |
| 9756 | 1 | 0 |
| 9757 | 1 | 0 |
| 9758 | 1 | 0 |
| 9759 | 1 | 0 |
| 9760 | 1 | 0 |
| 9761 | 1 | 0 |
| 9762 | 1 | 0 |
| 9763 | 1 | 0 |
| 9764 | 1 | 0 |
| 9765 | 1 | 0 |
| 9766 | 1 | 0 |
| 9767 | 1 | 0 |
| 9768 | 1 | 0 |
| 9769 | 1 | 0 |
| 9770 | 1 | 0 |
| 9771 | 1 | 0 |
| 9772 | 1 | 0 |
| 9773 | 1 | 0 |
| 9774 | 1 | 0 |
| 9775 | 1 | 0 |
| 9776 | 1 | 0 |
| 9777 | 1 | 0 |
| 9778 | 1 | 0 |
| 9779 | 1 | 0 |
| 9780 | 1 | 0 |
| 9781 | 1 | 0 |
| 9782 | 1 | 0 |
| 9783 | 1 | 0 |
| 9784 | 1 | 0 |
| 9785 | 1 | 0 |
| 9786 | 1 | 0 |
| 9787 | 1 | 0 |
| 9788 | 1 | 0 |
| 9789 | 1 | 0 |
| 9790 | 1 | 0 |
| 9791 | 1 | 0 |
| 9792 | 1 | 0 |
| 9793 | 1 | 0 |
| 9794 | 1 | 0 |
| 9795 | 1 | 0 |
| 9796 | 1 | 0 |
| 9797 | 1 | 0 |
| 9798 | 1 | 0 |
| 9799 | 1 | 0 |
| 9800 | 1 | 0 |
| 9801 | 1 | 0 |
| 9802 | 1 | 0 |
| 9803 | 1 | 0 |
| 9804 | 1 | 0 |
| 9805 | 1 | 0 |
| 9806 | 1 | 0 |
| 9807 | 1 | 0 |
| 9808 | 1 | 0 |
| 9809 | 1 | 0 |
| 9810 | 1 | 0 |
| 9811 | 1 | 0 |
| 9812 | 1 | 0 |
| 9813 | 1 | 0 |
| 9814 | 1 | 0 |
| 9815 | 1 | 0 |
| 9816 | 1 | 0 |
| 9817 | 1 | 0 |
| 9818 | 1 | 0 |
| 9819 | 1 | 0 |
| 9820 | 1 | 0 |
| 9821 | 1 | 0 |
| 9822 | 1 | 0 |
| 9823 | 1 | 0 |
| 9824 | 1 | 0 |
| 9825 | 1 | 0 |
| 9826 | 1 | 0 |
| 9827 | 1 | 0 |
| 9828 | 1 | 0 |
| 9829 | 1 | 0 |
| 9830 | 1 | 0 |
| 9831 | 1 | 0 |
| 9832 | 1 | 0 |
| 9833 | 1 | 0 |
| 9834 | 1 | 0 |
| 9835 | 1 | 0 |
| 9836 | 1 | 0 |
| 9837 | 1 | 0 |
| 9838 | 1 | 0 |
| 9839 | 1 | 0 |
| 9840 | 1 | 0 |
| 9841 | 1 | 0 |
| 9842 | 1 | 0 |
| 9843 | 1 | 0 |
| 9844 | 1 | 0 |
| 9845 | 1 | 0 |
| 9846 | 1 | 0 |
| 9847 | 1 | 0 |
| 9848 | 1 | 0 |
| 9849 | 1 | 0 |
| 9850 | 1 | 0 |
| 9851 | 1 | 0 |
| 9852 | 1 | 0 |
| 9853 | 1 | 0 |
| 9854 | 1 | 0 |
| 9855 | 1 | 0 |
| 9856 | 1 | 0 |
| 9857 | 1 | 0 |
| 9858 | 1 | 0 |
| 9859 | 1 | 0 |
| 9860 | 1 | 0 |
| 9861 | 1 | 0 |
| 9862 | 1 | 0 |
| 9863 | 1 | 0 |
| 9864 | 1 | 0 |
| 9865 | 1 | 0 |
| 9866 | 1 | 0 |
| 9867 | 1 | 0 |
| 9868 | 1 | 0 |
| 9869 | 1 | 0 |
| 9870 | 1 | 0 |
| 9871 | 1 | 0 |
| 9872 | 1 | 0 |
| 9873 | 1 | 0 |
| 9874 | 1 | 0 |
| 9875 | 1 | 0 |
| 9876 | 1 | 0 |
| 9877 | 1 | 0 |
| 9878 | 1 | 0 |
| 9879 | 1 | 0 |
| 9880 | 1 | 0 |
| 9881 | 1 | 0 |
| 9882 | 1 | 0 |
| 9883 | 1 | 0 |
| 9884 | 1 | 0 |
| 9885 | 1 | 0 |
| 9886 | 1 | 0 |
| 9887 | 1 | 0 |
| 9888 | 1 | 0 |
| 9889 | 1 | 0 |
| 9890 | 1 | 0 |
| 9891 | 1 | 0 |
| 9892 | 1 | 0 |
| 9893 | 1 | 0 |
| 9894 | 1 | 0 |
| 9895 | 1 | 0 |
| 9896 | 1 | 0 |
| 9897 | 1 | 0 |
| 9898 | 1 | 0 |
| 9899 | 1 | 0 |
| 9900 | 1 | 0 |
| 9901 | 1 | 0 |
| 9902 | 1 | 0 |
| 9903 | 1 | 0 |
| 9904 | 1 | 0 |
| 9905 | 1 | 0 |
| 9906 | 1 | 0 |
| 9907 | 1 | 0 |
| 9908 | 1 | 0 |
| 9909 | 1 | 0 |
| 9910 | 1 | 0 |
| 9911 | 1 | 0 |
| 9912 | 1 | 0 |
| 9913 | 1 | 0 |
| 9914 | 1 | 0 |
| 9915 | 1 | 0 |
| 9916 | 1 | 0 |
| 9917 | 1 | 0 |
| 9918 | 1 | 0 |
| 9919 | 1 | 0 |
| 9920 | 1 | 0 |
| 9921 | 1 | 0 |
| 9922 | 1 | 0 |
| 9923 | 1 | 0 |
| 9924 | 1 | 0 |
| 9925 | 1 | 0 |
| 9926 | 1 | 0 |
| 9927 | 1 | 0 |
| 9928 | 1 | 0 |
| 9929 | 1 | 0 |
| 9930 | 1 | 0 |
| 9931 | 1 | 0 |
| 9932 | 1 | 0 |
| 9933 | 1 | 0 |
| 9934 | 1 | 0 |
| 9935 | 1 | 0 |
| 9936 | 1 | 0 |
| 9937 | 1 | 0 |
| 9938 | 1 | 0 |
| 9939 | 1 | 0 |
| 9940 | 1 | 0 |
| 9941 | 1 | 0 |
| 9942 | 1 | 0 |
| 9943 | 1 | 0 |
| 9944 | 1 | 0 |
| 9945 | 1 | 0 |
| 9946 | 1 | 0 |
| 9947 | 1 | 0 |
| 9948 | 1 | 0 |
| 9949 | 1 | 0 |
| 9950 | 1 | 0 |
| 9951 | 1 | 0 |
| 9952 | 1 | 0 |
| 9953 | 1 | 0 |
| 9954 | 1 | 0 |
| 9955 | 1 | 0 |
| 9956 | 1 | 0 |
| 9957 | 1 | 0 |
| 9958 | 1 | 0 |
| 9959 | 1 | 0 |
| 9960 | 1 | 0 |
| 9961 | 1 | 0 |
| 9962 | 1 | 0 |
| 9963 | 1 | 0 |
| 9964 | 1 | 0 |
| 9965 | 1 | 0 |
| 9966 | 1 | 0 |
| 9967 | 1 | 0 |
| 9968 | 1 | 0 |
| 9969 | 1 | 0 |
| 9970 | 1 | 0 |
| 9971 | 1 | 0 |
| 9972 | 1 | 0 |
| 9973 | 1 | 0 |
| 9974 | 1 | 0 |
| 9975 | 1 | 0 |
| 9976 | 1 | 0 |
| 9977 | 1 | 0 |
| 9978 | 1 | 0 |
| 9979 | 1 | 0 |
| 9980 | 1 | 0 |
| 9981 | 1 | 0 |
| 9982 | 1 | 0 |
| 9983 | 1 | 0 |
| 9984 | 1 | 0 |
| 9985 | 1 | 0 |
| 9986 | 1 | 0 |
| 9987 | 1 | 0 |
| 9988 | 1 | 0 |
| 9989 | 1 | 0 |
| 9990 | 1 | 0 |
| 9991 | 1 | 0 |
| 9992 | 1 | 0 |
| 9993 | 1 | 0 |
| 9994 | 1 | 0 |
| 9995 | 1 | 0 |
| 9996 | 1 | 0 |
| 9997 | 1 | 0 |